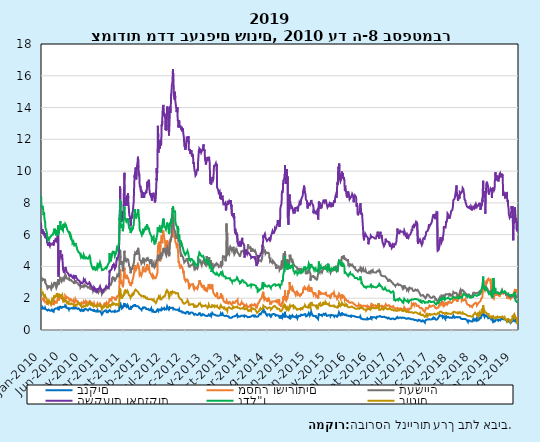
| Category | בנקים | מסחר ושירותים | תעשייה | השקעות ואחזקות | נדל"ן | ביטוח |
|---|---|---|---|---|---|---|
| 2010-01-02 | 1.445 | 2.104 | 3.277 | 6.786 | 8.48 | 2.651 |
| 2010-01-03 | 1.356 | 1.97 | 3.35 | 6.396 | 8.26 | 2.573 |
| 2010-01-04 | 1.299 | 1.884 | 3.279 | 6.237 | 8.004 | 2.469 |
| 2010-01-05 | 1.31 | 1.914 | 3.286 | 6.203 | 7.849 | 2.472 |
| 2010-01-06 | 1.352 | 1.98 | 3.297 | 6.229 | 7.878 | 2.472 |
| 2010-01-07 | 1.352 | 1.96 | 3.25 | 6.155 | 7.773 | 2.378 |
| 2010-01-08 | 1.352 | 1.96 | 3.25 | 6.155 | 7.773 | 2.378 |
| 2010-01-09 | 1.352 | 1.96 | 3.25 | 6.155 | 7.773 | 2.378 |
| 2010-01-10 | 1.344 | 1.93 | 3.135 | 6.077 | 7.675 | 2.347 |
| 2010-01-11 | 1.345 | 1.92 | 3.101 | 6.111 | 7.618 | 2.361 |
| 2010-01-12 | 1.443 | 2.02 | 3.234 | 6.333 | 7.81 | 2.43 |
| 2010-01-13 | 1.413 | 1.995 | 3.192 | 6.247 | 7.774 | 2.387 |
| 2010-01-14 | 1.405 | 1.983 | 3.141 | 6.208 | 7.703 | 2.363 |
| 2010-01-15 | 1.405 | 1.983 | 3.141 | 6.208 | 7.703 | 2.363 |
| 2010-01-16 | 1.405 | 1.983 | 3.141 | 6.208 | 7.703 | 2.363 |
| 2010-01-17 | 1.425 | 1.971 | 3.128 | 6.197 | 7.614 | 2.273 |
| 2010-01-18 | 1.436 | 2.028 | 3.193 | 6.2 | 7.576 | 2.263 |
| 2010-01-19 | 1.415 | 1.93 | 3.145 | 6.084 | 7.372 | 2.255 |
| 2010-01-20 | 1.35 | 1.887 | 3.114 | 6.013 | 7.23 | 2.165 |
| 2010-01-21 | 1.377 | 1.92 | 3.196 | 6.064 | 7.305 | 2.194 |
| 2010-01-22 | 1.377 | 1.92 | 3.196 | 6.064 | 7.305 | 2.194 |
| 2010-01-23 | 1.377 | 1.92 | 3.196 | 6.064 | 7.305 | 2.194 |
| 2010-01-24 | 1.401 | 1.952 | 3.253 | 6.189 | 7.424 | 2.203 |
| 2010-01-25 | 1.37 | 1.875 | 3.198 | 6.049 | 7.287 | 2.162 |
| 2010-01-26 | 1.335 | 1.863 | 3.159 | 6.047 | 7.158 | 2.099 |
| 2010-01-27 | 1.315 | 1.839 | 3.166 | 5.995 | 7.061 | 2.07 |
| 2010-01-28 | 1.333 | 1.812 | 3.144 | 5.907 | 6.96 | 2.079 |
| 2010-01-29 | 1.333 | 1.812 | 3.144 | 5.907 | 6.96 | 2.079 |
| 2010-01-30 | 1.333 | 1.812 | 3.144 | 5.907 | 6.96 | 2.079 |
| 2010-01-31 | 1.402 | 1.855 | 3.216 | 6.081 | 7.021 | 2.171 |
| 2010-02-01 | 1.411 | 1.848 | 3.218 | 6.066 | 6.969 | 2.175 |
| 2010-02-02 | 1.344 | 1.742 | 3.184 | 5.952 | 6.749 | 2.122 |
| 2010-02-03 | 1.325 | 1.723 | 2.955 | 5.778 | 6.435 | 2.08 |
| 2010-02-04 | 1.298 | 1.702 | 2.903 | 5.769 | 6.407 | 2.031 |
| 2010-02-05 | 1.298 | 1.702 | 2.903 | 5.769 | 6.407 | 2.031 |
| 2010-02-06 | 1.298 | 1.702 | 2.903 | 5.769 | 6.407 | 2.031 |
| 2010-02-07 | 1.32 | 1.723 | 2.925 | 5.863 | 6.427 | 2.028 |
| 2010-02-08 | 1.331 | 1.771 | 2.885 | 5.874 | 6.333 | 2.047 |
| 2010-02-09 | 1.32 | 1.789 | 2.918 | 5.933 | 6.341 | 2.034 |
| 2010-02-10 | 1.305 | 1.785 | 2.909 | 5.834 | 6.315 | 2.006 |
| 2010-02-11 | 1.282 | 1.799 | 2.837 | 5.802 | 6.219 | 1.965 |
| 2010-02-12 | 1.282 | 1.799 | 2.837 | 5.802 | 6.219 | 1.965 |
| 2010-02-13 | 1.282 | 1.799 | 2.837 | 5.802 | 6.219 | 1.965 |
| 2010-02-14 | 1.261 | 1.728 | 2.781 | 5.715 | 6.12 | 1.886 |
| 2010-02-15 | 1.285 | 1.734 | 2.76 | 5.727 | 6.042 | 1.865 |
| 2010-02-16 | 1.227 | 1.593 | 2.69 | 5.507 | 5.873 | 1.759 |
| 2010-02-17 | 1.235 | 1.651 | 2.664 | 5.478 | 5.858 | 1.72 |
| 2010-02-18 | 1.227 | 1.67 | 2.623 | 5.464 | 5.815 | 1.721 |
| 2010-02-19 | 1.227 | 1.67 | 2.623 | 5.464 | 5.815 | 1.721 |
| 2010-02-20 | 1.227 | 1.67 | 2.623 | 5.464 | 5.815 | 1.721 |
| 2010-02-21 | 1.208 | 1.633 | 2.597 | 5.384 | 5.679 | 1.704 |
| 2010-02-22 | 1.207 | 1.675 | 2.6 | 5.353 | 5.658 | 1.683 |
| 2010-02-23 | 1.222 | 1.674 | 2.64 | 5.301 | 5.706 | 1.764 |
| 2010-02-24 | 1.233 | 1.72 | 2.677 | 5.43 | 5.733 | 1.754 |
| 2010-02-25 | 1.285 | 1.732 | 2.724 | 5.448 | 5.775 | 1.814 |
| 2010-02-26 | 1.285 | 1.732 | 2.724 | 5.448 | 5.775 | 1.814 |
| 2010-02-27 | 1.285 | 1.732 | 2.724 | 5.448 | 5.775 | 1.814 |
| 2010-02-28 | 1.285 | 1.732 | 2.724 | 5.448 | 5.775 | 1.814 |
| 2010-03-01 | 1.316 | 1.76 | 2.802 | 5.517 | 5.814 | 1.865 |
| 2010-03-02 | 1.259 | 1.717 | 2.694 | 5.38 | 5.689 | 1.835 |
| 2010-03-03 | 1.26 | 1.691 | 2.684 | 5.34 | 5.658 | 1.834 |
| 2010-03-04 | 1.253 | 1.721 | 2.713 | 5.333 | 5.704 | 1.822 |
| 2010-03-05 | 1.253 | 1.721 | 2.713 | 5.333 | 5.704 | 1.822 |
| 2010-03-06 | 1.253 | 1.721 | 2.713 | 5.333 | 5.704 | 1.822 |
| 2010-03-07 | 1.226 | 1.636 | 2.69 | 5.293 | 5.685 | 1.777 |
| 2010-03-08 | 1.216 | 1.676 | 2.687 | 5.299 | 5.729 | 1.773 |
| 2010-03-09 | 1.254 | 1.726 | 2.729 | 5.442 | 5.829 | 1.825 |
| 2010-03-10 | 1.252 | 1.72 | 2.729 | 5.445 | 5.839 | 1.788 |
| 2010-03-11 | 1.245 | 1.717 | 2.726 | 5.427 | 5.87 | 1.813 |
| 2010-03-12 | 1.245 | 1.717 | 2.726 | 5.427 | 5.87 | 1.813 |
| 2010-03-13 | 1.245 | 1.717 | 2.726 | 5.427 | 5.87 | 1.813 |
| 2010-03-14 | 1.226 | 1.689 | 2.732 | 5.385 | 5.879 | 1.732 |
| 2010-03-15 | 1.211 | 1.623 | 2.706 | 5.349 | 5.863 | 1.711 |
| 2010-03-16 | 1.226 | 1.637 | 2.739 | 5.361 | 5.898 | 1.724 |
| 2010-03-17 | 1.213 | 1.661 | 2.704 | 5.333 | 5.842 | 1.689 |
| 2010-03-18 | 1.186 | 1.592 | 2.583 | 5.313 | 5.858 | 1.646 |
| 2010-03-19 | 1.186 | 1.592 | 2.583 | 5.313 | 5.858 | 1.646 |
| 2010-03-20 | 1.186 | 1.592 | 2.583 | 5.313 | 5.858 | 1.646 |
| 2010-03-21 | 1.215 | 1.599 | 2.591 | 5.37 | 5.88 | 1.615 |
| 2010-03-22 | 1.263 | 1.668 | 2.707 | 5.43 | 5.97 | 1.596 |
| 2010-03-23 | 1.277 | 1.741 | 2.851 | 5.478 | 6.014 | 1.603 |
| 2010-03-24 | 1.263 | 1.717 | 2.83 | 5.44 | 5.937 | 1.614 |
| 2010-03-25 | 1.249 | 1.69 | 2.847 | 5.466 | 5.982 | 1.92 |
| 2010-03-26 | 1.249 | 1.69 | 2.847 | 5.466 | 5.982 | 1.92 |
| 2010-03-27 | 1.249 | 1.69 | 2.847 | 5.466 | 5.982 | 1.92 |
| 2010-03-28 | 1.195 | 1.639 | 2.797 | 5.461 | 5.996 | 1.855 |
| 2010-03-29 | 1.195 | 1.639 | 2.797 | 5.461 | 5.996 | 1.855 |
| 2010-03-30 | 1.195 | 1.639 | 2.797 | 5.461 | 5.996 | 1.855 |
| 2010-03-31 | 1.156 | 1.622 | 2.726 | 5.459 | 6.007 | 1.834 |
| 2010-04-01 | 1.148 | 1.618 | 2.75 | 5.434 | 5.964 | 1.899 |
| 2010-04-02 | 1.148 | 1.618 | 2.75 | 5.434 | 5.964 | 1.899 |
| 2010-04-03 | 1.148 | 1.618 | 2.75 | 5.434 | 5.964 | 1.899 |
| 2010-04-04 | 1.148 | 1.618 | 2.75 | 5.434 | 5.964 | 1.899 |
| 2010-04-05 | 1.148 | 1.618 | 2.75 | 5.434 | 5.964 | 1.899 |
| 2010-04-06 | 1.168 | 1.669 | 2.831 | 5.319 | 6.054 | 1.95 |
| 2010-04-07 | 1.246 | 1.772 | 2.916 | 5.499 | 6.204 | 2.039 |
| 2010-04-08 | 1.3 | 1.843 | 3.021 | 5.642 | 6.372 | 2.118 |
| 2010-04-09 | 1.3 | 1.843 | 3.021 | 5.642 | 6.372 | 2.118 |
| 2010-04-10 | 1.3 | 1.843 | 3.021 | 5.642 | 6.372 | 2.118 |
| 2010-04-11 | 1.309 | 1.828 | 2.995 | 5.616 | 6.281 | 2.149 |
| 2010-04-12 | 1.256 | 1.73 | 2.927 | 5.52 | 6.195 | 2.098 |
| 2010-04-13 | 1.281 | 1.749 | 2.929 | 5.533 | 6.163 | 2.121 |
| 2010-04-14 | 1.312 | 1.79 | 2.915 | 5.569 | 6.173 | 2.14 |
| 2010-04-15 | 1.329 | 1.809 | 2.919 | 5.624 | 6.216 | 2.085 |
| 2010-04-16 | 1.329 | 1.809 | 2.919 | 5.624 | 6.216 | 2.085 |
| 2010-04-17 | 1.329 | 1.809 | 2.919 | 5.624 | 6.216 | 2.085 |
| 2010-04-18 | 1.35 | 1.87 | 2.962 | 5.696 | 6.271 | 2.159 |
| 2010-04-19 | 1.35 | 1.87 | 2.962 | 5.696 | 6.271 | 2.159 |
| 2010-04-20 | 1.35 | 1.87 | 2.962 | 5.696 | 6.271 | 2.159 |
| 2010-04-21 | 1.356 | 1.818 | 2.767 | 5.671 | 6.059 | 2.144 |
| 2010-04-22 | 1.322 | 1.764 | 2.711 | 5.635 | 6.082 | 2.142 |
| 2010-04-23 | 1.322 | 1.764 | 2.711 | 5.635 | 6.082 | 2.142 |
| 2010-04-24 | 1.322 | 1.764 | 2.711 | 5.635 | 6.082 | 2.142 |
| 2010-04-25 | 1.304 | 1.673 | 2.646 | 5.61 | 6.011 | 2.122 |
| 2010-04-26 | 1.327 | 1.697 | 2.668 | 5.615 | 6.05 | 2.14 |
| 2010-04-27 | 1.35 | 1.728 | 2.68 | 5.64 | 6.073 | 2.172 |
| 2010-04-28 | 1.363 | 1.77 | 2.675 | 5.782 | 6.143 | 2.206 |
| 2010-04-29 | 1.382 | 1.81 | 2.745 | 5.844 | 6.289 | 2.332 |
| 2010-04-30 | 1.382 | 1.81 | 2.745 | 5.844 | 6.289 | 2.332 |
| 2010-05-01 | 1.382 | 1.81 | 2.745 | 5.844 | 6.289 | 2.332 |
| 2010-05-02 | 1.371 | 1.853 | 2.737 | 5.838 | 6.313 | 2.249 |
| 2010-05-03 | 1.323 | 1.815 | 2.716 | 5.634 | 5.929 | 2.196 |
| 2010-05-04 | 1.334 | 1.875 | 2.729 | 5.658 | 5.98 | 2.168 |
| 2010-05-05 | 1.376 | 1.957 | 2.867 | 5.931 | 6.159 | 2.174 |
| 2010-05-06 | 1.409 | 2.058 | 3.047 | 6.112 | 6.273 | 2.229 |
| 2010-05-07 | 1.409 | 2.058 | 3.047 | 6.112 | 6.273 | 2.229 |
| 2010-05-08 | 1.409 | 2.058 | 3.047 | 6.112 | 6.273 | 2.229 |
| 2010-05-09 | 1.462 | 2.172 | 3.207 | 6.421 | 6.587 | 2.285 |
| 2010-05-10 | 1.324 | 1.972 | 3.002 | 3.48 | 6.23 | 2.114 |
| 2010-05-11 | 1.295 | 1.945 | 2.989 | 3.478 | 6.216 | 2.113 |
| 2010-05-12 | 1.246 | 1.844 | 2.855 | 3.348 | 6.062 | 2.067 |
| 2010-05-13 | 1.281 | 1.875 | 2.853 | 3.368 | 6.075 | 2.061 |
| 2010-05-14 | 1.281 | 1.875 | 2.853 | 3.368 | 6.075 | 2.061 |
| 2010-05-15 | 1.281 | 1.875 | 2.853 | 3.368 | 6.075 | 2.061 |
| 2010-05-16 | 1.386 | 2.056 | 3.006 | 4.284 | 6.432 | 2.192 |
| 2010-05-17 | 1.338 | 1.956 | 2.995 | 4.244 | 6.39 | 2.169 |
| 2010-05-18 | 1.338 | 1.956 | 2.995 | 4.244 | 6.39 | 2.169 |
| 2010-05-19 | 1.338 | 1.956 | 2.995 | 4.244 | 6.39 | 2.169 |
| 2010-05-20 | 1.435 | 2.087 | 3.087 | 4.523 | 6.335 | 2.068 |
| 2010-05-21 | 1.435 | 2.087 | 3.087 | 4.523 | 6.335 | 2.068 |
| 2010-05-22 | 1.435 | 2.087 | 3.087 | 4.523 | 6.335 | 2.068 |
| 2010-05-23 | 1.449 | 2.112 | 3.117 | 4.594 | 6.396 | 2.081 |
| 2010-05-24 | 1.479 | 2.139 | 3.204 | 4.732 | 6.565 | 2.131 |
| 2010-05-25 | 1.518 | 2.193 | 3.344 | 5.022 | 6.851 | 2.242 |
| 2010-05-26 | 1.478 | 2.156 | 3.298 | 4.882 | 6.736 | 2.152 |
| 2010-05-27 | 1.417 | 2.028 | 3.195 | 4.746 | 6.583 | 2.139 |
| 2010-05-28 | 1.417 | 2.028 | 3.195 | 4.746 | 6.583 | 2.139 |
| 2010-05-29 | 1.417 | 2.028 | 3.195 | 4.746 | 6.583 | 2.139 |
| 2010-05-30 | 1.422 | 2.007 | 3.138 | 4.704 | 6.509 | 2.145 |
| 2010-05-31 | 1.381 | 1.988 | 3.119 | 4.696 | 6.477 | 2.118 |
| 2010-06-01 | 1.409 | 2.025 | 3.135 | 4.687 | 6.467 | 2.143 |
| 2010-06-02 | 1.41 | 2.016 | 3.11 | 4.677 | 6.432 | 2.138 |
| 2010-06-03 | 1.394 | 1.974 | 3.048 | 4.577 | 6.285 | 2.105 |
| 2010-06-04 | 1.394 | 1.974 | 3.048 | 4.577 | 6.285 | 2.105 |
| 2010-06-05 | 1.394 | 1.974 | 3.048 | 4.577 | 6.285 | 2.105 |
| 2010-06-06 | 1.416 | 1.956 | 3.068 | 4.598 | 6.293 | 2.155 |
| 2010-06-07 | 1.427 | 1.998 | 3.107 | 4.63 | 6.354 | 2.157 |
| 2010-06-08 | 1.445 | 2.038 | 3.139 | 4.646 | 6.389 | 2.207 |
| 2010-06-09 | 1.445 | 1.995 | 3.09 | 4.614 | 6.321 | 2.168 |
| 2010-06-10 | 1.45 | 2.023 | 3.091 | 4.621 | 6.303 | 2.133 |
| 2010-06-11 | 1.45 | 2.023 | 3.091 | 4.621 | 6.303 | 2.133 |
| 2010-06-12 | 1.45 | 2.023 | 3.091 | 4.621 | 6.303 | 2.133 |
| 2010-06-13 | 1.459 | 1.991 | 3.081 | 4.635 | 6.259 | 2.123 |
| 2010-06-14 | 1.485 | 2.017 | 3.103 | 4.665 | 6.235 | 2.132 |
| 2010-06-15 | 1.468 | 1.979 | 3.272 | 3.751 | 6.683 | 1.781 |
| 2010-06-16 | 1.509 | 2.035 | 3.33 | 3.763 | 6.733 | 1.818 |
| 2010-06-17 | 1.45 | 2.003 | 3.3 | 3.69 | 6.689 | 1.81 |
| 2010-06-18 | 1.45 | 2.003 | 3.3 | 3.69 | 6.689 | 1.81 |
| 2010-06-19 | 1.45 | 2.003 | 3.3 | 3.69 | 6.689 | 1.81 |
| 2010-06-20 | 1.443 | 2.019 | 3.221 | 3.657 | 6.65 | 1.733 |
| 2010-06-21 | 1.43 | 1.945 | 3.137 | 3.585 | 6.47 | 1.764 |
| 2010-06-22 | 1.458 | 1.969 | 3.14 | 3.59 | 6.451 | 1.793 |
| 2010-06-23 | 1.476 | 1.976 | 3.145 | 3.587 | 6.416 | 1.799 |
| 2010-06-24 | 1.499 | 1.971 | 3.202 | 3.65 | 6.481 | 1.819 |
| 2010-06-25 | 1.499 | 1.971 | 3.202 | 3.65 | 6.481 | 1.819 |
| 2010-06-26 | 1.499 | 1.971 | 3.202 | 3.65 | 6.481 | 1.819 |
| 2010-06-27 | 1.48 | 1.922 | 3.205 | 3.651 | 6.464 | 1.785 |
| 2010-06-28 | 1.485 | 1.935 | 3.294 | 3.654 | 6.419 | 1.793 |
| 2010-06-29 | 1.51 | 2.019 | 3.409 | 3.777 | 6.501 | 1.807 |
| 2010-06-30 | 1.555 | 2.167 | 3.504 | 3.867 | 6.59 | 1.857 |
| 2010-07-01 | 1.575 | 2.205 | 3.482 | 3.966 | 6.675 | 1.924 |
| 2010-07-02 | 1.575 | 2.205 | 3.482 | 3.966 | 6.675 | 1.924 |
| 2010-07-03 | 1.575 | 2.205 | 3.482 | 3.966 | 6.675 | 1.924 |
| 2010-07-04 | 1.558 | 2.174 | 3.451 | 3.975 | 6.625 | 1.928 |
| 2010-07-05 | 1.555 | 2.148 | 3.437 | 3.929 | 6.614 | 1.965 |
| 2010-07-06 | 1.519 | 2.132 | 3.378 | 3.856 | 6.612 | 1.879 |
| 2010-07-07 | 1.487 | 2.083 | 3.363 | 3.814 | 6.613 | 1.835 |
| 2010-07-08 | 1.403 | 2.001 | 3.306 | 3.729 | 6.528 | 1.768 |
| 2010-07-09 | 1.403 | 2.001 | 3.306 | 3.729 | 6.528 | 1.768 |
| 2010-07-10 | 1.403 | 2.001 | 3.306 | 3.729 | 6.528 | 1.768 |
| 2010-07-11 | 1.365 | 1.959 | 3.244 | 3.66 | 6.458 | 1.725 |
| 2010-07-12 | 1.355 | 1.993 | 3.275 | 3.677 | 6.445 | 1.704 |
| 2010-07-13 | 1.372 | 2.029 | 3.257 | 3.623 | 6.395 | 1.727 |
| 2010-07-14 | 1.411 | 2.062 | 3.268 | 3.649 | 6.417 | 1.768 |
| 2010-07-15 | 1.369 | 2.056 | 3.223 | 3.607 | 6.33 | 1.708 |
| 2010-07-16 | 1.369 | 2.056 | 3.223 | 3.607 | 6.33 | 1.708 |
| 2010-07-17 | 1.369 | 2.056 | 3.223 | 3.607 | 6.33 | 1.708 |
| 2010-07-18 | 1.358 | 2.045 | 3.254 | 3.606 | 6.292 | 1.714 |
| 2010-07-19 | 1.347 | 2.011 | 3.229 | 3.58 | 6.237 | 1.712 |
| 2010-07-20 | 1.347 | 2.011 | 3.229 | 3.58 | 6.237 | 1.712 |
| 2010-07-21 | 1.343 | 2.014 | 3.223 | 3.572 | 6.204 | 1.73 |
| 2010-07-22 | 1.362 | 2.029 | 3.249 | 3.576 | 6.212 | 1.774 |
| 2010-07-23 | 1.362 | 2.029 | 3.249 | 3.576 | 6.212 | 1.774 |
| 2010-07-24 | 1.362 | 2.029 | 3.249 | 3.576 | 6.212 | 1.774 |
| 2010-07-25 | 1.363 | 2.043 | 3.256 | 3.534 | 6.206 | 1.735 |
| 2010-07-26 | 1.346 | 2.023 | 3.229 | 3.512 | 6.201 | 1.695 |
| 2010-07-27 | 1.299 | 1.956 | 3.175 | 3.453 | 6.127 | 1.637 |
| 2010-07-28 | 1.307 | 1.954 | 3.155 | 3.443 | 6.143 | 1.632 |
| 2010-07-29 | 1.369 | 2.017 | 3.244 | 3.499 | 6.211 | 1.672 |
| 2010-07-30 | 1.369 | 2.017 | 3.244 | 3.499 | 6.211 | 1.672 |
| 2010-07-31 | 1.369 | 2.017 | 3.244 | 3.499 | 6.211 | 1.672 |
| 2010-08-01 | 1.366 | 1.966 | 3.226 | 3.505 | 6.16 | 1.658 |
| 2010-08-02 | 1.377 | 1.929 | 3.197 | 3.506 | 6.107 | 1.675 |
| 2010-08-03 | 1.348 | 1.855 | 3.132 | 3.475 | 6.051 | 1.62 |
| 2010-08-04 | 1.344 | 1.863 | 3.119 | 3.432 | 5.934 | 1.601 |
| 2010-08-05 | 1.34 | 1.814 | 3.128 | 3.395 | 5.91 | 1.628 |
| 2010-08-06 | 1.34 | 1.814 | 3.128 | 3.395 | 5.91 | 1.628 |
| 2010-08-07 | 1.34 | 1.814 | 3.128 | 3.395 | 5.91 | 1.628 |
| 2010-08-08 | 1.347 | 1.84 | 3.077 | 3.394 | 5.836 | 1.635 |
| 2010-08-09 | 1.367 | 1.898 | 3.137 | 3.433 | 5.867 | 1.64 |
| 2010-08-10 | 1.367 | 1.942 | 3.163 | 3.448 | 5.895 | 1.639 |
| 2010-08-11 | 1.375 | 1.935 | 3.153 | 3.461 | 5.927 | 1.663 |
| 2010-08-12 | 1.377 | 1.918 | 3.175 | 3.449 | 5.949 | 1.679 |
| 2010-08-13 | 1.377 | 1.918 | 3.175 | 3.449 | 5.949 | 1.679 |
| 2010-08-14 | 1.377 | 1.918 | 3.175 | 3.449 | 5.949 | 1.679 |
| 2010-08-15 | 1.37 | 1.947 | 3.205 | 3.461 | 5.905 | 1.671 |
| 2010-08-16 | 1.35 | 1.87 | 3.116 | 3.396 | 5.776 | 1.644 |
| 2010-08-17 | 1.365 | 1.887 | 3.109 | 3.414 | 5.721 | 1.662 |
| 2010-08-18 | 1.363 | 1.878 | 3.1 | 3.414 | 5.667 | 1.65 |
| 2010-08-19 | 1.359 | 1.839 | 3.064 | 3.364 | 5.654 | 1.621 |
| 2010-08-20 | 1.359 | 1.839 | 3.064 | 3.364 | 5.654 | 1.621 |
| 2010-08-21 | 1.359 | 1.839 | 3.064 | 3.364 | 5.654 | 1.621 |
| 2010-08-22 | 1.355 | 1.86 | 3.055 | 3.365 | 5.587 | 1.626 |
| 2010-08-23 | 1.337 | 1.821 | 3.027 | 3.305 | 5.471 | 1.611 |
| 2010-08-24 | 1.326 | 1.812 | 3.009 | 3.299 | 5.476 | 1.606 |
| 2010-08-25 | 1.346 | 1.851 | 3.069 | 3.34 | 5.519 | 1.622 |
| 2010-08-26 | 1.348 | 1.812 | 3.04 | 3.303 | 5.447 | 1.636 |
| 2010-08-27 | 1.348 | 1.812 | 3.04 | 3.303 | 5.447 | 1.636 |
| 2010-08-28 | 1.348 | 1.812 | 3.04 | 3.303 | 5.447 | 1.636 |
| 2010-08-29 | 1.38 | 1.838 | 3.056 | 3.32 | 5.523 | 1.62 |
| 2010-08-30 | 1.433 | 1.886 | 3.086 | 3.388 | 5.566 | 1.647 |
| 2010-08-31 | 1.431 | 1.886 | 3.091 | 3.414 | 5.579 | 1.657 |
| 2010-09-01 | 1.401 | 1.846 | 3.051 | 3.363 | 5.494 | 1.614 |
| 2010-09-02 | 1.357 | 1.788 | 2.947 | 3.289 | 5.431 | 1.575 |
| 2010-09-03 | 1.357 | 1.788 | 2.947 | 3.289 | 5.431 | 1.575 |
| 2010-09-04 | 1.357 | 1.788 | 2.947 | 3.289 | 5.431 | 1.575 |
| 2010-09-05 | 1.316 | 1.71 | 2.914 | 3.245 | 5.326 | 1.544 |
| 2010-09-06 | 1.315 | 1.703 | 2.922 | 3.224 | 5.278 | 1.471 |
| 2010-09-07 | 1.356 | 1.738 | 2.954 | 3.278 | 5.272 | 1.537 |
| 2010-09-08 | 1.356 | 1.738 | 2.954 | 3.278 | 5.272 | 1.537 |
| 2010-09-09 | 1.356 | 1.738 | 2.954 | 3.278 | 5.272 | 1.537 |
| 2010-09-10 | 1.356 | 1.738 | 2.954 | 3.278 | 5.272 | 1.537 |
| 2010-09-11 | 1.356 | 1.738 | 2.954 | 3.278 | 5.272 | 1.537 |
| 2010-09-12 | 1.397 | 1.802 | 2.99 | 3.323 | 5.355 | 1.549 |
| 2010-09-13 | 1.428 | 1.846 | 3.035 | 3.389 | 5.4 | 1.583 |
| 2010-09-14 | 1.481 | 1.941 | 3.138 | 3.453 | 5.476 | 1.596 |
| 2010-09-15 | 1.449 | 1.884 | 3.034 | 3.417 | 5.439 | 1.59 |
| 2010-09-16 | 1.399 | 1.891 | 3.015 | 3.369 | 5.405 | 1.574 |
| 2010-09-17 | 1.399 | 1.891 | 3.015 | 3.369 | 5.405 | 1.574 |
| 2010-09-18 | 1.399 | 1.891 | 3.015 | 3.369 | 5.405 | 1.574 |
| 2010-09-19 | 1.373 | 1.851 | 3.012 | 3.325 | 5.353 | 1.53 |
| 2010-09-20 | 1.375 | 1.859 | 2.973 | 3.319 | 5.348 | 1.549 |
| 2010-09-21 | 1.373 | 1.847 | 2.984 | 3.288 | 5.263 | 1.542 |
| 2010-09-22 | 1.373 | 1.847 | 2.984 | 3.288 | 5.263 | 1.542 |
| 2010-09-23 | 1.373 | 1.847 | 2.984 | 3.288 | 5.263 | 1.542 |
| 2010-09-24 | 1.373 | 1.847 | 2.984 | 3.288 | 5.263 | 1.542 |
| 2010-09-25 | 1.373 | 1.847 | 2.984 | 3.288 | 5.263 | 1.542 |
| 2010-09-26 | 1.413 | 1.867 | 3.029 | 3.31 | 5.138 | 1.614 |
| 2010-09-27 | 1.415 | 1.831 | 3.019 | 3.287 | 5.123 | 1.654 |
| 2010-09-28 | 1.328 | 1.753 | 2.959 | 3.198 | 5.032 | 1.652 |
| 2010-09-29 | 1.328 | 1.753 | 2.959 | 3.198 | 5.032 | 1.652 |
| 2010-09-30 | 1.328 | 1.753 | 2.959 | 3.198 | 5.032 | 1.652 |
| 2010-10-01 | 1.328 | 1.753 | 2.959 | 3.198 | 5.032 | 1.652 |
| 2010-10-02 | 1.328 | 1.753 | 2.959 | 3.198 | 5.032 | 1.652 |
| 2010-10-03 | 1.343 | 1.796 | 2.948 | 3.207 | 5.015 | 1.66 |
| 2010-10-04 | 1.318 | 1.739 | 2.887 | 3.149 | 4.96 | 1.641 |
| 2010-10-05 | 1.316 | 1.686 | 2.852 | 3.131 | 4.905 | 1.668 |
| 2010-10-06 | 1.329 | 1.739 | 2.828 | 3.119 | 4.893 | 1.68 |
| 2010-10-07 | 1.361 | 1.725 | 2.845 | 3.118 | 4.894 | 1.723 |
| 2010-10-08 | 1.361 | 1.725 | 2.845 | 3.118 | 4.894 | 1.723 |
| 2010-10-09 | 1.361 | 1.725 | 2.845 | 3.118 | 4.894 | 1.723 |
| 2010-10-10 | 1.344 | 1.737 | 2.818 | 3.127 | 4.871 | 1.698 |
| 2010-10-11 | 1.359 | 1.734 | 2.861 | 3.146 | 4.911 | 1.741 |
| 2010-10-12 | 1.322 | 1.66 | 2.861 | 3.09 | 4.889 | 1.691 |
| 2010-10-13 | 1.297 | 1.678 | 2.859 | 3.093 | 4.853 | 1.653 |
| 2010-10-14 | 1.31 | 1.701 | 2.849 | 3.084 | 4.866 | 1.668 |
| 2010-10-15 | 1.31 | 1.701 | 2.849 | 3.084 | 4.866 | 1.668 |
| 2010-10-16 | 1.31 | 1.701 | 2.849 | 3.084 | 4.866 | 1.668 |
| 2010-10-17 | 1.294 | 1.699 | 2.817 | 3.043 | 4.863 | 1.636 |
| 2010-10-18 | 1.305 | 1.707 | 2.821 | 3.046 | 4.818 | 1.659 |
| 2010-10-19 | 1.314 | 1.707 | 2.791 | 3.043 | 4.872 | 1.683 |
| 2010-10-20 | 1.258 | 1.671 | 2.753 | 2.989 | 4.764 | 1.593 |
| 2010-10-21 | 1.212 | 1.645 | 2.682 | 2.921 | 4.694 | 1.545 |
| 2010-10-22 | 1.212 | 1.645 | 2.682 | 2.921 | 4.694 | 1.545 |
| 2010-10-23 | 1.212 | 1.645 | 2.682 | 2.921 | 4.694 | 1.545 |
| 2010-10-24 | 1.214 | 1.655 | 2.707 | 2.939 | 4.61 | 1.509 |
| 2010-10-25 | 1.204 | 1.636 | 2.723 | 2.927 | 4.578 | 1.496 |
| 2010-10-26 | 1.251 | 1.66 | 2.769 | 2.989 | 4.653 | 1.495 |
| 2010-10-27 | 1.266 | 1.684 | 2.804 | 3.01 | 4.69 | 1.481 |
| 2010-10-28 | 1.282 | 1.716 | 2.812 | 3.02 | 4.678 | 1.545 |
| 2010-10-29 | 1.282 | 1.716 | 2.812 | 3.02 | 4.678 | 1.545 |
| 2010-10-30 | 1.282 | 1.716 | 2.812 | 3.02 | 4.678 | 1.545 |
| 2010-10-31 | 1.26 | 1.651 | 2.76 | 2.954 | 4.636 | 1.513 |
| 2010-11-01 | 1.214 | 1.627 | 2.715 | 2.937 | 4.574 | 1.514 |
| 2010-11-02 | 1.229 | 1.655 | 2.717 | 2.965 | 4.573 | 1.492 |
| 2010-11-03 | 1.216 | 1.627 | 2.712 | 2.947 | 4.52 | 1.457 |
| 2010-11-04 | 1.228 | 1.629 | 2.736 | 2.949 | 4.537 | 1.476 |
| 2010-11-05 | 1.228 | 1.629 | 2.736 | 2.949 | 4.537 | 1.476 |
| 2010-11-06 | 1.228 | 1.629 | 2.736 | 2.949 | 4.537 | 1.476 |
| 2010-11-07 | 1.234 | 1.653 | 2.703 | 2.98 | 4.552 | 1.477 |
| 2010-11-08 | 1.218 | 1.667 | 2.695 | 2.989 | 4.567 | 1.418 |
| 2010-11-09 | 1.196 | 1.646 | 2.699 | 2.953 | 4.522 | 1.397 |
| 2010-11-10 | 1.224 | 1.689 | 2.709 | 3.002 | 4.535 | 1.441 |
| 2010-11-11 | 1.268 | 1.689 | 2.752 | 3.013 | 4.595 | 1.448 |
| 2010-11-12 | 1.268 | 1.689 | 2.752 | 3.013 | 4.595 | 1.448 |
| 2010-11-13 | 1.268 | 1.689 | 2.752 | 3.013 | 4.595 | 1.448 |
| 2010-11-14 | 1.3 | 1.793 | 2.85 | 3.156 | 4.733 | 1.468 |
| 2010-11-15 | 1.277 | 1.8 | 2.83 | 3.147 | 4.73 | 1.472 |
| 2010-11-16 | 1.281 | 1.798 | 2.795 | 3.125 | 4.735 | 1.523 |
| 2010-11-17 | 1.27 | 1.727 | 2.753 | 3.09 | 4.686 | 1.529 |
| 2010-11-18 | 1.244 | 1.697 | 2.738 | 3.102 | 4.648 | 1.505 |
| 2010-11-19 | 1.244 | 1.697 | 2.738 | 3.102 | 4.648 | 1.505 |
| 2010-11-20 | 1.244 | 1.697 | 2.738 | 3.102 | 4.648 | 1.505 |
| 2010-11-21 | 1.26 | 1.665 | 2.8 | 3.104 | 4.58 | 1.505 |
| 2010-11-22 | 1.316 | 1.717 | 2.837 | 3.152 | 4.626 | 1.521 |
| 2010-11-23 | 1.31 | 1.698 | 2.843 | 3.162 | 4.638 | 1.544 |
| 2010-11-24 | 1.301 | 1.674 | 2.801 | 3.135 | 4.593 | 1.483 |
| 2010-11-25 | 1.3 | 1.67 | 2.755 | 3.097 | 4.511 | 1.493 |
| 2010-11-26 | 1.3 | 1.67 | 2.755 | 3.097 | 4.511 | 1.493 |
| 2010-11-27 | 1.3 | 1.67 | 2.755 | 3.097 | 4.511 | 1.493 |
| 2010-11-28 | 1.303 | 1.691 | 2.744 | 3.105 | 4.463 | 1.474 |
| 2010-11-29 | 1.291 | 1.66 | 2.72 | 3.066 | 4.45 | 1.495 |
| 2010-11-30 | 1.334 | 1.834 | 2.752 | 3.009 | 4.495 | 1.538 |
| 2010-12-01 | 1.31 | 1.886 | 2.738 | 3.035 | 4.575 | 1.525 |
| 2010-12-02 | 1.31 | 1.865 | 2.766 | 3.025 | 4.582 | 1.529 |
| 2010-12-03 | 1.31 | 1.865 | 2.766 | 3.025 | 4.582 | 1.529 |
| 2010-12-04 | 1.31 | 1.865 | 2.766 | 3.025 | 4.582 | 1.529 |
| 2010-12-05 | 1.291 | 1.838 | 2.791 | 2.977 | 4.58 | 1.606 |
| 2010-12-06 | 1.283 | 1.799 | 2.757 | 2.938 | 4.553 | 1.593 |
| 2010-12-07 | 1.283 | 1.771 | 2.753 | 2.942 | 4.536 | 1.581 |
| 2010-12-08 | 1.277 | 1.773 | 2.739 | 2.945 | 4.505 | 1.58 |
| 2010-12-09 | 1.272 | 1.742 | 2.734 | 2.919 | 4.494 | 1.57 |
| 2010-12-10 | 1.272 | 1.742 | 2.734 | 2.919 | 4.494 | 1.57 |
| 2010-12-11 | 1.272 | 1.742 | 2.734 | 2.919 | 4.494 | 1.57 |
| 2010-12-12 | 1.286 | 1.768 | 2.752 | 2.911 | 4.521 | 1.565 |
| 2010-12-13 | 1.27 | 1.722 | 2.723 | 2.915 | 4.532 | 1.539 |
| 2010-12-14 | 1.245 | 1.726 | 2.699 | 2.892 | 4.528 | 1.528 |
| 2010-12-15 | 1.259 | 1.73 | 2.658 | 2.904 | 4.525 | 1.572 |
| 2010-12-16 | 1.231 | 1.657 | 2.615 | 2.894 | 4.486 | 1.535 |
| 2010-12-17 | 1.231 | 1.657 | 2.615 | 2.894 | 4.486 | 1.535 |
| 2010-12-18 | 1.231 | 1.657 | 2.615 | 2.894 | 4.486 | 1.535 |
| 2010-12-19 | 1.278 | 1.683 | 2.62 | 2.92 | 4.528 | 1.606 |
| 2010-12-20 | 1.279 | 1.681 | 2.618 | 2.894 | 4.525 | 1.601 |
| 2010-12-21 | 1.265 | 1.666 | 2.623 | 2.872 | 4.496 | 1.582 |
| 2010-12-22 | 1.298 | 1.713 | 2.666 | 2.915 | 4.53 | 1.592 |
| 2010-12-23 | 1.301 | 1.739 | 2.67 | 2.966 | 4.609 | 1.594 |
| 2010-12-24 | 1.301 | 1.739 | 2.67 | 2.966 | 4.609 | 1.594 |
| 2010-12-25 | 1.301 | 1.739 | 2.67 | 2.966 | 4.609 | 1.594 |
| 2010-12-26 | 1.326 | 1.788 | 2.66 | 2.995 | 4.635 | 1.628 |
| 2010-12-27 | 1.335 | 1.805 | 2.729 | 3.007 | 4.665 | 1.688 |
| 2010-12-28 | 1.358 | 1.826 | 2.758 | 3.057 | 4.674 | 1.73 |
| 2010-12-29 | 1.345 | 1.845 | 2.737 | 3.02 | 4.628 | 1.721 |
| 2010-12-30 | 1.348 | 1.863 | 2.73 | 3.034 | 4.624 | 1.76 |
| 2010-12-31 | 1.348 | 1.863 | 2.73 | 3.034 | 4.624 | 1.76 |
| 2011-01-01 | 1.348 | 1.863 | 2.73 | 3.034 | 4.624 | 1.76 |
| 2011-01-02 | 1.324 | 1.807 | 2.68 | 2.973 | 4.547 | 1.763 |
| 2011-01-03 | 1.286 | 1.745 | 2.599 | 2.895 | 4.39 | 1.677 |
| 2011-01-04 | 1.306 | 1.788 | 2.567 | 2.893 | 4.306 | 1.676 |
| 2011-01-05 | 1.273 | 1.788 | 2.529 | 2.884 | 4.319 | 1.638 |
| 2011-01-06 | 1.233 | 1.723 | 2.619 | 2.804 | 4.21 | 1.593 |
| 2011-01-07 | 1.233 | 1.723 | 2.619 | 2.804 | 4.21 | 1.593 |
| 2011-01-08 | 1.233 | 1.723 | 2.619 | 2.804 | 4.21 | 1.593 |
| 2011-01-09 | 1.229 | 1.741 | 2.617 | 2.778 | 4.162 | 1.594 |
| 2011-01-10 | 1.262 | 1.756 | 2.598 | 2.787 | 4.113 | 1.624 |
| 2011-01-11 | 1.263 | 1.729 | 2.61 | 2.765 | 4.069 | 1.645 |
| 2011-01-12 | 1.245 | 1.689 | 2.566 | 2.733 | 4.031 | 1.635 |
| 2011-01-13 | 1.276 | 1.704 | 2.56 | 2.764 | 3.986 | 1.632 |
| 2011-01-14 | 1.276 | 1.704 | 2.56 | 2.764 | 3.986 | 1.632 |
| 2011-01-15 | 1.276 | 1.704 | 2.56 | 2.764 | 3.986 | 1.632 |
| 2011-01-16 | 1.243 | 1.708 | 2.576 | 2.714 | 3.926 | 1.558 |
| 2011-01-17 | 1.226 | 1.68 | 2.547 | 2.722 | 3.91 | 1.552 |
| 2011-01-18 | 1.241 | 1.687 | 2.587 | 2.743 | 3.924 | 1.57 |
| 2011-01-19 | 1.245 | 1.676 | 2.599 | 2.697 | 3.912 | 1.586 |
| 2011-01-20 | 1.221 | 1.643 | 2.523 | 2.618 | 3.888 | 1.558 |
| 2011-01-21 | 1.221 | 1.643 | 2.523 | 2.618 | 3.888 | 1.558 |
| 2011-01-22 | 1.221 | 1.643 | 2.523 | 2.618 | 3.888 | 1.558 |
| 2011-01-23 | 1.197 | 1.593 | 2.457 | 2.586 | 3.841 | 1.541 |
| 2011-01-24 | 1.205 | 1.609 | 2.456 | 2.57 | 3.85 | 1.569 |
| 2011-01-25 | 1.192 | 1.551 | 2.447 | 2.526 | 3.813 | 1.546 |
| 2011-01-26 | 1.201 | 1.522 | 2.444 | 2.477 | 3.768 | 1.519 |
| 2011-01-27 | 1.204 | 1.522 | 2.457 | 2.447 | 3.758 | 1.502 |
| 2011-01-28 | 1.204 | 1.522 | 2.457 | 2.447 | 3.758 | 1.502 |
| 2011-01-29 | 1.204 | 1.522 | 2.457 | 2.447 | 3.758 | 1.502 |
| 2011-01-30 | 1.299 | 1.689 | 2.596 | 2.691 | 3.996 | 1.523 |
| 2011-01-31 | 1.259 | 1.638 | 2.573 | 2.674 | 3.924 | 1.519 |
| 2011-02-01 | 1.263 | 1.654 | 2.564 | 2.748 | 3.933 | 1.524 |
| 2011-02-02 | 1.204 | 1.611 | 2.5 | 2.638 | 3.85 | 1.495 |
| 2011-02-03 | 1.187 | 1.58 | 2.485 | 2.631 | 3.847 | 1.501 |
| 2011-02-04 | 1.187 | 1.58 | 2.485 | 2.631 | 3.847 | 1.501 |
| 2011-02-05 | 1.187 | 1.58 | 2.485 | 2.631 | 3.847 | 1.501 |
| 2011-02-06 | 1.186 | 1.61 | 2.521 | 2.61 | 3.854 | 1.488 |
| 2011-02-07 | 1.184 | 1.573 | 2.451 | 2.543 | 3.84 | 1.49 |
| 2011-02-08 | 1.185 | 1.553 | 2.42 | 2.487 | 3.805 | 1.508 |
| 2011-02-09 | 1.172 | 1.514 | 2.4 | 2.483 | 3.799 | 1.532 |
| 2011-02-10 | 1.169 | 1.535 | 2.405 | 2.508 | 3.79 | 1.52 |
| 2011-02-11 | 1.169 | 1.535 | 2.405 | 2.508 | 3.79 | 1.52 |
| 2011-02-12 | 1.169 | 1.535 | 2.405 | 2.508 | 3.79 | 1.52 |
| 2011-02-13 | 1.167 | 1.491 | 2.359 | 2.477 | 3.771 | 1.502 |
| 2011-02-14 | 1.183 | 1.487 | 2.374 | 2.473 | 3.79 | 1.521 |
| 2011-02-15 | 1.175 | 1.476 | 2.363 | 2.437 | 3.75 | 1.484 |
| 2011-02-16 | 1.176 | 1.488 | 2.37 | 2.425 | 3.927 | 1.519 |
| 2011-02-17 | 1.167 | 1.508 | 2.334 | 2.439 | 3.92 | 1.486 |
| 2011-02-18 | 1.167 | 1.508 | 2.334 | 2.439 | 3.92 | 1.486 |
| 2011-02-19 | 1.167 | 1.508 | 2.334 | 2.439 | 3.92 | 1.486 |
| 2011-02-20 | 1.148 | 1.51 | 2.316 | 2.432 | 3.882 | 1.458 |
| 2011-02-21 | 1.144 | 1.496 | 2.316 | 2.42 | 3.853 | 1.451 |
| 2011-02-22 | 1.162 | 1.533 | 2.357 | 2.468 | 3.916 | 1.449 |
| 2011-02-23 | 1.17 | 1.542 | 2.367 | 2.482 | 3.901 | 1.471 |
| 2011-02-24 | 1.261 | 1.67 | 2.481 | 2.635 | 4.073 | 1.57 |
| 2011-02-25 | 1.261 | 1.67 | 2.481 | 2.635 | 4.073 | 1.57 |
| 2011-02-26 | 1.261 | 1.67 | 2.481 | 2.635 | 4.073 | 1.57 |
| 2011-02-27 | 1.253 | 1.602 | 2.463 | 2.589 | 4.025 | 1.596 |
| 2011-02-28 | 1.222 | 1.562 | 2.425 | 2.534 | 3.999 | 1.581 |
| 2011-03-01 | 1.157 | 1.537 | 2.397 | 2.502 | 3.945 | 1.533 |
| 2011-03-02 | 1.184 | 1.567 | 2.478 | 2.567 | 4.095 | 1.579 |
| 2011-03-03 | 1.151 | 1.547 | 2.434 | 2.546 | 4.072 | 1.543 |
| 2011-03-04 | 1.151 | 1.547 | 2.434 | 2.546 | 4.072 | 1.543 |
| 2011-03-05 | 1.151 | 1.547 | 2.434 | 2.546 | 4.072 | 1.543 |
| 2011-03-06 | 1.148 | 1.552 | 2.398 | 2.571 | 4.087 | 1.536 |
| 2011-03-07 | 1.122 | 1.533 | 2.401 | 2.592 | 4.044 | 1.501 |
| 2011-03-08 | 1.138 | 1.558 | 2.432 | 2.614 | 4.009 | 1.536 |
| 2011-03-09 | 1.168 | 1.56 | 2.453 | 2.637 | 4.017 | 1.518 |
| 2011-03-10 | 1.162 | 1.562 | 2.453 | 2.618 | 4.013 | 1.519 |
| 2011-03-11 | 1.162 | 1.562 | 2.453 | 2.618 | 4.013 | 1.519 |
| 2011-03-12 | 1.162 | 1.562 | 2.453 | 2.618 | 4.013 | 1.519 |
| 2011-03-13 | 1.167 | 1.583 | 2.463 | 2.597 | 4.069 | 1.538 |
| 2011-03-14 | 1.159 | 1.575 | 2.46 | 2.631 | 4.055 | 1.508 |
| 2011-03-15 | 1.214 | 1.667 | 2.608 | 2.743 | 4.254 | 1.599 |
| 2011-03-16 | 1.204 | 1.669 | 2.626 | 2.74 | 4.255 | 1.598 |
| 2011-03-17 | 1.184 | 1.609 | 2.579 | 2.666 | 4.213 | 1.585 |
| 2011-03-18 | 1.184 | 1.609 | 2.579 | 2.666 | 4.213 | 1.585 |
| 2011-03-19 | 1.184 | 1.609 | 2.579 | 2.666 | 4.213 | 1.585 |
| 2011-03-20 | 1.184 | 1.609 | 2.579 | 2.666 | 4.213 | 1.585 |
| 2011-03-21 | 1.155 | 1.562 | 2.544 | 2.637 | 4.091 | 1.602 |
| 2011-03-22 | 1.128 | 1.505 | 2.489 | 2.615 | 4.019 | 1.559 |
| 2011-03-23 | 1.123 | 1.507 | 2.474 | 2.61 | 4.004 | 1.544 |
| 2011-03-24 | 1.074 | 1.474 | 2.421 | 2.569 | 3.948 | 1.479 |
| 2011-03-25 | 1.074 | 1.474 | 2.421 | 2.569 | 3.948 | 1.479 |
| 2011-03-26 | 1.074 | 1.474 | 2.421 | 2.569 | 3.948 | 1.479 |
| 2011-03-27 | 1.036 | 1.445 | 2.377 | 2.547 | 3.882 | 1.435 |
| 2011-03-28 | 1.022 | 1.42 | 2.349 | 2.5 | 3.854 | 1.413 |
| 2011-03-29 | 0.978 | 1.336 | 2.262 | 2.43 | 3.766 | 1.353 |
| 2011-03-30 | 0.983 | 1.336 | 2.23 | 2.371 | 3.722 | 1.326 |
| 2011-03-31 | 0.949 | 1.327 | 2.277 | 2.318 | 3.709 | 1.344 |
| 2011-04-01 | 0.949 | 1.327 | 2.277 | 2.318 | 3.709 | 1.344 |
| 2011-04-02 | 0.949 | 1.327 | 2.277 | 2.318 | 3.709 | 1.344 |
| 2011-04-03 | 0.974 | 1.342 | 2.295 | 2.343 | 3.713 | 1.352 |
| 2011-04-04 | 1.063 | 1.485 | 2.359 | 2.431 | 3.787 | 1.4 |
| 2011-04-05 | 1.089 | 1.503 | 2.402 | 2.468 | 3.806 | 1.434 |
| 2011-04-06 | 1.105 | 1.473 | 2.395 | 2.474 | 3.774 | 1.447 |
| 2011-04-07 | 1.137 | 1.531 | 2.401 | 2.515 | 3.786 | 1.433 |
| 2011-04-08 | 1.137 | 1.531 | 2.401 | 2.515 | 3.786 | 1.433 |
| 2011-04-09 | 1.137 | 1.531 | 2.401 | 2.515 | 3.786 | 1.433 |
| 2011-04-10 | 1.101 | 1.547 | 2.388 | 2.511 | 3.767 | 1.389 |
| 2011-04-11 | 1.093 | 1.555 | 2.373 | 2.468 | 3.766 | 1.379 |
| 2011-04-12 | 1.112 | 1.56 | 2.384 | 2.476 | 3.78 | 1.422 |
| 2011-04-13 | 1.113 | 1.53 | 2.386 | 2.46 | 3.753 | 1.445 |
| 2011-04-14 | 1.177 | 1.606 | 2.446 | 2.569 | 3.829 | 1.481 |
| 2011-04-15 | 1.177 | 1.606 | 2.446 | 2.569 | 3.829 | 1.481 |
| 2011-04-16 | 1.177 | 1.606 | 2.446 | 2.569 | 3.829 | 1.481 |
| 2011-04-17 | 1.211 | 1.672 | 2.492 | 2.606 | 3.881 | 1.547 |
| 2011-04-18 | 1.211 | 1.672 | 2.492 | 2.606 | 3.881 | 1.547 |
| 2011-04-19 | 1.211 | 1.672 | 2.492 | 2.606 | 3.881 | 1.547 |
| 2011-04-20 | 1.218 | 1.681 | 2.482 | 2.596 | 3.887 | 1.542 |
| 2011-04-21 | 1.232 | 1.692 | 2.502 | 2.624 | 3.89 | 1.542 |
| 2011-04-22 | 1.232 | 1.692 | 2.502 | 2.624 | 3.89 | 1.542 |
| 2011-04-23 | 1.232 | 1.692 | 2.502 | 2.624 | 3.89 | 1.542 |
| 2011-04-24 | 1.232 | 1.692 | 2.502 | 2.624 | 3.89 | 1.542 |
| 2011-04-25 | 1.232 | 1.692 | 2.502 | 2.624 | 3.89 | 1.542 |
| 2011-04-26 | 1.234 | 1.667 | 2.579 | 2.629 | 3.939 | 1.582 |
| 2011-04-27 | 1.192 | 1.627 | 2.601 | 2.693 | 3.922 | 1.516 |
| 2011-04-28 | 1.182 | 1.659 | 2.622 | 2.713 | 3.942 | 1.515 |
| 2011-04-29 | 1.182 | 1.659 | 2.622 | 2.713 | 3.942 | 1.515 |
| 2011-04-30 | 1.182 | 1.659 | 2.622 | 2.713 | 3.942 | 1.515 |
| 2011-05-01 | 1.23 | 1.699 | 2.72 | 2.786 | 4.011 | 1.56 |
| 2011-05-02 | 1.193 | 1.673 | 2.712 | 2.698 | 3.973 | 1.509 |
| 2011-05-03 | 1.169 | 1.666 | 2.7 | 2.693 | 3.982 | 1.477 |
| 2011-05-04 | 1.115 | 1.587 | 2.641 | 2.642 | 3.924 | 1.413 |
| 2011-05-05 | 1.131 | 1.587 | 2.612 | 2.654 | 3.952 | 1.445 |
| 2011-05-06 | 1.131 | 1.587 | 2.612 | 2.654 | 3.952 | 1.445 |
| 2011-05-07 | 1.131 | 1.587 | 2.612 | 2.654 | 3.952 | 1.445 |
| 2011-05-08 | 1.127 | 1.578 | 2.611 | 2.63 | 4.016 | 1.447 |
| 2011-05-09 | 1.127 | 1.578 | 2.611 | 2.63 | 4.016 | 1.447 |
| 2011-05-10 | 1.127 | 1.578 | 2.611 | 2.63 | 4.016 | 1.447 |
| 2011-05-11 | 1.1 | 1.585 | 2.618 | 2.618 | 4.023 | 1.384 |
| 2011-05-12 | 1.114 | 1.6 | 2.65 | 2.648 | 4.084 | 1.411 |
| 2011-05-13 | 1.114 | 1.6 | 2.65 | 2.648 | 4.084 | 1.411 |
| 2011-05-14 | 1.114 | 1.6 | 2.65 | 2.648 | 4.084 | 1.411 |
| 2011-05-15 | 1.146 | 1.692 | 2.709 | 2.691 | 4.165 | 1.424 |
| 2011-05-16 | 1.164 | 1.678 | 2.654 | 2.692 | 4.192 | 1.474 |
| 2011-05-17 | 1.174 | 1.683 | 2.631 | 2.703 | 4.182 | 1.479 |
| 2011-05-18 | 1.2 | 1.719 | 2.672 | 2.737 | 4.141 | 1.478 |
| 2011-05-19 | 1.169 | 1.722 | 2.615 | 2.772 | 4.113 | 1.457 |
| 2011-05-20 | 1.169 | 1.722 | 2.615 | 2.772 | 4.113 | 1.457 |
| 2011-05-21 | 1.169 | 1.722 | 2.615 | 2.772 | 4.113 | 1.457 |
| 2011-05-22 | 1.202 | 1.783 | 2.709 | 2.964 | 4.246 | 1.473 |
| 2011-05-23 | 1.214 | 1.835 | 2.726 | 3.238 | 4.468 | 1.491 |
| 2011-05-24 | 1.231 | 1.889 | 2.899 | 3.518 | 4.74 | 1.564 |
| 2011-05-25 | 1.253 | 1.988 | 2.964 | 3.739 | 4.832 | 1.607 |
| 2011-05-26 | 1.255 | 1.986 | 2.875 | 3.629 | 4.708 | 1.562 |
| 2011-05-27 | 1.255 | 1.986 | 2.875 | 3.629 | 4.708 | 1.562 |
| 2011-05-28 | 1.255 | 1.986 | 2.875 | 3.629 | 4.708 | 1.562 |
| 2011-05-29 | 1.23 | 1.946 | 2.837 | 3.625 | 4.644 | 1.502 |
| 2011-05-30 | 1.22 | 1.933 | 2.854 | 3.753 | 4.627 | 1.509 |
| 2011-05-31 | 1.188 | 1.875 | 2.844 | 3.757 | 4.377 | 1.49 |
| 2011-06-01 | 1.205 | 1.847 | 2.832 | 3.717 | 4.313 | 1.574 |
| 2011-06-02 | 1.156 | 1.835 | 2.837 | 3.787 | 4.362 | 1.587 |
| 2011-06-03 | 1.156 | 1.835 | 2.837 | 3.787 | 4.362 | 1.587 |
| 2011-06-04 | 1.156 | 1.835 | 2.837 | 3.787 | 4.362 | 1.587 |
| 2011-06-05 | 1.14 | 1.844 | 2.849 | 3.812 | 4.402 | 1.566 |
| 2011-06-06 | 1.149 | 1.854 | 2.903 | 3.783 | 4.416 | 1.527 |
| 2011-06-07 | 1.149 | 1.854 | 2.903 | 3.783 | 4.416 | 1.527 |
| 2011-06-08 | 1.149 | 1.854 | 2.903 | 3.783 | 4.416 | 1.527 |
| 2011-06-09 | 1.172 | 1.919 | 2.957 | 3.841 | 4.567 | 1.575 |
| 2011-06-10 | 1.172 | 1.919 | 2.957 | 3.841 | 4.567 | 1.575 |
| 2011-06-11 | 1.172 | 1.919 | 2.957 | 3.841 | 4.567 | 1.575 |
| 2011-06-12 | 1.186 | 1.994 | 3.065 | 3.919 | 4.727 | 1.611 |
| 2011-06-13 | 1.186 | 2.059 | 3.289 | 3.993 | 4.84 | 1.653 |
| 2011-06-14 | 1.154 | 2.013 | 3.169 | 3.922 | 4.779 | 1.602 |
| 2011-06-15 | 1.153 | 2.065 | 3.175 | 3.925 | 4.795 | 1.585 |
| 2011-06-16 | 1.161 | 2.084 | 3.219 | 3.995 | 4.898 | 1.587 |
| 2011-06-17 | 1.161 | 2.084 | 3.219 | 3.995 | 4.898 | 1.587 |
| 2011-06-18 | 1.161 | 2.084 | 3.219 | 3.995 | 4.898 | 1.587 |
| 2011-06-19 | 1.173 | 2.086 | 3.224 | 4.023 | 4.865 | 1.582 |
| 2011-06-20 | 1.183 | 2.105 | 3.351 | 4.143 | 4.979 | 1.617 |
| 2011-06-21 | 1.182 | 2.046 | 3.323 | 4.087 | 4.926 | 1.633 |
| 2011-06-22 | 1.155 | 1.999 | 3.188 | 3.998 | 4.813 | 1.596 |
| 2011-06-23 | 1.163 | 1.985 | 3.223 | 4.065 | 4.858 | 1.602 |
| 2011-06-24 | 1.163 | 1.985 | 3.223 | 4.065 | 4.858 | 1.602 |
| 2011-06-25 | 1.163 | 1.985 | 3.223 | 4.065 | 4.858 | 1.602 |
| 2011-06-26 | 1.195 | 2.051 | 3.314 | 4.134 | 4.95 | 1.681 |
| 2011-06-27 | 1.194 | 2.062 | 3.325 | 4.161 | 4.974 | 1.697 |
| 2011-06-28 | 1.194 | 2.039 | 3.211 | 4.144 | 4.951 | 1.714 |
| 2011-06-29 | 1.188 | 2.027 | 3.189 | 4.081 | 4.889 | 1.678 |
| 2011-06-30 | 1.209 | 2.017 | 3.179 | 4.056 | 4.828 | 1.688 |
| 2011-07-01 | 1.209 | 2.017 | 3.179 | 4.056 | 4.828 | 1.688 |
| 2011-07-02 | 1.209 | 2.017 | 3.179 | 4.056 | 4.828 | 1.688 |
| 2011-07-03 | 1.14 | 1.915 | 3.06 | 3.868 | 4.655 | 1.628 |
| 2011-07-04 | 1.141 | 1.898 | 3.072 | 3.888 | 4.627 | 1.639 |
| 2011-07-05 | 1.156 | 1.889 | 3.042 | 3.873 | 4.648 | 1.625 |
| 2011-07-06 | 1.148 | 1.926 | 3.166 | 3.905 | 4.706 | 1.598 |
| 2011-07-07 | 1.16 | 1.901 | 3.18 | 3.891 | 4.685 | 1.61 |
| 2011-07-08 | 1.16 | 1.901 | 3.18 | 3.891 | 4.685 | 1.61 |
| 2011-07-09 | 1.16 | 1.901 | 3.18 | 3.891 | 4.685 | 1.61 |
| 2011-07-10 | 1.16 | 1.888 | 3.139 | 3.913 | 4.712 | 1.61 |
| 2011-07-11 | 1.165 | 1.902 | 3.165 | 4.002 | 4.822 | 1.573 |
| 2011-07-12 | 1.162 | 1.911 | 3.195 | 4.066 | 4.875 | 1.567 |
| 2011-07-13 | 1.177 | 1.97 | 3.218 | 4.16 | 4.907 | 1.581 |
| 2011-07-14 | 1.145 | 2.004 | 3.266 | 4.296 | 4.942 | 1.585 |
| 2011-07-15 | 1.145 | 2.004 | 3.266 | 4.296 | 4.942 | 1.585 |
| 2011-07-16 | 1.145 | 2.004 | 3.266 | 4.296 | 4.942 | 1.585 |
| 2011-07-17 | 1.146 | 2.052 | 3.308 | 4.411 | 5.053 | 1.615 |
| 2011-07-18 | 1.194 | 2.151 | 3.372 | 4.593 | 5.15 | 1.639 |
| 2011-07-19 | 1.167 | 2.107 | 3.374 | 4.534 | 5.133 | 1.618 |
| 2011-07-20 | 1.161 | 2.087 | 3.379 | 4.471 | 5.091 | 1.577 |
| 2011-07-21 | 1.173 | 2.117 | 3.465 | 4.497 | 5.096 | 1.614 |
| 2011-07-22 | 1.173 | 2.117 | 3.465 | 4.497 | 5.096 | 1.614 |
| 2011-07-23 | 1.173 | 2.117 | 3.465 | 4.497 | 5.096 | 1.614 |
| 2011-07-24 | 1.148 | 2.097 | 3.437 | 4.492 | 5.063 | 1.594 |
| 2011-07-25 | 1.17 | 2.151 | 3.399 | 4.519 | 5.125 | 1.62 |
| 2011-07-26 | 1.168 | 2.152 | 3.422 | 4.528 | 5.158 | 1.599 |
| 2011-07-27 | 1.203 | 2.163 | 3.442 | 4.592 | 5.176 | 1.67 |
| 2011-07-28 | 1.198 | 2.179 | 3.437 | 4.648 | 5.285 | 1.658 |
| 2011-07-29 | 1.198 | 2.179 | 3.437 | 4.648 | 5.285 | 1.658 |
| 2011-07-30 | 1.198 | 2.179 | 3.437 | 4.648 | 5.285 | 1.658 |
| 2011-07-31 | 1.153 | 2.188 | 3.367 | 4.761 | 5.37 | 1.53 |
| 2011-08-01 | 1.154 | 2.185 | 3.37 | 4.804 | 5.363 | 1.517 |
| 2011-08-02 | 1.152 | 2.203 | 3.364 | 4.887 | 5.439 | 1.529 |
| 2011-08-03 | 1.215 | 2.268 | 3.517 | 5.064 | 5.586 | 1.572 |
| 2011-08-04 | 1.227 | 2.315 | 3.612 | 5.121 | 5.662 | 1.614 |
| 2011-08-05 | 1.227 | 2.315 | 3.612 | 5.121 | 5.662 | 1.614 |
| 2011-08-06 | 1.227 | 2.315 | 3.612 | 5.121 | 5.662 | 1.614 |
| 2011-08-07 | 1.548 | 3.064 | 4.514 | 6.558 | 7.048 | 2.138 |
| 2011-08-08 | 1.48 | 2.998 | 4.358 | 6.574 | 6.872 | 2.113 |
| 2011-08-09 | 1.48 | 2.998 | 4.358 | 6.574 | 6.872 | 2.113 |
| 2011-08-10 | 1.662 | 3.37 | 4.53 | 7.834 | 7.472 | 2.418 |
| 2011-08-11 | 1.745 | 3.836 | 5.053 | 9.027 | 8.218 | 2.605 |
| 2011-08-12 | 1.745 | 3.836 | 5.053 | 9.027 | 8.218 | 2.605 |
| 2011-08-13 | 1.745 | 3.836 | 5.053 | 9.027 | 8.218 | 2.605 |
| 2011-08-14 | 1.534 | 3.377 | 4.536 | 7.729 | 7.239 | 2.412 |
| 2011-08-15 | 1.445 | 3.175 | 4.316 | 7.057 | 6.808 | 2.309 |
| 2011-08-16 | 1.454 | 3.144 | 4.263 | 7.084 | 6.738 | 2.302 |
| 2011-08-17 | 1.381 | 2.988 | 4.117 | 6.808 | 6.537 | 2.152 |
| 2011-08-18 | 1.461 | 3.119 | 4.203 | 7.11 | 6.616 | 2.128 |
| 2011-08-19 | 1.461 | 3.119 | 4.203 | 7.11 | 6.616 | 2.128 |
| 2011-08-20 | 1.461 | 3.119 | 4.203 | 7.11 | 6.616 | 2.128 |
| 2011-08-21 | 1.501 | 3.139 | 4.344 | 7.478 | 6.656 | 2.131 |
| 2011-08-22 | 1.385 | 2.884 | 4.132 | 7.119 | 6.413 | 1.978 |
| 2011-08-23 | 1.41 | 2.908 | 4.155 | 7.132 | 6.474 | 2.039 |
| 2011-08-24 | 1.388 | 2.929 | 4.233 | 7.115 | 6.488 | 2.003 |
| 2011-08-25 | 1.463 | 2.982 | 4.318 | 7.393 | 6.632 | 2.129 |
| 2011-08-26 | 1.463 | 2.982 | 4.318 | 7.393 | 6.632 | 2.129 |
| 2011-08-27 | 1.463 | 2.982 | 4.318 | 7.393 | 6.632 | 2.129 |
| 2011-08-28 | 1.421 | 2.974 | 4.119 | 7.458 | 6.54 | 2.065 |
| 2011-08-29 | 1.394 | 2.929 | 4.033 | 7.475 | 6.482 | 2.1 |
| 2011-08-30 | 1.437 | 2.848 | 3.899 | 7.169 | 6.453 | 2.102 |
| 2011-08-31 | 1.374 | 2.692 | 3.694 | 6.976 | 6.22 | 2.116 |
| 2011-09-01 | 1.358 | 2.724 | 3.673 | 6.845 | 6.239 | 2.089 |
| 2011-09-02 | 1.358 | 2.724 | 3.673 | 6.845 | 6.239 | 2.089 |
| 2011-09-03 | 1.358 | 2.724 | 3.673 | 6.845 | 6.239 | 2.089 |
| 2011-09-04 | 1.423 | 2.871 | 3.847 | 7.117 | 6.441 | 2.137 |
| 2011-09-05 | 1.46 | 3.005 | 3.975 | 7.43 | 6.594 | 2.134 |
| 2011-09-06 | 1.465 | 3.165 | 4.141 | 7.859 | 6.87 | 2.162 |
| 2011-09-07 | 1.519 | 3.278 | 4.214 | 8.203 | 6.939 | 2.198 |
| 2011-09-08 | 1.558 | 3.418 | 4.387 | 8.614 | 7.023 | 2.247 |
| 2011-09-09 | 1.558 | 3.418 | 4.387 | 8.614 | 7.023 | 2.247 |
| 2011-09-10 | 1.558 | 3.418 | 4.387 | 8.614 | 7.023 | 2.247 |
| 2011-09-11 | 1.583 | 3.651 | 4.613 | 9.246 | 7.419 | 2.299 |
| 2011-09-12 | 1.698 | 3.92 | 4.981 | 9.89 | 7.764 | 2.376 |
| 2011-09-13 | 1.604 | 3.761 | 4.838 | 9.472 | 7.54 | 2.38 |
| 2011-09-14 | 1.529 | 3.584 | 4.614 | 8.917 | 7.359 | 2.374 |
| 2011-09-15 | 1.466 | 3.405 | 4.339 | 8.082 | 7.098 | 2.308 |
| 2011-09-16 | 1.466 | 3.405 | 4.339 | 8.082 | 7.098 | 2.308 |
| 2011-09-17 | 1.466 | 3.405 | 4.339 | 8.082 | 7.098 | 2.308 |
| 2011-09-18 | 1.495 | 3.319 | 4.317 | 7.826 | 7.067 | 2.345 |
| 2011-09-19 | 1.558 | 3.477 | 4.403 | 8.223 | 7.151 | 2.38 |
| 2011-09-20 | 1.537 | 3.326 | 4.277 | 8.122 | 7.069 | 2.422 |
| 2011-09-21 | 1.523 | 3.281 | 4.244 | 8.091 | 6.917 | 2.455 |
| 2011-09-22 | 1.602 | 3.342 | 4.397 | 8.342 | 6.945 | 2.43 |
| 2011-09-23 | 1.602 | 3.342 | 4.397 | 8.342 | 6.945 | 2.43 |
| 2011-09-24 | 1.602 | 3.342 | 4.397 | 8.342 | 6.945 | 2.43 |
| 2011-09-25 | 1.5 | 3.261 | 4.339 | 8.241 | 6.868 | 2.421 |
| 2011-09-26 | 1.499 | 3.265 | 4.324 | 8.077 | 6.931 | 2.39 |
| 2011-09-27 | 1.461 | 3.212 | 4.287 | 7.819 | 6.812 | 2.389 |
| 2011-09-28 | 1.461 | 3.212 | 4.287 | 7.819 | 6.812 | 2.389 |
| 2011-09-29 | 1.461 | 3.212 | 4.287 | 7.819 | 6.812 | 2.389 |
| 2011-09-30 | 1.461 | 3.212 | 4.287 | 7.819 | 6.812 | 2.389 |
| 2011-10-01 | 1.461 | 3.212 | 4.287 | 7.819 | 6.812 | 2.389 |
| 2011-10-02 | 1.47 | 3.302 | 4.408 | 8.029 | 6.882 | 2.436 |
| 2011-10-03 | 1.522 | 3.27 | 4.386 | 8.096 | 6.827 | 2.488 |
| 2011-10-04 | 1.593 | 3.349 | 4.5 | 8.473 | 7.003 | 2.488 |
| 2011-10-05 | 1.546 | 3.317 | 4.474 | 8.324 | 6.931 | 2.475 |
| 2011-10-06 | 1.568 | 3.332 | 4.368 | 8.441 | 7.018 | 2.495 |
| 2011-10-07 | 1.568 | 3.332 | 4.368 | 8.441 | 7.018 | 2.495 |
| 2011-10-08 | 1.568 | 3.332 | 4.368 | 8.441 | 7.018 | 2.495 |
| 2011-10-09 | 1.57 | 3.385 | 4.458 | 8.605 | 7.053 | 2.523 |
| 2011-10-10 | 1.505 | 3.305 | 4.385 | 8.32 | 6.924 | 2.372 |
| 2011-10-11 | 1.428 | 3.226 | 4.342 | 8.074 | 6.724 | 2.272 |
| 2011-10-12 | 1.428 | 3.226 | 4.342 | 8.074 | 6.724 | 2.272 |
| 2011-10-13 | 1.428 | 3.226 | 4.342 | 8.074 | 6.724 | 2.272 |
| 2011-10-14 | 1.428 | 3.226 | 4.342 | 8.074 | 6.724 | 2.272 |
| 2011-10-15 | 1.428 | 3.226 | 4.342 | 8.074 | 6.724 | 2.272 |
| 2011-10-16 | 1.375 | 3.044 | 4.136 | 7.538 | 6.472 | 2.191 |
| 2011-10-17 | 1.338 | 2.974 | 4.038 | 7.379 | 6.414 | 2.207 |
| 2011-10-18 | 1.332 | 2.954 | 4.019 | 7.243 | 6.408 | 2.203 |
| 2011-10-19 | 1.332 | 2.954 | 4.019 | 7.243 | 6.408 | 2.203 |
| 2011-10-20 | 1.332 | 2.954 | 4.019 | 7.243 | 6.408 | 2.203 |
| 2011-10-21 | 1.332 | 2.954 | 4.019 | 7.243 | 6.408 | 2.203 |
| 2011-10-22 | 1.332 | 2.954 | 4.019 | 7.243 | 6.408 | 2.203 |
| 2011-10-23 | 1.326 | 2.926 | 3.937 | 7.117 | 6.397 | 2.154 |
| 2011-10-24 | 1.353 | 2.972 | 3.942 | 7.065 | 6.447 | 2.147 |
| 2011-10-25 | 1.36 | 2.943 | 3.912 | 6.889 | 6.405 | 2.15 |
| 2011-10-26 | 1.335 | 2.88 | 3.785 | 6.762 | 6.284 | 2.129 |
| 2011-10-27 | 1.28 | 2.777 | 3.577 | 6.529 | 6.102 | 2.044 |
| 2011-10-28 | 1.28 | 2.777 | 3.577 | 6.529 | 6.102 | 2.044 |
| 2011-10-29 | 1.28 | 2.777 | 3.577 | 6.529 | 6.102 | 2.044 |
| 2011-10-30 | 1.387 | 2.819 | 3.604 | 6.569 | 6.168 | 2.067 |
| 2011-10-31 | 1.458 | 2.89 | 3.682 | 6.722 | 6.227 | 2.145 |
| 2011-11-01 | 1.482 | 2.999 | 3.858 | 7.101 | 6.457 | 2.191 |
| 2011-11-02 | 1.45 | 2.943 | 3.786 | 6.988 | 6.221 | 2.149 |
| 2011-11-03 | 1.459 | 2.912 | 3.759 | 6.968 | 6.205 | 2.184 |
| 2011-11-04 | 1.459 | 2.912 | 3.759 | 6.968 | 6.205 | 2.184 |
| 2011-11-05 | 1.459 | 2.912 | 3.759 | 6.968 | 6.205 | 2.184 |
| 2011-11-06 | 1.491 | 2.974 | 3.905 | 7.135 | 6.3 | 2.201 |
| 2011-11-07 | 1.509 | 3.002 | 3.903 | 7.255 | 6.346 | 2.239 |
| 2011-11-08 | 1.431 | 2.897 | 3.822 | 7.071 | 6.264 | 2.153 |
| 2011-11-09 | 1.443 | 3.008 | 3.895 | 7.193 | 6.353 | 2.125 |
| 2011-11-10 | 1.456 | 3.132 | 3.946 | 7.386 | 6.329 | 2.174 |
| 2011-11-11 | 1.456 | 3.132 | 3.946 | 7.386 | 6.329 | 2.174 |
| 2011-11-12 | 1.456 | 3.132 | 3.946 | 7.386 | 6.329 | 2.174 |
| 2011-11-13 | 1.517 | 3.101 | 3.888 | 7.416 | 6.324 | 2.148 |
| 2011-11-14 | 1.46 | 3.105 | 3.914 | 7.481 | 6.37 | 2.163 |
| 2011-11-15 | 1.47 | 3.153 | 3.957 | 7.543 | 6.448 | 2.187 |
| 2011-11-16 | 1.509 | 3.265 | 4.087 | 7.691 | 6.523 | 2.209 |
| 2011-11-17 | 1.492 | 3.356 | 4.064 | 7.827 | 6.565 | 2.237 |
| 2011-11-18 | 1.492 | 3.356 | 4.064 | 7.827 | 6.565 | 2.237 |
| 2011-11-19 | 1.492 | 3.356 | 4.064 | 7.827 | 6.565 | 2.237 |
| 2011-11-20 | 1.494 | 3.427 | 4.146 | 8.069 | 6.609 | 2.245 |
| 2011-11-21 | 1.505 | 3.523 | 4.232 | 8.383 | 6.763 | 2.278 |
| 2011-11-22 | 1.499 | 3.584 | 4.279 | 8.595 | 6.847 | 2.325 |
| 2011-11-23 | 1.521 | 3.609 | 4.355 | 8.928 | 6.947 | 2.366 |
| 2011-11-24 | 1.573 | 3.834 | 4.542 | 9.254 | 7.182 | 2.342 |
| 2011-11-25 | 1.573 | 3.834 | 4.542 | 9.254 | 7.182 | 2.342 |
| 2011-11-26 | 1.573 | 3.834 | 4.542 | 9.254 | 7.182 | 2.342 |
| 2011-11-27 | 1.63 | 4.043 | 4.779 | 9.727 | 7.609 | 2.457 |
| 2011-11-28 | 1.599 | 3.954 | 4.706 | 9.617 | 7.454 | 2.473 |
| 2011-11-29 | 1.572 | 4.08 | 4.738 | 9.927 | 7.564 | 2.515 |
| 2011-11-30 | 1.555 | 4.003 | 4.773 | 9.761 | 7.156 | 2.505 |
| 2011-12-01 | 1.577 | 3.959 | 4.876 | 9.874 | 7.079 | 2.514 |
| 2011-12-02 | 1.577 | 3.959 | 4.876 | 9.874 | 7.079 | 2.514 |
| 2011-12-03 | 1.577 | 3.959 | 4.876 | 9.874 | 7.079 | 2.514 |
| 2011-12-04 | 1.516 | 3.944 | 4.887 | 10.164 | 7.085 | 2.542 |
| 2011-12-05 | 1.507 | 3.889 | 4.909 | 10.233 | 7.082 | 2.515 |
| 2011-12-06 | 1.522 | 3.87 | 4.904 | 9.976 | 7.108 | 2.519 |
| 2011-12-07 | 1.515 | 3.786 | 4.84 | 9.693 | 7.083 | 2.523 |
| 2011-12-08 | 1.517 | 3.765 | 4.818 | 9.478 | 7.059 | 2.512 |
| 2011-12-09 | 1.517 | 3.765 | 4.818 | 9.478 | 7.059 | 2.512 |
| 2011-12-10 | 1.517 | 3.765 | 4.818 | 9.478 | 7.059 | 2.512 |
| 2011-12-11 | 1.511 | 3.792 | 4.739 | 9.594 | 7.052 | 2.476 |
| 2011-12-12 | 1.504 | 3.825 | 4.734 | 9.742 | 7.1 | 2.476 |
| 2011-12-13 | 1.499 | 3.899 | 4.826 | 9.886 | 7.151 | 2.479 |
| 2011-12-14 | 1.527 | 4.002 | 4.896 | 10.273 | 7.292 | 2.467 |
| 2011-12-15 | 1.521 | 3.997 | 5.012 | 10.371 | 7.33 | 2.471 |
| 2011-12-16 | 1.521 | 3.997 | 5.012 | 10.371 | 7.33 | 2.471 |
| 2011-12-17 | 1.521 | 3.997 | 5.012 | 10.371 | 7.33 | 2.471 |
| 2011-12-18 | 1.469 | 3.997 | 4.996 | 10.412 | 7.36 | 2.422 |
| 2011-12-19 | 1.473 | 3.977 | 4.935 | 10.599 | 7.346 | 2.421 |
| 2011-12-20 | 1.471 | 4.058 | 4.952 | 10.747 | 7.449 | 2.37 |
| 2011-12-21 | 1.497 | 4.154 | 5.073 | 10.835 | 7.534 | 2.389 |
| 2011-12-22 | 1.507 | 4.163 | 5.169 | 10.909 | 7.615 | 2.389 |
| 2011-12-23 | 1.507 | 4.163 | 5.169 | 10.909 | 7.615 | 2.389 |
| 2011-12-24 | 1.507 | 4.163 | 5.169 | 10.909 | 7.615 | 2.389 |
| 2011-12-25 | 1.49 | 4.142 | 5.105 | 10.238 | 7.437 | 2.355 |
| 2011-12-26 | 1.49 | 4.102 | 5.075 | 10.179 | 7.382 | 2.343 |
| 2011-12-27 | 1.474 | 4.017 | 4.972 | 10.005 | 7.254 | 2.337 |
| 2011-12-28 | 1.455 | 3.968 | 4.901 | 9.853 | 7.163 | 2.296 |
| 2011-12-29 | 1.433 | 3.945 | 4.862 | 9.933 | 7.176 | 2.342 |
| 2011-12-30 | 1.433 | 3.945 | 4.862 | 9.933 | 7.176 | 2.342 |
| 2011-12-31 | 1.433 | 3.945 | 4.862 | 9.933 | 7.176 | 2.342 |
| 2012-01-01 | 1.429 | 3.737 | 4.725 | 9.655 | 6.8 | 2.296 |
| 2012-01-02 | 1.385 | 3.563 | 4.517 | 9.236 | 6.562 | 2.235 |
| 2012-01-03 | 1.36 | 3.465 | 4.406 | 9.234 | 6.369 | 2.246 |
| 2012-01-04 | 1.346 | 3.473 | 4.407 | 9.081 | 6.291 | 2.236 |
| 2012-01-05 | 1.37 | 3.472 | 4.385 | 9.014 | 6.302 | 2.225 |
| 2012-01-06 | 1.37 | 3.472 | 4.385 | 9.014 | 6.302 | 2.225 |
| 2012-01-07 | 1.37 | 3.472 | 4.385 | 9.014 | 6.302 | 2.225 |
| 2012-01-08 | 1.386 | 3.492 | 4.375 | 9.078 | 6.293 | 2.265 |
| 2012-01-09 | 1.39 | 3.555 | 4.396 | 9.134 | 6.332 | 2.271 |
| 2012-01-10 | 1.328 | 3.497 | 4.348 | 9.02 | 6.241 | 2.208 |
| 2012-01-11 | 1.332 | 3.507 | 4.371 | 8.823 | 6.173 | 2.229 |
| 2012-01-12 | 1.35 | 3.545 | 4.326 | 8.702 | 6.116 | 2.211 |
| 2012-01-13 | 1.35 | 3.545 | 4.326 | 8.702 | 6.116 | 2.211 |
| 2012-01-14 | 1.35 | 3.545 | 4.326 | 8.702 | 6.116 | 2.211 |
| 2012-01-15 | 1.341 | 3.578 | 4.31 | 8.83 | 6.132 | 2.186 |
| 2012-01-16 | 1.279 | 3.427 | 4.18 | 8.728 | 6.044 | 2.159 |
| 2012-01-17 | 1.263 | 3.387 | 4.139 | 8.653 | 5.996 | 2.113 |
| 2012-01-18 | 1.291 | 3.399 | 4.148 | 8.741 | 5.987 | 2.132 |
| 2012-01-19 | 1.335 | 3.538 | 4.198 | 8.32 | 5.974 | 2.113 |
| 2012-01-20 | 1.335 | 3.538 | 4.198 | 8.32 | 5.974 | 2.113 |
| 2012-01-21 | 1.335 | 3.538 | 4.198 | 8.32 | 5.974 | 2.113 |
| 2012-01-22 | 1.37 | 3.571 | 4.255 | 8.341 | 6.003 | 2.149 |
| 2012-01-23 | 1.341 | 3.587 | 4.284 | 8.302 | 5.99 | 2.118 |
| 2012-01-24 | 1.373 | 3.632 | 4.38 | 8.499 | 6.122 | 2.14 |
| 2012-01-25 | 1.385 | 3.81 | 4.402 | 8.585 | 6.192 | 2.133 |
| 2012-01-26 | 1.374 | 3.797 | 4.4 | 8.577 | 6.184 | 2.14 |
| 2012-01-27 | 1.374 | 3.797 | 4.4 | 8.577 | 6.184 | 2.14 |
| 2012-01-28 | 1.374 | 3.797 | 4.4 | 8.577 | 6.184 | 2.14 |
| 2012-01-29 | 1.426 | 3.896 | 4.458 | 8.482 | 6.297 | 2.157 |
| 2012-01-30 | 1.464 | 3.991 | 4.55 | 8.677 | 6.372 | 2.174 |
| 2012-01-31 | 1.415 | 3.85 | 4.44 | 8.489 | 6.238 | 2.175 |
| 2012-02-01 | 1.38 | 3.848 | 4.324 | 8.338 | 6.179 | 2.143 |
| 2012-02-02 | 1.386 | 3.798 | 4.313 | 8.44 | 6.169 | 2.141 |
| 2012-02-03 | 1.386 | 3.798 | 4.313 | 8.44 | 6.169 | 2.141 |
| 2012-02-04 | 1.386 | 3.798 | 4.313 | 8.44 | 6.169 | 2.141 |
| 2012-02-05 | 1.381 | 3.744 | 4.276 | 8.321 | 6.164 | 2.075 |
| 2012-02-06 | 1.371 | 3.677 | 4.229 | 8.295 | 6.185 | 2.072 |
| 2012-02-07 | 1.422 | 3.743 | 4.307 | 8.5 | 6.294 | 2.1 |
| 2012-02-08 | 1.422 | 3.743 | 4.307 | 8.5 | 6.294 | 2.1 |
| 2012-02-09 | 1.422 | 3.743 | 4.307 | 8.5 | 6.294 | 2.1 |
| 2012-02-10 | 1.422 | 3.743 | 4.307 | 8.5 | 6.294 | 2.1 |
| 2012-02-11 | 1.422 | 3.743 | 4.307 | 8.5 | 6.294 | 2.1 |
| 2012-02-12 | 1.405 | 3.802 | 4.42 | 8.577 | 6.349 | 2.097 |
| 2012-02-13 | 1.399 | 3.824 | 4.467 | 8.616 | 6.361 | 2.098 |
| 2012-02-14 | 1.387 | 3.64 | 4.41 | 8.581 | 6.302 | 2.103 |
| 2012-02-15 | 1.407 | 3.782 | 4.396 | 8.647 | 6.284 | 2.086 |
| 2012-02-16 | 1.397 | 3.798 | 4.431 | 8.669 | 6.486 | 2.052 |
| 2012-02-17 | 1.397 | 3.798 | 4.431 | 8.669 | 6.486 | 2.052 |
| 2012-02-18 | 1.397 | 3.798 | 4.431 | 8.669 | 6.486 | 2.052 |
| 2012-02-19 | 1.36 | 3.814 | 4.384 | 8.714 | 6.464 | 1.998 |
| 2012-02-20 | 1.35 | 3.853 | 4.365 | 8.749 | 6.495 | 1.993 |
| 2012-02-21 | 1.318 | 3.806 | 4.336 | 8.608 | 6.467 | 1.947 |
| 2012-02-22 | 1.338 | 3.935 | 4.373 | 8.694 | 6.49 | 1.955 |
| 2012-02-23 | 1.336 | 3.972 | 4.435 | 8.701 | 6.521 | 1.964 |
| 2012-02-24 | 1.336 | 3.972 | 4.435 | 8.701 | 6.521 | 1.964 |
| 2012-02-25 | 1.336 | 3.972 | 4.435 | 8.701 | 6.521 | 1.964 |
| 2012-02-26 | 1.333 | 4.087 | 4.553 | 8.882 | 6.65 | 2.006 |
| 2012-02-27 | 1.362 | 4.155 | 4.562 | 9.108 | 6.657 | 2.025 |
| 2012-02-28 | 1.37 | 4.15 | 4.571 | 9.329 | 6.684 | 2.016 |
| 2012-02-29 | 1.303 | 4.039 | 4.427 | 9.357 | 6.535 | 1.946 |
| 2012-03-01 | 1.279 | 3.978 | 4.349 | 9.359 | 6.423 | 1.901 |
| 2012-03-02 | 1.279 | 3.978 | 4.349 | 9.359 | 6.423 | 1.901 |
| 2012-03-03 | 1.279 | 3.978 | 4.349 | 9.359 | 6.423 | 1.901 |
| 2012-03-04 | 1.246 | 3.759 | 4.307 | 9.067 | 6.335 | 1.897 |
| 2012-03-05 | 1.257 | 3.759 | 4.346 | 9.088 | 6.315 | 1.895 |
| 2012-03-06 | 1.311 | 3.92 | 4.481 | 9.367 | 6.441 | 1.928 |
| 2012-03-07 | 1.325 | 3.97 | 4.493 | 9.023 | 6.473 | 1.941 |
| 2012-03-08 | 1.325 | 3.97 | 4.493 | 9.023 | 6.473 | 1.941 |
| 2012-03-09 | 1.325 | 3.97 | 4.493 | 9.023 | 6.473 | 1.941 |
| 2012-03-10 | 1.325 | 3.97 | 4.493 | 9.023 | 6.473 | 1.941 |
| 2012-03-11 | 1.299 | 4.051 | 4.505 | 9.455 | 6.454 | 1.919 |
| 2012-03-12 | 1.309 | 4.023 | 4.53 | 9.461 | 6.43 | 1.968 |
| 2012-03-13 | 1.289 | 4.019 | 4.474 | 9.359 | 6.37 | 1.973 |
| 2012-03-14 | 1.245 | 3.838 | 4.339 | 9.014 | 6.215 | 1.927 |
| 2012-03-15 | 1.243 | 3.784 | 4.332 | 8.839 | 6.173 | 1.935 |
| 2012-03-16 | 1.243 | 3.784 | 4.332 | 8.839 | 6.173 | 1.935 |
| 2012-03-17 | 1.243 | 3.784 | 4.332 | 8.839 | 6.173 | 1.935 |
| 2012-03-18 | 1.193 | 3.605 | 4.227 | 8.657 | 6.123 | 1.911 |
| 2012-03-19 | 1.189 | 3.588 | 4.222 | 8.633 | 6.105 | 1.889 |
| 2012-03-20 | 1.206 | 3.617 | 4.283 | 8.508 | 6.092 | 1.886 |
| 2012-03-21 | 1.206 | 3.625 | 4.295 | 8.589 | 6.051 | 1.884 |
| 2012-03-22 | 1.24 | 3.653 | 4.339 | 8.646 | 6.09 | 1.927 |
| 2012-03-23 | 1.24 | 3.653 | 4.339 | 8.646 | 6.09 | 1.927 |
| 2012-03-24 | 1.24 | 3.653 | 4.339 | 8.646 | 6.09 | 1.927 |
| 2012-03-25 | 1.22 | 3.632 | 4.282 | 8.592 | 6.068 | 1.944 |
| 2012-03-26 | 1.207 | 3.531 | 4.16 | 8.45 | 6.01 | 1.943 |
| 2012-03-27 | 1.205 | 3.529 | 4.122 | 8.35 | 5.948 | 1.946 |
| 2012-03-28 | 1.214 | 3.578 | 4.214 | 8.322 | 5.951 | 1.947 |
| 2012-03-29 | 1.364 | 3.588 | 4.444 | 8.599 | 5.911 | 1.982 |
| 2012-03-30 | 1.364 | 3.588 | 4.444 | 8.599 | 5.911 | 1.982 |
| 2012-03-31 | 1.364 | 3.588 | 4.444 | 8.599 | 5.911 | 1.982 |
| 2012-04-01 | 1.251 | 3.536 | 4.264 | 8.467 | 5.852 | 1.934 |
| 2012-04-02 | 1.247 | 3.481 | 4.222 | 8.232 | 5.781 | 1.963 |
| 2012-04-03 | 1.219 | 3.366 | 4.107 | 8.145 | 5.675 | 1.921 |
| 2012-04-04 | 1.199 | 3.37 | 4.06 | 8.339 | 5.66 | 1.879 |
| 2012-04-05 | 1.17 | 3.361 | 4.022 | 8.299 | 5.681 | 1.874 |
| 2012-04-06 | 1.17 | 3.361 | 4.022 | 8.299 | 5.681 | 1.874 |
| 2012-04-07 | 1.17 | 3.361 | 4.022 | 8.299 | 5.681 | 1.874 |
| 2012-04-08 | 1.164 | 3.29 | 3.954 | 8.329 | 5.685 | 1.869 |
| 2012-04-09 | 1.175 | 3.339 | 4.046 | 8.434 | 5.699 | 1.871 |
| 2012-04-10 | 1.192 | 3.385 | 4.078 | 8.402 | 5.715 | 1.884 |
| 2012-04-11 | 1.239 | 3.455 | 4.132 | 8.544 | 5.807 | 1.903 |
| 2012-04-12 | 1.239 | 3.455 | 4.132 | 8.544 | 5.807 | 1.903 |
| 2012-04-13 | 1.239 | 3.455 | 4.132 | 8.544 | 5.807 | 1.903 |
| 2012-04-14 | 1.239 | 3.455 | 4.132 | 8.544 | 5.807 | 1.903 |
| 2012-04-15 | 1.201 | 3.432 | 4.154 | 8.575 | 5.833 | 1.89 |
| 2012-04-16 | 1.188 | 3.514 | 4.218 | 8.639 | 5.871 | 1.923 |
| 2012-04-17 | 1.144 | 3.394 | 4.121 | 8.551 | 5.757 | 1.86 |
| 2012-04-18 | 1.168 | 3.409 | 4.113 | 8.456 | 5.617 | 1.867 |
| 2012-04-19 | 1.138 | 3.327 | 4.027 | 8.371 | 5.521 | 1.814 |
| 2012-04-20 | 1.138 | 3.327 | 4.027 | 8.371 | 5.521 | 1.814 |
| 2012-04-21 | 1.138 | 3.327 | 4.027 | 8.371 | 5.521 | 1.814 |
| 2012-04-22 | 1.13 | 3.262 | 3.932 | 8.237 | 5.423 | 1.793 |
| 2012-04-23 | 1.158 | 3.295 | 3.959 | 8.109 | 5.48 | 1.791 |
| 2012-04-24 | 1.123 | 3.229 | 3.923 | 8.025 | 5.419 | 1.765 |
| 2012-04-25 | 1.123 | 3.229 | 3.923 | 8.025 | 5.419 | 1.765 |
| 2012-04-26 | 1.123 | 3.229 | 3.923 | 8.025 | 5.419 | 1.765 |
| 2012-04-27 | 1.123 | 3.229 | 3.923 | 8.025 | 5.419 | 1.765 |
| 2012-04-28 | 1.123 | 3.229 | 3.923 | 8.025 | 5.419 | 1.765 |
| 2012-04-29 | 1.097 | 3.216 | 3.919 | 7.982 | 5.41 | 1.739 |
| 2012-04-30 | 1.144 | 3.259 | 4.02 | 8.184 | 5.459 | 1.751 |
| 2012-05-01 | 1.132 | 3.226 | 3.99 | 8.151 | 5.643 | 1.711 |
| 2012-05-02 | 1.154 | 3.269 | 4.042 | 8.417 | 5.558 | 1.698 |
| 2012-05-03 | 1.139 | 3.241 | 4.031 | 8.573 | 5.566 | 1.712 |
| 2012-05-04 | 1.139 | 3.241 | 4.031 | 8.573 | 5.566 | 1.712 |
| 2012-05-05 | 1.139 | 3.241 | 4.031 | 8.573 | 5.566 | 1.712 |
| 2012-05-06 | 1.193 | 3.298 | 4.372 | 9.258 | 5.761 | 1.758 |
| 2012-05-07 | 1.202 | 3.375 | 4.364 | 9.538 | 5.796 | 1.779 |
| 2012-05-08 | 1.215 | 3.364 | 4.322 | 9.425 | 5.755 | 1.824 |
| 2012-05-09 | 1.269 | 3.482 | 4.395 | 10.196 | 5.857 | 1.863 |
| 2012-05-10 | 1.266 | 3.485 | 4.416 | 9.77 | 5.892 | 1.876 |
| 2012-05-11 | 1.266 | 3.485 | 4.416 | 9.77 | 5.892 | 1.876 |
| 2012-05-12 | 1.266 | 3.485 | 4.416 | 9.77 | 5.892 | 1.876 |
| 2012-05-13 | 1.26 | 3.547 | 4.441 | 9.981 | 6.04 | 1.902 |
| 2012-05-14 | 1.288 | 3.684 | 4.507 | 10.396 | 6.153 | 1.93 |
| 2012-05-15 | 1.253 | 4.16 | 4.577 | 11.228 | 6.389 | 1.923 |
| 2012-05-16 | 1.237 | 4.513 | 4.648 | 11.779 | 6.448 | 1.919 |
| 2012-05-17 | 1.252 | 4.95 | 4.724 | 12.848 | 6.467 | 1.954 |
| 2012-05-18 | 1.252 | 4.95 | 4.724 | 12.848 | 6.467 | 1.954 |
| 2012-05-19 | 1.252 | 4.95 | 4.724 | 12.848 | 6.467 | 1.954 |
| 2012-05-20 | 1.27 | 5.314 | 4.592 | 12.136 | 6.445 | 2.008 |
| 2012-05-21 | 1.197 | 5.054 | 4.376 | 11.315 | 6.162 | 1.964 |
| 2012-05-22 | 1.226 | 5.122 | 4.413 | 11.157 | 6.12 | 1.982 |
| 2012-05-23 | 1.289 | 5.483 | 4.541 | 11.685 | 6.264 | 2.037 |
| 2012-05-24 | 1.332 | 5.521 | 4.606 | 11.642 | 6.289 | 2.107 |
| 2012-05-25 | 1.332 | 5.521 | 4.606 | 11.642 | 6.289 | 2.107 |
| 2012-05-26 | 1.332 | 5.521 | 4.606 | 11.642 | 6.289 | 2.107 |
| 2012-05-27 | 1.332 | 5.521 | 4.606 | 11.642 | 6.289 | 2.107 |
| 2012-05-28 | 1.264 | 5.345 | 4.607 | 11.391 | 6.283 | 2.099 |
| 2012-05-29 | 1.26 | 5.37 | 4.543 | 11.336 | 6.299 | 2.081 |
| 2012-05-30 | 1.325 | 5.552 | 4.632 | 11.729 | 6.487 | 2.059 |
| 2012-05-31 | 1.288 | 5.545 | 4.62 | 11.436 | 6.474 | 1.997 |
| 2012-06-01 | 1.288 | 5.545 | 4.62 | 11.436 | 6.474 | 1.997 |
| 2012-06-02 | 1.288 | 5.545 | 4.62 | 11.436 | 6.474 | 1.997 |
| 2012-06-03 | 1.329 | 4.322 | 4.706 | 11.778 | 6.534 | 2.085 |
| 2012-06-04 | 1.29 | 4.304 | 4.655 | 11.815 | 6.478 | 2.056 |
| 2012-06-05 | 1.318 | 5.372 | 4.659 | 11.978 | 6.392 | 2.028 |
| 2012-06-06 | 1.291 | 5.328 | 4.565 | 11.699 | 6.22 | 1.996 |
| 2012-06-07 | 1.237 | 5.546 | 4.504 | 11.618 | 6.133 | 1.965 |
| 2012-06-08 | 1.237 | 5.546 | 4.504 | 11.618 | 6.133 | 1.965 |
| 2012-06-09 | 1.237 | 5.546 | 4.504 | 11.618 | 6.133 | 1.965 |
| 2012-06-10 | 1.232 | 5.614 | 4.456 | 11.659 | 6.117 | 1.945 |
| 2012-06-11 | 1.221 | 5.604 | 4.492 | 11.707 | 6.147 | 1.881 |
| 2012-06-12 | 1.275 | 5.78 | 4.659 | 12.123 | 6.279 | 1.971 |
| 2012-06-13 | 1.288 | 5.786 | 4.75 | 12.278 | 6.447 | 1.981 |
| 2012-06-14 | 1.349 | 5.952 | 4.866 | 12.927 | 6.594 | 2.007 |
| 2012-06-15 | 1.349 | 5.952 | 4.866 | 12.927 | 6.594 | 2.007 |
| 2012-06-16 | 1.349 | 5.952 | 4.866 | 12.927 | 6.594 | 2.007 |
| 2012-06-17 | 1.28 | 5.897 | 4.731 | 12.824 | 6.476 | 1.96 |
| 2012-06-18 | 1.246 | 5.458 | 4.649 | 12.784 | 6.406 | 1.96 |
| 2012-06-19 | 1.302 | 5.651 | 4.717 | 13.162 | 6.412 | 2.013 |
| 2012-06-20 | 1.332 | 5.751 | 4.761 | 13.642 | 6.541 | 2.009 |
| 2012-06-21 | 1.316 | 5.95 | 4.797 | 13.738 | 6.691 | 2.008 |
| 2012-06-22 | 1.316 | 5.95 | 4.797 | 13.738 | 6.691 | 2.008 |
| 2012-06-23 | 1.316 | 5.95 | 4.797 | 13.738 | 6.691 | 2.008 |
| 2012-06-24 | 1.332 | 6.203 | 4.938 | 14.021 | 6.917 | 1.997 |
| 2012-06-25 | 1.346 | 6.286 | 5.02 | 14.096 | 6.958 | 2.017 |
| 2012-06-26 | 1.339 | 6.292 | 5.031 | 14.096 | 6.969 | 2.033 |
| 2012-06-27 | 1.339 | 6.187 | 5.073 | 14.167 | 6.948 | 1.994 |
| 2012-06-28 | 1.361 | 6.162 | 5.172 | 14.064 | 7.012 | 2.116 |
| 2012-06-29 | 1.361 | 6.162 | 5.172 | 14.064 | 7.012 | 2.116 |
| 2012-06-30 | 1.361 | 6.162 | 5.172 | 14.064 | 7.012 | 2.116 |
| 2012-07-01 | 1.32 | 5.995 | 5.088 | 13.693 | 6.797 | 2.092 |
| 2012-07-02 | 1.31 | 5.9 | 4.99 | 13.455 | 6.66 | 2.101 |
| 2012-07-03 | 1.302 | 5.794 | 4.95 | 13.438 | 6.534 | 2.095 |
| 2012-07-04 | 1.33 | 5.752 | 4.994 | 13.625 | 6.475 | 2.084 |
| 2012-07-05 | 1.37 | 5.814 | 4.993 | 13.685 | 6.491 | 2.105 |
| 2012-07-06 | 1.37 | 5.814 | 4.993 | 13.685 | 6.491 | 2.105 |
| 2012-07-07 | 1.37 | 5.814 | 4.993 | 13.685 | 6.491 | 2.105 |
| 2012-07-08 | 1.34 | 5.734 | 4.976 | 13.475 | 6.544 | 2.119 |
| 2012-07-09 | 1.37 | 5.79 | 5.058 | 13.531 | 6.588 | 2.123 |
| 2012-07-10 | 1.386 | 5.499 | 4.995 | 13.318 | 6.596 | 2.138 |
| 2012-07-11 | 1.306 | 5.307 | 4.916 | 12.9 | 6.474 | 2.125 |
| 2012-07-12 | 1.309 | 5.184 | 4.836 | 12.591 | 6.404 | 2.227 |
| 2012-07-13 | 1.309 | 5.184 | 4.836 | 12.591 | 6.404 | 2.227 |
| 2012-07-14 | 1.309 | 5.184 | 4.836 | 12.591 | 6.404 | 2.227 |
| 2012-07-15 | 1.307 | 5.143 | 4.767 | 12.55 | 6.377 | 2.34 |
| 2012-07-16 | 1.286 | 5.095 | 4.761 | 12.678 | 6.321 | 2.381 |
| 2012-07-17 | 1.295 | 5.093 | 4.727 | 12.81 | 6.313 | 2.375 |
| 2012-07-18 | 1.343 | 5.144 | 4.763 | 12.83 | 6.396 | 2.428 |
| 2012-07-19 | 1.296 | 5.117 | 4.685 | 12.563 | 6.353 | 2.374 |
| 2012-07-20 | 1.296 | 5.117 | 4.685 | 12.563 | 6.353 | 2.374 |
| 2012-07-21 | 1.296 | 5.117 | 4.685 | 12.563 | 6.353 | 2.374 |
| 2012-07-22 | 1.341 | 5.255 | 4.809 | 12.928 | 6.44 | 2.396 |
| 2012-07-23 | 1.418 | 5.477 | 4.95 | 13.55 | 6.67 | 2.453 |
| 2012-07-24 | 1.46 | 5.639 | 5.13 | 14.026 | 6.761 | 2.513 |
| 2012-07-25 | 1.491 | 5.678 | 5.166 | 13.808 | 6.793 | 2.528 |
| 2012-07-26 | 1.488 | 5.626 | 5.215 | 14.06 | 6.799 | 2.526 |
| 2012-07-27 | 1.488 | 5.626 | 5.215 | 14.06 | 6.799 | 2.526 |
| 2012-07-28 | 1.488 | 5.626 | 5.215 | 14.06 | 6.799 | 2.526 |
| 2012-07-29 | 1.488 | 5.626 | 5.215 | 14.06 | 6.799 | 2.526 |
| 2012-07-30 | 1.441 | 5.472 | 5.137 | 13.876 | 6.716 | 2.437 |
| 2012-07-31 | 1.377 | 5.323 | 5 | 13.623 | 6.61 | 2.396 |
| 2012-08-01 | 1.345 | 5.321 | 4.97 | 13.486 | 6.505 | 2.361 |
| 2012-08-02 | 1.329 | 5.17 | 4.968 | 13.335 | 6.416 | 2.339 |
| 2012-08-03 | 1.329 | 5.17 | 4.968 | 13.335 | 6.416 | 2.339 |
| 2012-08-04 | 1.329 | 5.17 | 4.968 | 13.335 | 6.416 | 2.339 |
| 2012-08-05 | 1.329 | 5.265 | 4.943 | 13.362 | 6.306 | 2.297 |
| 2012-08-06 | 1.326 | 5.202 | 4.859 | 12.9 | 6.213 | 2.264 |
| 2012-08-07 | 1.282 | 5.096 | 4.71 | 12.244 | 6.039 | 2.122 |
| 2012-08-08 | 1.304 | 5.111 | 4.672 | 12.358 | 6.03 | 2.134 |
| 2012-08-09 | 1.253 | 5.083 | 4.644 | 12.358 | 5.987 | 2.049 |
| 2012-08-10 | 1.253 | 5.083 | 4.644 | 12.358 | 5.987 | 2.049 |
| 2012-08-11 | 1.253 | 5.083 | 4.644 | 12.358 | 5.987 | 2.049 |
| 2012-08-12 | 1.33 | 5.35 | 4.908 | 13.093 | 6.224 | 2.044 |
| 2012-08-13 | 1.425 | 5.555 | 5.359 | 13.783 | 6.542 | 2.141 |
| 2012-08-14 | 1.471 | 5.615 | 5.465 | 13.933 | 6.66 | 2.257 |
| 2012-08-15 | 1.474 | 5.726 | 5.576 | 14.093 | 6.774 | 2.322 |
| 2012-08-16 | 1.398 | 5.611 | 5.511 | 13.814 | 6.729 | 2.339 |
| 2012-08-17 | 1.398 | 5.611 | 5.511 | 13.814 | 6.729 | 2.339 |
| 2012-08-18 | 1.398 | 5.611 | 5.511 | 13.814 | 6.729 | 2.339 |
| 2012-08-19 | 1.398 | 5.712 | 5.502 | 13.659 | 6.672 | 2.388 |
| 2012-08-20 | 1.411 | 5.758 | 5.564 | 13.887 | 6.702 | 2.367 |
| 2012-08-21 | 1.38 | 5.688 | 5.612 | 14.114 | 6.746 | 2.384 |
| 2012-08-22 | 1.39 | 5.722 | 5.576 | 14.319 | 6.804 | 2.407 |
| 2012-08-23 | 1.414 | 5.8 | 5.701 | 14.8 | 6.984 | 2.372 |
| 2012-08-24 | 1.414 | 5.8 | 5.701 | 14.8 | 6.984 | 2.372 |
| 2012-08-25 | 1.414 | 5.8 | 5.701 | 14.8 | 6.984 | 2.372 |
| 2012-08-26 | 1.442 | 5.874 | 5.757 | 14.986 | 6.723 | 2.384 |
| 2012-08-27 | 1.432 | 5.924 | 5.859 | 15.133 | 7.011 | 2.384 |
| 2012-08-28 | 1.424 | 5.947 | 6.25 | 15.331 | 7.075 | 2.358 |
| 2012-08-29 | 1.396 | 5.956 | 6.423 | 15.4 | 7.083 | 2.311 |
| 2012-08-30 | 1.399 | 6.046 | 6.417 | 15.411 | 7.052 | 2.294 |
| 2012-08-31 | 1.399 | 6.046 | 6.417 | 15.411 | 7.052 | 2.294 |
| 2012-09-01 | 1.399 | 6.046 | 6.417 | 15.411 | 7.052 | 2.294 |
| 2012-09-02 | 1.415 | 6.188 | 6.836 | 15.615 | 7.345 | 2.373 |
| 2012-09-03 | 1.423 | 6.239 | 7.678 | 15.636 | 7.419 | 2.423 |
| 2012-09-04 | 1.407 | 6.25 | 7.601 | 16.05 | 7.516 | 2.455 |
| 2012-09-05 | 1.38 | 6.279 | 7.23 | 16.207 | 7.649 | 2.437 |
| 2012-09-06 | 1.404 | 6.381 | 7.207 | 16.431 | 7.788 | 2.444 |
| 2012-09-07 | 1.404 | 6.381 | 7.207 | 16.431 | 7.788 | 2.444 |
| 2012-09-08 | 1.404 | 6.381 | 7.207 | 16.431 | 7.788 | 2.444 |
| 2012-09-09 | 1.295 | 6.024 | 7.052 | 15.804 | 7.644 | 2.417 |
| 2012-09-10 | 1.317 | 5.973 | 6.79 | 15.724 | 7.528 | 2.366 |
| 2012-09-11 | 1.331 | 5.944 | 6.709 | 15.385 | 7.559 | 2.361 |
| 2012-09-12 | 1.333 | 5.869 | 6.487 | 14.783 | 7.479 | 2.33 |
| 2012-09-13 | 1.317 | 5.818 | 6.377 | 14.693 | 7.442 | 2.34 |
| 2012-09-14 | 1.317 | 5.818 | 6.377 | 14.693 | 7.442 | 2.34 |
| 2012-09-15 | 1.317 | 5.818 | 6.377 | 14.693 | 7.442 | 2.34 |
| 2012-09-16 | 1.317 | 5.818 | 6.377 | 14.693 | 7.442 | 2.34 |
| 2012-09-17 | 1.317 | 5.818 | 6.377 | 14.693 | 7.442 | 2.34 |
| 2012-09-18 | 1.317 | 5.818 | 6.377 | 14.693 | 7.442 | 2.34 |
| 2012-09-19 | 1.363 | 5.853 | 6.34 | 14.494 | 7.476 | 2.378 |
| 2012-09-20 | 1.354 | 5.875 | 6.24 | 14.994 | 7.462 | 2.397 |
| 2012-09-21 | 1.354 | 5.875 | 6.24 | 14.994 | 7.462 | 2.397 |
| 2012-09-22 | 1.354 | 5.875 | 6.24 | 14.994 | 7.462 | 2.397 |
| 2012-09-23 | 1.301 | 5.663 | 6.073 | 14.619 | 7.324 | 2.356 |
| 2012-09-24 | 1.278 | 5.535 | 5.954 | 14.376 | 6.813 | 2.318 |
| 2012-09-25 | 1.278 | 5.535 | 5.954 | 14.376 | 6.813 | 2.318 |
| 2012-09-26 | 1.278 | 5.535 | 5.954 | 14.376 | 6.813 | 2.318 |
| 2012-09-27 | 1.245 | 5.475 | 5.919 | 14.195 | 6.683 | 2.295 |
| 2012-09-28 | 1.245 | 5.475 | 5.919 | 14.195 | 6.683 | 2.295 |
| 2012-09-29 | 1.245 | 5.475 | 5.919 | 14.195 | 6.683 | 2.295 |
| 2012-09-30 | 1.245 | 5.475 | 5.919 | 14.195 | 6.683 | 2.295 |
| 2012-10-01 | 1.245 | 5.475 | 5.919 | 14.195 | 6.683 | 2.295 |
| 2012-10-02 | 1.247 | 5.384 | 5.807 | 13.83 | 6.582 | 2.292 |
| 2012-10-03 | 1.272 | 5.298 | 5.736 | 13.717 | 6.538 | 2.342 |
| 2012-10-04 | 1.26 | 5.243 | 5.817 | 13.717 | 6.51 | 2.328 |
| 2012-10-05 | 1.26 | 5.243 | 5.817 | 13.717 | 6.51 | 2.328 |
| 2012-10-06 | 1.26 | 5.243 | 5.817 | 13.717 | 6.51 | 2.328 |
| 2012-10-07 | 1.26 | 5.243 | 5.817 | 13.717 | 6.51 | 2.328 |
| 2012-10-08 | 1.26 | 5.243 | 5.817 | 13.717 | 6.51 | 2.328 |
| 2012-10-09 | 1.282 | 5.39 | 6.123 | 14.031 | 6.478 | 2.293 |
| 2012-10-10 | 1.278 | 5.334 | 6.188 | 13.695 | 6.433 | 2.308 |
| 2012-10-11 | 1.274 | 5.187 | 6.279 | 13.198 | 6.306 | 2.313 |
| 2012-10-12 | 1.274 | 5.187 | 6.279 | 13.198 | 6.306 | 2.313 |
| 2012-10-13 | 1.274 | 5.187 | 6.279 | 13.198 | 6.306 | 2.313 |
| 2012-10-14 | 1.272 | 4.884 | 6.132 | 13.173 | 6.527 | 2.284 |
| 2012-10-15 | 1.274 | 4.752 | 5.872 | 13.127 | 6.156 | 2.277 |
| 2012-10-16 | 1.217 | 4.534 | 5.634 | 12.749 | 5.981 | 2.177 |
| 2012-10-17 | 1.211 | 4.44 | 5.606 | 12.831 | 5.934 | 2.131 |
| 2012-10-18 | 1.215 | 4.238 | 5.555 | 12.821 | 5.917 | 2.105 |
| 2012-10-19 | 1.215 | 4.238 | 5.555 | 12.821 | 5.917 | 2.105 |
| 2012-10-20 | 1.215 | 4.238 | 5.555 | 12.821 | 5.917 | 2.105 |
| 2012-10-21 | 1.265 | 4.307 | 5.668 | 13.203 | 6.009 | 2.142 |
| 2012-10-22 | 1.291 | 4.201 | 5.624 | 13.145 | 5.987 | 2.126 |
| 2012-10-23 | 1.262 | 4.179 | 5.582 | 13.18 | 5.974 | 2.101 |
| 2012-10-24 | 1.228 | 4.135 | 5.508 | 13.087 | 5.902 | 2.032 |
| 2012-10-25 | 1.193 | 4.041 | 5.313 | 12.756 | 5.722 | 1.976 |
| 2012-10-26 | 1.193 | 4.041 | 5.313 | 12.756 | 5.722 | 1.976 |
| 2012-10-27 | 1.193 | 4.041 | 5.313 | 12.756 | 5.722 | 1.976 |
| 2012-10-28 | 1.183 | 3.981 | 5.238 | 12.759 | 5.691 | 1.963 |
| 2012-10-29 | 1.164 | 4.011 | 5.149 | 12.886 | 5.67 | 1.958 |
| 2012-10-30 | 1.168 | 3.919 | 5 | 12.809 | 5.589 | 2.013 |
| 2012-10-31 | 1.167 | 3.883 | 4.941 | 12.808 | 5.547 | 2.006 |
| 2012-11-01 | 1.169 | 3.911 | 4.833 | 12.752 | 5.499 | 1.987 |
| 2012-11-02 | 1.169 | 3.911 | 4.833 | 12.752 | 5.499 | 1.987 |
| 2012-11-03 | 1.169 | 3.911 | 4.833 | 12.752 | 5.499 | 1.987 |
| 2012-11-04 | 1.181 | 3.868 | 4.748 | 12.739 | 5.44 | 1.952 |
| 2012-11-05 | 1.178 | 3.974 | 4.686 | 12.708 | 5.406 | 1.925 |
| 2012-11-06 | 1.155 | 3.983 | 4.606 | 12.583 | 5.348 | 1.867 |
| 2012-11-07 | 1.172 | 3.92 | 4.655 | 12.672 | 5.37 | 1.893 |
| 2012-11-08 | 1.176 | 4.016 | 4.752 | 12.794 | 5.481 | 1.906 |
| 2012-11-09 | 1.176 | 4.016 | 4.752 | 12.794 | 5.481 | 1.906 |
| 2012-11-10 | 1.176 | 4.016 | 4.752 | 12.794 | 5.481 | 1.906 |
| 2012-11-11 | 1.162 | 4.059 | 4.714 | 12.612 | 5.452 | 1.915 |
| 2012-11-12 | 1.153 | 3.973 | 4.706 | 12.654 | 5.436 | 1.891 |
| 2012-11-13 | 1.129 | 3.945 | 4.671 | 12.498 | 5.334 | 1.872 |
| 2012-11-14 | 1.116 | 3.929 | 4.629 | 12.448 | 5.265 | 1.793 |
| 2012-11-15 | 1.096 | 3.894 | 4.66 | 12.63 | 5.313 | 1.792 |
| 2012-11-16 | 1.096 | 3.894 | 4.66 | 12.63 | 5.313 | 1.792 |
| 2012-11-17 | 1.096 | 3.894 | 4.66 | 12.63 | 5.313 | 1.792 |
| 2012-11-18 | 1.074 | 3.822 | 4.633 | 12.7 | 5.249 | 1.732 |
| 2012-11-19 | 1.094 | 3.839 | 4.613 | 12.672 | 5.241 | 1.726 |
| 2012-11-20 | 1.08 | 3.698 | 4.571 | 12.552 | 5.144 | 1.706 |
| 2012-11-21 | 1.085 | 3.621 | 4.57 | 12.49 | 5.049 | 1.702 |
| 2012-11-22 | 1.118 | 3.735 | 4.475 | 12.346 | 4.999 | 1.735 |
| 2012-11-23 | 1.118 | 3.735 | 4.475 | 12.346 | 4.999 | 1.735 |
| 2012-11-24 | 1.118 | 3.735 | 4.475 | 12.346 | 4.999 | 1.735 |
| 2012-11-25 | 1.121 | 3.554 | 4.454 | 12.181 | 4.949 | 1.748 |
| 2012-11-26 | 1.132 | 3.545 | 4.457 | 12.106 | 4.95 | 1.75 |
| 2012-11-27 | 1.073 | 3.454 | 4.367 | 12.092 | 4.874 | 1.658 |
| 2012-11-28 | 1.083 | 3.51 | 4.383 | 12.075 | 4.895 | 1.659 |
| 2012-11-29 | 1.067 | 3.32 | 4.247 | 11.644 | 4.838 | 1.653 |
| 2012-11-30 | 1.067 | 3.32 | 4.247 | 11.644 | 4.838 | 1.653 |
| 2012-12-01 | 1.067 | 3.32 | 4.247 | 11.644 | 4.838 | 1.653 |
| 2012-12-02 | 1.05 | 3.183 | 4.197 | 11.52 | 4.795 | 1.645 |
| 2012-12-03 | 1.069 | 3.173 | 4.247 | 11.479 | 4.81 | 1.605 |
| 2012-12-04 | 1.067 | 3.226 | 4.268 | 11.597 | 4.826 | 1.616 |
| 2012-12-05 | 1.085 | 3.222 | 4.307 | 11.534 | 4.813 | 1.672 |
| 2012-12-06 | 1.077 | 3.179 | 4.317 | 11.336 | 4.726 | 1.702 |
| 2012-12-07 | 1.077 | 3.179 | 4.317 | 11.336 | 4.726 | 1.702 |
| 2012-12-08 | 1.077 | 3.179 | 4.317 | 11.336 | 4.726 | 1.702 |
| 2012-12-09 | 1.036 | 3.072 | 4.263 | 11.349 | 4.724 | 1.661 |
| 2012-12-10 | 1.032 | 3.041 | 4.276 | 11.288 | 4.758 | 1.672 |
| 2012-12-11 | 1.046 | 3.04 | 4.308 | 11.518 | 4.796 | 1.666 |
| 2012-12-12 | 1.07 | 3.112 | 4.385 | 11.636 | 4.856 | 1.712 |
| 2012-12-13 | 1.108 | 3.173 | 4.418 | 11.819 | 4.87 | 1.749 |
| 2012-12-14 | 1.108 | 3.173 | 4.418 | 11.819 | 4.87 | 1.749 |
| 2012-12-15 | 1.108 | 3.173 | 4.418 | 11.819 | 4.87 | 1.749 |
| 2012-12-16 | 1.128 | 3.148 | 4.456 | 11.982 | 4.895 | 1.782 |
| 2012-12-17 | 1.141 | 3.205 | 4.525 | 12.096 | 4.901 | 1.799 |
| 2012-12-18 | 1.117 | 3.199 | 4.518 | 12.165 | 4.915 | 1.757 |
| 2012-12-19 | 1.146 | 3.212 | 4.429 | 11.979 | 4.887 | 1.779 |
| 2012-12-20 | 1.151 | 3.182 | 4.417 | 11.86 | 4.9 | 1.78 |
| 2012-12-21 | 1.151 | 3.182 | 4.417 | 11.86 | 4.9 | 1.78 |
| 2012-12-22 | 1.151 | 3.182 | 4.417 | 11.86 | 4.9 | 1.78 |
| 2012-12-23 | 1.161 | 3.217 | 4.433 | 12.042 | 4.973 | 1.866 |
| 2012-12-24 | 1.175 | 3.207 | 4.429 | 12.108 | 4.992 | 1.876 |
| 2012-12-25 | 1.172 | 3.137 | 4.388 | 12.136 | 4.966 | 1.895 |
| 2012-12-26 | 1.136 | 3.112 | 4.295 | 12.138 | 4.897 | 1.847 |
| 2012-12-27 | 1.122 | 3.118 | 4.213 | 12.025 | 4.855 | 1.8 |
| 2012-12-28 | 1.122 | 3.118 | 4.213 | 12.025 | 4.855 | 1.8 |
| 2012-12-29 | 1.122 | 3.118 | 4.213 | 12.025 | 4.855 | 1.8 |
| 2012-12-30 | 1.144 | 3.174 | 4.186 | 12.184 | 4.91 | 1.795 |
| 2012-12-31 | 1.124 | 3.111 | 4.148 | 12.181 | 4.871 | 1.734 |
| 2013-01-01 | 1.018 | 2.856 | 4.006 | 11.713 | 4.655 | 1.659 |
| 2013-01-02 | 0.986 | 2.741 | 4.01 | 11.339 | 4.532 | 1.601 |
| 2013-01-03 | 0.989 | 2.763 | 4.031 | 11.337 | 4.514 | 1.582 |
| 2013-01-04 | 0.989 | 2.763 | 4.031 | 11.337 | 4.514 | 1.582 |
| 2013-01-05 | 0.989 | 2.763 | 4.031 | 11.337 | 4.514 | 1.582 |
| 2013-01-06 | 0.98 | 2.743 | 3.997 | 11.317 | 4.366 | 1.555 |
| 2013-01-07 | 1.012 | 2.819 | 3.993 | 11.336 | 4.444 | 1.571 |
| 2013-01-08 | 1.029 | 2.786 | 3.999 | 11.364 | 4.442 | 1.588 |
| 2013-01-09 | 1.016 | 2.714 | 3.977 | 11.358 | 4.396 | 1.594 |
| 2013-01-10 | 1.046 | 2.732 | 3.968 | 11.34 | 4.429 | 1.584 |
| 2013-01-11 | 1.046 | 2.732 | 3.968 | 11.34 | 4.429 | 1.584 |
| 2013-01-12 | 1.046 | 2.732 | 3.968 | 11.34 | 4.429 | 1.584 |
| 2013-01-13 | 1.075 | 2.692 | 3.943 | 11.074 | 4.365 | 1.573 |
| 2013-01-14 | 1.092 | 2.727 | 4.007 | 11.113 | 4.407 | 1.567 |
| 2013-01-15 | 1.111 | 2.744 | 4.063 | 11.228 | 4.465 | 1.624 |
| 2013-01-16 | 1.102 | 2.836 | 4.108 | 11.311 | 4.509 | 1.634 |
| 2013-01-17 | 1.073 | 2.812 | 4.065 | 11.235 | 4.421 | 1.623 |
| 2013-01-18 | 1.073 | 2.812 | 4.065 | 11.235 | 4.421 | 1.623 |
| 2013-01-19 | 1.073 | 2.812 | 4.065 | 11.235 | 4.421 | 1.623 |
| 2013-01-20 | 1.089 | 2.839 | 4.092 | 11.324 | 4.446 | 1.624 |
| 2013-01-21 | 1.102 | 2.842 | 4.101 | 11.378 | 4.477 | 1.66 |
| 2013-01-22 | 1.102 | 2.842 | 4.101 | 11.378 | 4.477 | 1.66 |
| 2013-01-23 | 1.122 | 2.891 | 4.082 | 11.046 | 4.47 | 1.657 |
| 2013-01-24 | 1.083 | 2.873 | 4.108 | 10.977 | 4.464 | 1.625 |
| 2013-01-25 | 1.083 | 2.873 | 4.108 | 10.977 | 4.464 | 1.625 |
| 2013-01-26 | 1.083 | 2.873 | 4.108 | 10.977 | 4.464 | 1.625 |
| 2013-01-27 | 1.057 | 2.88 | 4.071 | 11.036 | 4.444 | 1.611 |
| 2013-01-28 | 1.067 | 2.883 | 4.089 | 11.003 | 4.418 | 1.614 |
| 2013-01-29 | 1.074 | 2.898 | 4.105 | 11.01 | 4.398 | 1.567 |
| 2013-01-30 | 1.089 | 2.925 | 4.166 | 11.037 | 4.446 | 1.588 |
| 2013-01-31 | 1.083 | 2.893 | 4.179 | 11.013 | 4.407 | 1.623 |
| 2013-02-01 | 1.083 | 2.893 | 4.179 | 11.013 | 4.407 | 1.623 |
| 2013-02-02 | 1.083 | 2.893 | 4.179 | 11.013 | 4.407 | 1.623 |
| 2013-02-03 | 1.076 | 2.849 | 4.184 | 10.749 | 4.388 | 1.644 |
| 2013-02-04 | 1.027 | 2.711 | 4.191 | 10.647 | 4.32 | 1.628 |
| 2013-02-05 | 1.023 | 2.694 | 4.127 | 10.46 | 4.269 | 1.606 |
| 2013-02-06 | 1.039 | 2.651 | 4.1 | 10.474 | 4.261 | 1.622 |
| 2013-02-07 | 1.027 | 2.619 | 4.081 | 10.563 | 4.238 | 1.556 |
| 2013-02-08 | 1.027 | 2.619 | 4.081 | 10.563 | 4.238 | 1.556 |
| 2013-02-09 | 1.027 | 2.619 | 4.081 | 10.563 | 4.238 | 1.556 |
| 2013-02-10 | 0.979 | 2.551 | 3.935 | 10.298 | 4.134 | 1.475 |
| 2013-02-11 | 0.958 | 2.546 | 3.872 | 10.259 | 4.069 | 1.421 |
| 2013-02-12 | 0.943 | 2.571 | 3.842 | 10.298 | 4.098 | 1.405 |
| 2013-02-13 | 0.961 | 2.625 | 3.811 | 10.029 | 4.14 | 1.436 |
| 2013-02-14 | 0.986 | 2.688 | 3.877 | 10.06 | 4.227 | 1.541 |
| 2013-02-15 | 0.986 | 2.688 | 3.877 | 10.06 | 4.227 | 1.541 |
| 2013-02-16 | 0.986 | 2.688 | 3.877 | 10.06 | 4.227 | 1.541 |
| 2013-02-17 | 0.998 | 2.666 | 3.866 | 10.015 | 4.22 | 1.484 |
| 2013-02-18 | 1.019 | 2.697 | 3.934 | 9.919 | 4.267 | 1.547 |
| 2013-02-19 | 1.01 | 2.624 | 3.885 | 9.789 | 4.148 | 1.52 |
| 2013-02-20 | 1.013 | 2.607 | 3.87 | 9.718 | 4.135 | 1.528 |
| 2013-02-21 | 1.006 | 2.61 | 3.902 | 9.712 | 4.157 | 1.522 |
| 2013-02-22 | 1.006 | 2.61 | 3.902 | 9.712 | 4.157 | 1.522 |
| 2013-02-23 | 1.006 | 2.61 | 3.902 | 9.712 | 4.157 | 1.522 |
| 2013-02-24 | 1.006 | 2.61 | 3.902 | 9.712 | 4.157 | 1.522 |
| 2013-02-25 | 1.001 | 2.633 | 3.905 | 9.729 | 4.15 | 1.491 |
| 2013-02-26 | 1.006 | 2.649 | 3.962 | 9.797 | 4.201 | 1.486 |
| 2013-02-27 | 0.962 | 2.67 | 3.947 | 9.782 | 4.129 | 1.458 |
| 2013-02-28 | 0.971 | 2.688 | 3.967 | 9.982 | 4.132 | 1.439 |
| 2013-03-01 | 0.971 | 2.688 | 3.967 | 9.982 | 4.132 | 1.439 |
| 2013-03-02 | 0.971 | 2.688 | 3.967 | 9.982 | 4.132 | 1.439 |
| 2013-03-03 | 0.973 | 2.628 | 3.933 | 10.022 | 4.109 | 1.45 |
| 2013-03-04 | 0.985 | 2.627 | 3.916 | 10.017 | 4.072 | 1.472 |
| 2013-03-05 | 1.009 | 2.637 | 3.908 | 10.081 | 4.057 | 1.496 |
| 2013-03-06 | 0.972 | 2.584 | 3.861 | 10.027 | 4.054 | 1.506 |
| 2013-03-07 | 0.944 | 2.539 | 3.849 | 10.01 | 4.11 | 1.494 |
| 2013-03-08 | 0.944 | 2.539 | 3.849 | 10.01 | 4.11 | 1.494 |
| 2013-03-09 | 0.944 | 2.539 | 3.849 | 10.01 | 4.11 | 1.494 |
| 2013-03-10 | 0.903 | 2.542 | 3.883 | 10.101 | 4.166 | 1.467 |
| 2013-03-11 | 0.964 | 2.719 | 3.985 | 10.531 | 4.483 | 1.51 |
| 2013-03-12 | 0.985 | 2.806 | 4.102 | 10.68 | 4.623 | 1.568 |
| 2013-03-13 | 0.983 | 2.799 | 4.105 | 10.777 | 4.653 | 1.563 |
| 2013-03-14 | 0.987 | 2.804 | 4.182 | 10.82 | 4.664 | 1.596 |
| 2013-03-15 | 0.987 | 2.804 | 4.182 | 10.82 | 4.664 | 1.596 |
| 2013-03-16 | 0.987 | 2.804 | 4.182 | 10.82 | 4.664 | 1.596 |
| 2013-03-17 | 1.021 | 2.887 | 4.266 | 11.279 | 4.698 | 1.637 |
| 2013-03-18 | 1.035 | 2.932 | 4.34 | 11.359 | 4.762 | 1.65 |
| 2013-03-19 | 1.057 | 2.982 | 4.33 | 11.169 | 4.772 | 1.655 |
| 2013-03-20 | 1.022 | 2.979 | 4.31 | 11.245 | 4.728 | 1.654 |
| 2013-03-21 | 1.068 | 3.13 | 4.431 | 11.426 | 4.873 | 1.686 |
| 2013-03-22 | 1.068 | 3.13 | 4.431 | 11.426 | 4.873 | 1.686 |
| 2013-03-23 | 1.068 | 3.13 | 4.431 | 11.426 | 4.873 | 1.686 |
| 2013-03-24 | 1.088 | 3.158 | 4.463 | 11.438 | 4.863 | 1.698 |
| 2013-03-25 | 1.088 | 3.158 | 4.463 | 11.438 | 4.863 | 1.698 |
| 2013-03-26 | 1.088 | 3.158 | 4.463 | 11.438 | 4.863 | 1.698 |
| 2013-03-27 | 1.047 | 3.082 | 4.441 | 11.389 | 4.795 | 1.697 |
| 2013-03-28 | 0.979 | 2.979 | 4.382 | 11.347 | 4.74 | 1.654 |
| 2013-03-29 | 0.979 | 2.979 | 4.382 | 11.347 | 4.74 | 1.654 |
| 2013-03-30 | 0.979 | 2.979 | 4.382 | 11.347 | 4.74 | 1.654 |
| 2013-03-31 | 0.979 | 2.979 | 4.382 | 11.347 | 4.74 | 1.654 |
| 2013-04-01 | 0.979 | 2.979 | 4.382 | 11.347 | 4.74 | 1.654 |
| 2013-04-02 | 0.911 | 2.908 | 4.332 | 11.319 | 4.688 | 1.552 |
| 2013-04-03 | 0.895 | 2.806 | 4.175 | 11.157 | 4.651 | 1.525 |
| 2013-04-04 | 0.911 | 2.78 | 4.137 | 11.123 | 4.671 | 1.511 |
| 2013-04-05 | 0.911 | 2.78 | 4.137 | 11.123 | 4.671 | 1.511 |
| 2013-04-06 | 0.911 | 2.78 | 4.137 | 11.123 | 4.671 | 1.511 |
| 2013-04-07 | 0.902 | 2.737 | 4.08 | 11.195 | 4.631 | 1.498 |
| 2013-04-08 | 0.892 | 2.724 | 4.132 | 11.257 | 4.643 | 1.475 |
| 2013-04-09 | 0.928 | 2.722 | 4.168 | 11.248 | 4.625 | 1.514 |
| 2013-04-10 | 0.924 | 2.708 | 4.189 | 11.212 | 4.622 | 1.517 |
| 2013-04-11 | 0.957 | 2.776 | 4.223 | 11.232 | 4.666 | 1.541 |
| 2013-04-12 | 0.957 | 2.776 | 4.223 | 11.232 | 4.666 | 1.541 |
| 2013-04-13 | 0.957 | 2.776 | 4.223 | 11.232 | 4.666 | 1.541 |
| 2013-04-14 | 0.997 | 2.787 | 4.237 | 11.37 | 4.651 | 1.501 |
| 2013-04-15 | 0.997 | 2.787 | 4.237 | 11.37 | 4.651 | 1.501 |
| 2013-04-16 | 0.997 | 2.787 | 4.237 | 11.37 | 4.651 | 1.501 |
| 2013-04-17 | 0.978 | 2.762 | 4.319 | 11.375 | 4.678 | 1.522 |
| 2013-04-18 | 0.963 | 2.694 | 4.315 | 11.554 | 4.666 | 1.517 |
| 2013-04-19 | 0.963 | 2.694 | 4.315 | 11.554 | 4.666 | 1.517 |
| 2013-04-20 | 0.963 | 2.694 | 4.315 | 11.554 | 4.666 | 1.517 |
| 2013-04-21 | 0.952 | 2.731 | 4.328 | 11.682 | 4.605 | 1.504 |
| 2013-04-22 | 0.973 | 2.817 | 4.401 | 11.563 | 4.586 | 1.511 |
| 2013-04-23 | 0.956 | 2.695 | 4.334 | 11.387 | 4.547 | 1.493 |
| 2013-04-24 | 0.935 | 2.656 | 4.286 | 11.297 | 4.486 | 1.503 |
| 2013-04-25 | 0.928 | 2.669 | 4.261 | 11.383 | 4.45 | 1.51 |
| 2013-04-26 | 0.928 | 2.669 | 4.261 | 11.383 | 4.45 | 1.51 |
| 2013-04-27 | 0.928 | 2.669 | 4.261 | 11.383 | 4.45 | 1.51 |
| 2013-04-28 | 0.951 | 2.684 | 4.229 | 11.386 | 4.436 | 1.512 |
| 2013-04-29 | 0.969 | 2.692 | 4.245 | 11.37 | 4.482 | 1.556 |
| 2013-04-30 | 0.908 | 2.601 | 4.212 | 11.267 | 4.406 | 1.531 |
| 2013-05-01 | 0.905 | 2.569 | 4.151 | 10.767 | 4.335 | 1.553 |
| 2013-05-02 | 0.87 | 2.481 | 4.09 | 10.688 | 4.311 | 1.561 |
| 2013-05-03 | 0.87 | 2.481 | 4.09 | 10.688 | 4.311 | 1.561 |
| 2013-05-04 | 0.87 | 2.481 | 4.09 | 10.688 | 4.311 | 1.561 |
| 2013-05-05 | 0.923 | 2.667 | 4.187 | 10.878 | 4.433 | 1.556 |
| 2013-05-06 | 0.914 | 2.646 | 4.168 | 10.611 | 4.382 | 1.531 |
| 2013-05-07 | 0.92 | 2.557 | 4.128 | 10.521 | 4.328 | 1.506 |
| 2013-05-08 | 0.901 | 2.477 | 4.072 | 10.412 | 4.303 | 1.5 |
| 2013-05-09 | 0.875 | 2.434 | 4.19 | 10.436 | 4.259 | 1.488 |
| 2013-05-10 | 0.875 | 2.434 | 4.19 | 10.436 | 4.259 | 1.488 |
| 2013-05-11 | 0.875 | 2.434 | 4.19 | 10.436 | 4.259 | 1.488 |
| 2013-05-12 | 0.883 | 2.488 | 4.482 | 10.607 | 4.32 | 1.465 |
| 2013-05-13 | 0.935 | 2.53 | 4.64 | 10.608 | 4.381 | 1.499 |
| 2013-05-14 | 0.935 | 2.53 | 4.64 | 10.608 | 4.381 | 1.499 |
| 2013-05-15 | 0.935 | 2.53 | 4.64 | 10.608 | 4.381 | 1.499 |
| 2013-05-16 | 0.875 | 2.444 | 4.571 | 10.623 | 4.34 | 1.48 |
| 2013-05-17 | 0.875 | 2.444 | 4.571 | 10.623 | 4.34 | 1.48 |
| 2013-05-18 | 0.875 | 2.444 | 4.571 | 10.623 | 4.34 | 1.48 |
| 2013-05-19 | 0.905 | 2.478 | 4.496 | 10.632 | 4.263 | 1.469 |
| 2013-05-20 | 0.876 | 2.471 | 4.313 | 10.743 | 4.256 | 1.483 |
| 2013-05-21 | 0.824 | 2.461 | 4.131 | 10.71 | 4.141 | 1.389 |
| 2013-05-22 | 0.857 | 2.587 | 4.067 | 10.658 | 4.132 | 1.427 |
| 2013-05-23 | 0.904 | 2.675 | 4.238 | 10.881 | 4.284 | 1.45 |
| 2013-05-24 | 0.904 | 2.675 | 4.238 | 10.881 | 4.284 | 1.45 |
| 2013-05-25 | 0.904 | 2.675 | 4.238 | 10.881 | 4.284 | 1.45 |
| 2013-05-26 | 0.922 | 2.74 | 4.261 | 10.909 | 4.326 | 1.438 |
| 2013-05-27 | 0.927 | 2.804 | 4.339 | 10.922 | 4.349 | 1.442 |
| 2013-05-28 | 0.912 | 2.793 | 4.348 | 10.844 | 4.33 | 1.458 |
| 2013-05-29 | 0.971 | 2.896 | 4.392 | 10.783 | 4.384 | 1.504 |
| 2013-05-30 | 1.01 | 2.923 | 4.496 | 10.896 | 4.404 | 1.597 |
| 2013-05-31 | 1.01 | 2.923 | 4.496 | 10.896 | 4.404 | 1.597 |
| 2013-06-01 | 1.01 | 2.923 | 4.496 | 10.896 | 4.404 | 1.597 |
| 2013-06-02 | 1.003 | 2.84 | 4.578 | 10.826 | 4.387 | 1.619 |
| 2013-06-03 | 0.946 | 2.728 | 4.406 | 10.719 | 4.145 | 1.584 |
| 2013-06-04 | 0.968 | 2.759 | 4.322 | 10.684 | 4.086 | 1.542 |
| 2013-06-05 | 0.91 | 2.694 | 4.215 | 10.53 | 3.968 | 1.482 |
| 2013-06-06 | 0.905 | 2.66 | 4.286 | 10.367 | 3.935 | 1.437 |
| 2013-06-07 | 0.905 | 2.66 | 4.286 | 10.367 | 3.935 | 1.437 |
| 2013-06-08 | 0.905 | 2.66 | 4.286 | 10.367 | 3.935 | 1.437 |
| 2013-06-09 | 0.953 | 2.667 | 4.266 | 9.208 | 3.929 | 1.44 |
| 2013-06-10 | 0.941 | 2.673 | 4.182 | 9.145 | 3.918 | 1.445 |
| 2013-06-11 | 0.936 | 2.695 | 4.215 | 9.192 | 3.953 | 1.423 |
| 2013-06-12 | 0.983 | 2.763 | 4.303 | 9.244 | 4.023 | 1.472 |
| 2013-06-13 | 1.008 | 2.773 | 4.396 | 9.297 | 4.064 | 1.443 |
| 2013-06-14 | 1.008 | 2.773 | 4.396 | 9.297 | 4.064 | 1.443 |
| 2013-06-15 | 1.008 | 2.773 | 4.396 | 9.297 | 4.064 | 1.443 |
| 2013-06-16 | 0.968 | 2.721 | 4.257 | 9.155 | 4 | 1.485 |
| 2013-06-17 | 0.887 | 2.57 | 4.136 | 9.097 | 3.895 | 1.424 |
| 2013-06-18 | 0.862 | 2.533 | 3.98 | 9.119 | 3.785 | 1.432 |
| 2013-06-19 | 0.896 | 2.595 | 3.932 | 9.185 | 3.646 | 1.447 |
| 2013-06-20 | 0.973 | 2.729 | 3.979 | 9.327 | 3.725 | 1.449 |
| 2013-06-21 | 0.973 | 2.729 | 3.979 | 9.327 | 3.725 | 1.449 |
| 2013-06-22 | 0.973 | 2.729 | 3.979 | 9.327 | 3.725 | 1.449 |
| 2013-06-23 | 0.994 | 2.709 | 4.042 | 9.41 | 3.78 | 1.484 |
| 2013-06-24 | 1.078 | 2.872 | 4.216 | 9.637 | 3.923 | 1.564 |
| 2013-06-25 | 1.081 | 2.839 | 4.233 | 9.684 | 3.872 | 1.573 |
| 2013-06-26 | 1.068 | 2.738 | 4.225 | 9.649 | 3.848 | 1.595 |
| 2013-06-27 | 1.024 | 2.615 | 4.128 | 9.562 | 3.758 | 1.578 |
| 2013-06-28 | 1.024 | 2.615 | 4.128 | 9.562 | 3.758 | 1.578 |
| 2013-06-29 | 1.024 | 2.615 | 4.128 | 9.562 | 3.758 | 1.578 |
| 2013-06-30 | 1.017 | 2.478 | 4.065 | 9.529 | 3.72 | 1.566 |
| 2013-07-01 | 0.995 | 2.408 | 3.979 | 9.463 | 3.685 | 1.551 |
| 2013-07-02 | 0.967 | 2.369 | 3.893 | 9.421 | 3.642 | 1.53 |
| 2013-07-03 | 0.982 | 2.366 | 3.945 | 9.528 | 3.654 | 1.537 |
| 2013-07-04 | 0.952 | 2.323 | 3.939 | 9.486 | 3.607 | 1.508 |
| 2013-07-05 | 0.952 | 2.323 | 3.939 | 9.486 | 3.607 | 1.508 |
| 2013-07-06 | 0.952 | 2.323 | 3.939 | 9.486 | 3.607 | 1.508 |
| 2013-07-07 | 0.963 | 2.342 | 3.929 | 10.274 | 3.625 | 1.492 |
| 2013-07-08 | 0.947 | 2.298 | 3.928 | 10.312 | 3.633 | 1.486 |
| 2013-07-09 | 0.971 | 2.279 | 3.988 | 10.372 | 3.62 | 1.495 |
| 2013-07-10 | 0.957 | 2.27 | 4.008 | 10.297 | 3.607 | 1.455 |
| 2013-07-11 | 0.949 | 2.222 | 3.986 | 10.251 | 3.585 | 1.486 |
| 2013-07-12 | 0.949 | 2.222 | 3.986 | 10.251 | 3.585 | 1.486 |
| 2013-07-13 | 0.949 | 2.222 | 3.986 | 10.251 | 3.585 | 1.486 |
| 2013-07-14 | 0.91 | 2.182 | 3.955 | 10.294 | 3.525 | 1.534 |
| 2013-07-15 | 0.927 | 2.188 | 4.111 | 10.34 | 3.531 | 1.53 |
| 2013-07-16 | 0.927 | 2.188 | 4.111 | 10.34 | 3.531 | 1.53 |
| 2013-07-17 | 0.943 | 2.218 | 4.121 | 10.4 | 3.575 | 1.56 |
| 2013-07-18 | 0.902 | 2.131 | 4.088 | 10.409 | 3.494 | 1.485 |
| 2013-07-19 | 0.902 | 2.131 | 4.088 | 10.409 | 3.494 | 1.485 |
| 2013-07-20 | 0.902 | 2.131 | 4.088 | 10.409 | 3.494 | 1.485 |
| 2013-07-21 | 0.939 | 2.164 | 4.129 | 10.486 | 3.482 | 1.485 |
| 2013-07-22 | 0.931 | 2.153 | 4.123 | 10.474 | 3.444 | 1.477 |
| 2013-07-23 | 0.921 | 2.129 | 4.181 | 10.456 | 3.454 | 1.477 |
| 2013-07-24 | 0.888 | 2.139 | 4.147 | 10.351 | 3.453 | 1.45 |
| 2013-07-25 | 0.91 | 2.179 | 4.104 | 10.373 | 3.496 | 1.485 |
| 2013-07-26 | 0.91 | 2.179 | 4.104 | 10.373 | 3.496 | 1.485 |
| 2013-07-27 | 0.91 | 2.179 | 4.104 | 10.373 | 3.496 | 1.485 |
| 2013-07-28 | 0.933 | 2.19 | 4.085 | 10.462 | 3.552 | 1.526 |
| 2013-07-29 | 0.941 | 2.23 | 4.068 | 10.507 | 3.576 | 1.534 |
| 2013-07-30 | 0.943 | 2.358 | 4.049 | 8.985 | 3.608 | 1.53 |
| 2013-07-31 | 0.913 | 2.373 | 4.155 | 9.018 | 3.599 | 1.5 |
| 2013-08-01 | 0.898 | 2.12 | 4.154 | 8.975 | 3.527 | 1.455 |
| 2013-08-02 | 0.898 | 2.12 | 4.154 | 8.975 | 3.527 | 1.455 |
| 2013-08-03 | 0.898 | 2.12 | 4.154 | 8.975 | 3.527 | 1.455 |
| 2013-08-04 | 0.857 | 2.008 | 4.122 | 8.929 | 3.502 | 1.455 |
| 2013-08-05 | 0.883 | 2.028 | 4.109 | 8.854 | 3.513 | 1.438 |
| 2013-08-06 | 0.884 | 2.022 | 4.122 | 8.904 | 3.525 | 1.404 |
| 2013-08-07 | 0.911 | 2.036 | 4.118 | 8.887 | 3.523 | 1.399 |
| 2013-08-08 | 0.903 | 2.035 | 4.083 | 8.768 | 3.51 | 1.395 |
| 2013-08-09 | 0.903 | 2.035 | 4.083 | 8.768 | 3.51 | 1.395 |
| 2013-08-10 | 0.903 | 2.035 | 4.083 | 8.768 | 3.51 | 1.395 |
| 2013-08-11 | 0.919 | 2.024 | 4.027 | 8.637 | 3.471 | 1.405 |
| 2013-08-12 | 0.871 | 1.99 | 3.963 | 8.622 | 3.416 | 1.366 |
| 2013-08-13 | 0.852 | 1.958 | 3.93 | 8.601 | 3.382 | 1.359 |
| 2013-08-14 | 0.864 | 1.989 | 3.949 | 8.611 | 3.397 | 1.346 |
| 2013-08-15 | 0.881 | 1.985 | 3.963 | 8.646 | 3.433 | 1.342 |
| 2013-08-16 | 0.881 | 1.985 | 3.963 | 8.646 | 3.433 | 1.342 |
| 2013-08-17 | 0.881 | 1.985 | 3.963 | 8.646 | 3.433 | 1.342 |
| 2013-08-18 | 0.906 | 2.059 | 3.988 | 8.729 | 3.461 | 1.34 |
| 2013-08-19 | 0.906 | 2.1 | 4.007 | 8.709 | 3.497 | 1.357 |
| 2013-08-20 | 0.952 | 2.102 | 4.005 | 8.715 | 3.502 | 1.431 |
| 2013-08-21 | 0.944 | 2.041 | 4.013 | 8.467 | 3.47 | 1.413 |
| 2013-08-22 | 0.964 | 2.066 | 4.062 | 8.26 | 3.47 | 1.411 |
| 2013-08-23 | 0.964 | 2.066 | 4.062 | 8.26 | 3.47 | 1.411 |
| 2013-08-24 | 0.964 | 2.066 | 4.062 | 8.26 | 3.47 | 1.411 |
| 2013-08-25 | 0.947 | 2.016 | 4.075 | 8.241 | 3.446 | 1.473 |
| 2013-08-26 | 0.954 | 2.064 | 4.103 | 8.252 | 3.474 | 1.487 |
| 2013-08-27 | 1.029 | 2.248 | 4.234 | 8.569 | 3.607 | 1.563 |
| 2013-08-28 | 1.058 | 2.323 | 4.323 | 8.652 | 3.68 | 1.618 |
| 2013-08-29 | 1.015 | 2.154 | 4.22 | 8.469 | 3.652 | 1.572 |
| 2013-08-30 | 1.015 | 2.154 | 4.22 | 8.469 | 3.652 | 1.572 |
| 2013-08-31 | 1.015 | 2.154 | 4.22 | 8.469 | 3.652 | 1.572 |
| 2013-09-01 | 0.959 | 2.052 | 4.102 | 8.258 | 3.528 | 1.526 |
| 2013-09-02 | 0.974 | 2.056 | 4.024 | 8.178 | 3.527 | 1.507 |
| 2013-09-03 | 0.964 | 2.006 | 4.024 | 8.261 | 3.536 | 1.432 |
| 2013-09-04 | 0.964 | 2.006 | 4.024 | 8.261 | 3.536 | 1.432 |
| 2013-09-05 | 0.964 | 2.006 | 4.024 | 8.261 | 3.536 | 1.432 |
| 2013-09-06 | 0.964 | 2.006 | 4.024 | 8.261 | 3.536 | 1.432 |
| 2013-09-07 | 0.964 | 2.006 | 4.024 | 8.261 | 3.536 | 1.432 |
| 2013-09-08 | 1.045 | 2.124 | 4.12 | 8.451 | 3.636 | 1.428 |
| 2013-09-09 | 1.001 | 2.065 | 4.075 | 8.418 | 3.604 | 1.463 |
| 2013-09-10 | 0.99 | 2.022 | 4.567 | 8.382 | 3.569 | 1.451 |
| 2013-09-11 | 0.983 | 2.013 | 4.607 | 8.272 | 3.54 | 1.428 |
| 2013-09-12 | 0.938 | 1.994 | 4.641 | 8.157 | 3.481 | 1.416 |
| 2013-09-13 | 0.938 | 1.994 | 4.641 | 8.157 | 3.481 | 1.416 |
| 2013-09-14 | 0.938 | 1.994 | 4.641 | 8.157 | 3.481 | 1.416 |
| 2013-09-15 | 0.907 | 1.912 | 4.687 | 7.906 | 3.386 | 1.361 |
| 2013-09-16 | 0.903 | 1.825 | 4.65 | 7.844 | 3.344 | 1.385 |
| 2013-09-17 | 0.902 | 1.817 | 4.601 | 7.871 | 3.371 | 1.406 |
| 2013-09-18 | 0.902 | 1.817 | 4.601 | 7.871 | 3.371 | 1.406 |
| 2013-09-19 | 0.902 | 1.817 | 4.601 | 7.871 | 3.371 | 1.406 |
| 2013-09-20 | 0.902 | 1.817 | 4.601 | 7.871 | 3.371 | 1.406 |
| 2013-09-21 | 0.902 | 1.817 | 4.601 | 7.871 | 3.371 | 1.406 |
| 2013-09-22 | 0.926 | 1.83 | 4.674 | 7.909 | 3.401 | 1.412 |
| 2013-09-23 | 0.919 | 1.784 | 4.684 | 7.916 | 3.378 | 1.422 |
| 2013-09-24 | 0.875 | 1.747 | 4.571 | 7.899 | 3.347 | 1.406 |
| 2013-09-25 | 0.875 | 1.747 | 4.571 | 7.899 | 3.347 | 1.406 |
| 2013-09-26 | 0.875 | 1.747 | 4.571 | 7.899 | 3.347 | 1.406 |
| 2013-09-27 | 0.875 | 1.747 | 4.571 | 7.899 | 3.347 | 1.406 |
| 2013-09-28 | 0.875 | 1.747 | 4.571 | 7.899 | 3.347 | 1.406 |
| 2013-09-29 | 0.893 | 1.742 | 4.503 | 7.997 | 3.356 | 1.299 |
| 2013-09-30 | 0.874 | 1.746 | 4.465 | 7.921 | 3.35 | 1.278 |
| 2013-10-01 | 0.86 | 1.731 | 4.33 | 7.873 | 3.355 | 1.28 |
| 2013-10-02 | 0.867 | 1.708 | 4.359 | 7.765 | 3.247 | 1.292 |
| 2013-10-03 | 0.894 | 1.756 | 4.507 | 7.526 | 3.26 | 1.326 |
| 2013-10-04 | 0.894 | 1.756 | 4.507 | 7.526 | 3.26 | 1.326 |
| 2013-10-05 | 0.894 | 1.756 | 4.507 | 7.526 | 3.26 | 1.326 |
| 2013-10-06 | 0.907 | 1.781 | 4.748 | 7.578 | 3.196 | 1.344 |
| 2013-10-07 | 0.885 | 1.8 | 5.507 | 7.631 | 3.19 | 1.333 |
| 2013-10-08 | 0.891 | 1.83 | 6.702 | 7.791 | 3.231 | 1.35 |
| 2013-10-09 | 0.914 | 1.847 | 6.165 | 7.868 | 3.245 | 1.383 |
| 2013-10-10 | 0.928 | 1.823 | 5.963 | 7.831 | 3.255 | 1.38 |
| 2013-10-11 | 0.928 | 1.823 | 5.963 | 7.831 | 3.255 | 1.38 |
| 2013-10-12 | 0.928 | 1.823 | 5.963 | 7.831 | 3.255 | 1.38 |
| 2013-10-13 | 0.963 | 1.819 | 6.11 | 7.951 | 3.281 | 1.393 |
| 2013-10-14 | 0.867 | 1.692 | 5.946 | 7.879 | 3.21 | 1.193 |
| 2013-10-15 | 0.867 | 1.718 | 5.772 | 7.896 | 3.208 | 1.246 |
| 2013-10-16 | 0.888 | 1.736 | 5.583 | 7.964 | 3.232 | 1.309 |
| 2013-10-17 | 0.914 | 1.755 | 4.773 | 8.131 | 3.254 | 1.384 |
| 2013-10-18 | 0.914 | 1.755 | 4.773 | 8.131 | 3.254 | 1.384 |
| 2013-10-19 | 0.914 | 1.755 | 4.773 | 8.131 | 3.254 | 1.384 |
| 2013-10-20 | 0.904 | 1.688 | 4.728 | 8.065 | 3.264 | 1.42 |
| 2013-10-21 | 0.853 | 1.634 | 4.744 | 8.034 | 3.196 | 1.388 |
| 2013-10-22 | 0.865 | 1.663 | 4.777 | 7.983 | 3.216 | 1.405 |
| 2013-10-23 | 0.872 | 1.74 | 4.853 | 7.991 | 3.26 | 1.42 |
| 2013-10-24 | 0.863 | 1.731 | 4.828 | 8.008 | 3.265 | 1.433 |
| 2013-10-25 | 0.863 | 1.731 | 4.828 | 8.008 | 3.265 | 1.433 |
| 2013-10-26 | 0.863 | 1.731 | 4.828 | 8.008 | 3.265 | 1.433 |
| 2013-10-27 | 0.833 | 1.734 | 4.854 | 8.051 | 3.269 | 1.439 |
| 2013-10-28 | 0.835 | 1.752 | 4.78 | 8.03 | 3.275 | 1.432 |
| 2013-10-29 | 0.83 | 1.796 | 4.719 | 8.005 | 3.255 | 1.409 |
| 2013-10-30 | 0.77 | 1.801 | 5.052 | 7.968 | 3.251 | 1.412 |
| 2013-10-31 | 0.8 | 1.774 | 5.116 | 8.058 | 3.251 | 1.397 |
| 2013-11-01 | 0.8 | 1.774 | 5.116 | 8.058 | 3.251 | 1.397 |
| 2013-11-02 | 0.8 | 1.774 | 5.116 | 8.058 | 3.251 | 1.397 |
| 2013-11-03 | 0.771 | 1.739 | 5.134 | 8.026 | 3.255 | 1.367 |
| 2013-11-04 | 0.776 | 1.748 | 5.109 | 7.985 | 3.195 | 1.374 |
| 2013-11-05 | 0.792 | 1.755 | 5.251 | 7.999 | 3.207 | 1.388 |
| 2013-11-06 | 0.758 | 1.7 | 5.194 | 7.945 | 3.144 | 1.388 |
| 2013-11-07 | 0.762 | 1.682 | 5.191 | 8.069 | 3.134 | 1.406 |
| 2013-11-08 | 0.762 | 1.682 | 5.191 | 8.069 | 3.134 | 1.406 |
| 2013-11-09 | 0.762 | 1.682 | 5.191 | 8.069 | 3.134 | 1.406 |
| 2013-11-10 | 0.748 | 1.678 | 5.212 | 8.164 | 3.13 | 1.356 |
| 2013-11-11 | 0.761 | 1.696 | 5.163 | 8.105 | 3.152 | 1.363 |
| 2013-11-12 | 0.798 | 1.715 | 5.169 | 7.765 | 3.188 | 1.404 |
| 2013-11-13 | 0.805 | 1.657 | 5.081 | 7.886 | 3.184 | 1.389 |
| 2013-11-14 | 0.773 | 1.6 | 5.044 | 7.837 | 3.137 | 1.36 |
| 2013-11-15 | 0.773 | 1.6 | 5.044 | 7.837 | 3.137 | 1.36 |
| 2013-11-16 | 0.773 | 1.6 | 5.044 | 7.837 | 3.137 | 1.36 |
| 2013-11-17 | 0.75 | 1.562 | 4.991 | 7.295 | 3.106 | 1.393 |
| 2013-11-18 | 0.773 | 1.586 | 5.002 | 7.275 | 3.089 | 1.324 |
| 2013-11-19 | 0.785 | 1.668 | 5.031 | 7.214 | 3.016 | 1.3 |
| 2013-11-20 | 0.799 | 1.689 | 4.994 | 7.21 | 3.026 | 1.301 |
| 2013-11-21 | 0.832 | 1.681 | 5.128 | 7.28 | 3.086 | 1.354 |
| 2013-11-22 | 0.832 | 1.681 | 5.128 | 7.28 | 3.086 | 1.354 |
| 2013-11-23 | 0.832 | 1.681 | 5.128 | 7.28 | 3.086 | 1.354 |
| 2013-11-24 | 0.859 | 1.726 | 5.03 | 7.17 | 3.092 | 1.39 |
| 2013-11-25 | 0.889 | 1.767 | 5.112 | 7.281 | 3.145 | 1.44 |
| 2013-11-26 | 0.868 | 1.731 | 5.124 | 7.211 | 3.141 | 1.468 |
| 2013-11-27 | 0.828 | 1.707 | 5.236 | 7.211 | 3.124 | 1.434 |
| 2013-11-28 | 0.844 | 1.736 | 5.184 | 7.139 | 3.125 | 1.426 |
| 2013-11-29 | 0.844 | 1.736 | 5.184 | 7.139 | 3.125 | 1.426 |
| 2013-11-30 | 0.844 | 1.736 | 5.184 | 7.139 | 3.125 | 1.426 |
| 2013-12-01 | 0.853 | 1.689 | 5.15 | 7.059 | 3.121 | 1.434 |
| 2013-12-02 | 0.858 | 1.648 | 4.88 | 7.354 | 3.112 | 1.401 |
| 2013-12-03 | 0.848 | 1.655 | 4.862 | 7.352 | 3.114 | 1.42 |
| 2013-12-04 | 0.843 | 1.665 | 4.836 | 7.395 | 3.113 | 1.394 |
| 2013-12-05 | 0.843 | 1.654 | 4.757 | 6.978 | 3.088 | 1.364 |
| 2013-12-06 | 0.843 | 1.654 | 4.757 | 6.978 | 3.088 | 1.364 |
| 2013-12-07 | 0.843 | 1.654 | 4.757 | 6.978 | 3.088 | 1.364 |
| 2013-12-08 | 0.852 | 1.683 | 4.769 | 6.349 | 3.1 | 1.372 |
| 2013-12-09 | 0.867 | 1.711 | 4.74 | 6.391 | 3.102 | 1.407 |
| 2013-12-10 | 0.877 | 1.704 | 4.843 | 6.182 | 3.122 | 1.441 |
| 2013-12-11 | 0.911 | 1.74 | 4.984 | 6.165 | 3.146 | 1.446 |
| 2013-12-12 | 0.906 | 1.76 | 5.003 | 6.215 | 3.166 | 1.42 |
| 2013-12-13 | 0.906 | 1.76 | 5.003 | 6.215 | 3.166 | 1.42 |
| 2013-12-14 | 0.906 | 1.76 | 5.003 | 6.215 | 3.166 | 1.42 |
| 2013-12-15 | 0.888 | 1.754 | 4.991 | 6.211 | 3.177 | 1.452 |
| 2013-12-16 | 0.907 | 1.82 | 5.076 | 6.248 | 3.215 | 1.473 |
| 2013-12-17 | 0.909 | 1.837 | 5.097 | 6.256 | 3.203 | 1.461 |
| 2013-12-18 | 0.892 | 1.816 | 4.953 | 6.19 | 3.178 | 1.422 |
| 2013-12-19 | 0.882 | 1.768 | 4.916 | 5.963 | 3.185 | 1.398 |
| 2013-12-20 | 0.882 | 1.768 | 4.916 | 5.963 | 3.185 | 1.398 |
| 2013-12-21 | 0.882 | 1.768 | 4.916 | 5.963 | 3.185 | 1.398 |
| 2013-12-22 | 0.885 | 1.782 | 4.926 | 6.019 | 3.191 | 1.399 |
| 2013-12-23 | 0.898 | 1.767 | 4.917 | 6.057 | 3.195 | 1.384 |
| 2013-12-24 | 0.925 | 1.833 | 5.025 | 6.091 | 3.239 | 1.378 |
| 2013-12-25 | 0.982 | 1.868 | 5.023 | 6.121 | 3.304 | 1.45 |
| 2013-12-26 | 0.974 | 1.836 | 4.951 | 6.135 | 3.303 | 1.476 |
| 2013-12-27 | 0.974 | 1.836 | 4.951 | 6.135 | 3.303 | 1.476 |
| 2013-12-28 | 0.974 | 1.836 | 4.951 | 6.135 | 3.303 | 1.476 |
| 2013-12-29 | 1.006 | 1.899 | 5.001 | 6.162 | 3.302 | 1.47 |
| 2013-12-30 | 0.818 | 1.751 | 4.943 | 5.468 | 3.251 | 1.449 |
| 2013-12-31 | 0.839 | 1.696 | 4.914 | 5.486 | 3.214 | 1.417 |
| 2014-01-01 | 0.845 | 1.655 | 4.847 | 5.413 | 3.145 | 1.398 |
| 2014-01-02 | 0.855 | 1.643 | 4.842 | 5.418 | 3.16 | 1.405 |
| 2014-01-03 | 0.855 | 1.643 | 4.842 | 5.418 | 3.16 | 1.405 |
| 2014-01-04 | 0.855 | 1.643 | 4.842 | 5.418 | 3.16 | 1.405 |
| 2014-01-05 | 0.832 | 1.616 | 4.826 | 5.355 | 3.119 | 1.393 |
| 2014-01-06 | 0.855 | 1.653 | 4.8 | 5.265 | 3.107 | 1.384 |
| 2014-01-07 | 0.872 | 1.65 | 4.774 | 5.255 | 3.098 | 1.374 |
| 2014-01-08 | 0.86 | 1.643 | 4.725 | 5.312 | 3.081 | 1.359 |
| 2014-01-09 | 0.878 | 1.612 | 4.727 | 5.36 | 3.074 | 1.39 |
| 2014-01-10 | 0.878 | 1.612 | 4.727 | 5.36 | 3.074 | 1.39 |
| 2014-01-11 | 0.878 | 1.612 | 4.727 | 5.36 | 3.074 | 1.39 |
| 2014-01-12 | 0.908 | 1.624 | 4.704 | 5.471 | 3.07 | 1.414 |
| 2014-01-13 | 0.887 | 1.617 | 4.662 | 5.391 | 3.039 | 1.394 |
| 2014-01-14 | 0.874 | 1.603 | 4.645 | 5.401 | 3.017 | 1.369 |
| 2014-01-15 | 0.836 | 1.582 | 4.607 | 5.529 | 2.962 | 1.35 |
| 2014-01-16 | 0.833 | 1.572 | 4.567 | 5.526 | 2.937 | 1.343 |
| 2014-01-17 | 0.833 | 1.572 | 4.567 | 5.526 | 2.937 | 1.343 |
| 2014-01-18 | 0.833 | 1.572 | 4.567 | 5.526 | 2.937 | 1.343 |
| 2014-01-19 | 0.824 | 1.547 | 4.63 | 5.607 | 2.912 | 1.313 |
| 2014-01-20 | 0.849 | 1.573 | 4.78 | 5.254 | 2.929 | 1.297 |
| 2014-01-21 | 0.867 | 1.598 | 4.807 | 5.287 | 2.952 | 1.305 |
| 2014-01-22 | 0.86 | 1.617 | 4.81 | 5.309 | 2.966 | 1.302 |
| 2014-01-23 | 0.892 | 1.654 | 4.851 | 5.387 | 2.997 | 1.348 |
| 2014-01-24 | 0.892 | 1.654 | 4.851 | 5.387 | 2.997 | 1.348 |
| 2014-01-25 | 0.892 | 1.654 | 4.851 | 5.387 | 2.997 | 1.348 |
| 2014-01-26 | 0.926 | 1.687 | 4.957 | 5.494 | 3.081 | 1.379 |
| 2014-01-27 | 0.93 | 1.73 | 4.994 | 5.61 | 3.086 | 1.38 |
| 2014-01-28 | 0.887 | 1.658 | 4.924 | 5.562 | 3.067 | 1.344 |
| 2014-01-29 | 0.9 | 1.69 | 4.991 | 5.59 | 3.095 | 1.338 |
| 2014-01-30 | 0.891 | 1.676 | 4.981 | 5.559 | 3.119 | 1.359 |
| 2014-01-31 | 0.891 | 1.676 | 4.981 | 5.559 | 3.119 | 1.359 |
| 2014-02-01 | 0.891 | 1.676 | 4.981 | 5.559 | 3.119 | 1.359 |
| 2014-02-02 | 0.884 | 1.657 | 4.984 | 5.799 | 3.129 | 1.365 |
| 2014-02-03 | 0.9 | 1.661 | 4.987 | 5.441 | 3.147 | 1.362 |
| 2014-02-04 | 0.896 | 1.648 | 5.03 | 5.48 | 3.183 | 1.414 |
| 2014-02-05 | 0.896 | 1.683 | 4.992 | 5.479 | 3.145 | 1.409 |
| 2014-02-06 | 0.909 | 1.694 | 5.01 | 5.447 | 3.139 | 1.399 |
| 2014-02-07 | 0.909 | 1.694 | 5.01 | 5.447 | 3.139 | 1.399 |
| 2014-02-08 | 0.909 | 1.694 | 5.01 | 5.447 | 3.139 | 1.399 |
| 2014-02-09 | 0.905 | 1.663 | 5.029 | 5.456 | 3.144 | 1.425 |
| 2014-02-10 | 0.923 | 1.667 | 5.005 | 5.485 | 3.14 | 1.426 |
| 2014-02-11 | 0.893 | 1.621 | 4.969 | 5.427 | 3.086 | 1.39 |
| 2014-02-12 | 0.875 | 1.597 | 4.889 | 5.391 | 3.062 | 1.351 |
| 2014-02-13 | 0.866 | 1.59 | 4.902 | 5.38 | 3.054 | 1.366 |
| 2014-02-14 | 0.866 | 1.59 | 4.902 | 5.38 | 3.054 | 1.366 |
| 2014-02-15 | 0.866 | 1.59 | 4.902 | 5.38 | 3.054 | 1.366 |
| 2014-02-16 | 0.844 | 1.501 | 4.817 | 5.333 | 2.988 | 1.342 |
| 2014-02-17 | 0.853 | 1.524 | 4.757 | 5.294 | 2.978 | 1.337 |
| 2014-02-18 | 0.867 | 1.528 | 4.755 | 4.559 | 2.988 | 1.331 |
| 2014-02-19 | 0.914 | 1.569 | 4.779 | 4.617 | 3.002 | 1.305 |
| 2014-02-20 | 0.91 | 1.553 | 4.76 | 4.641 | 3.015 | 1.3 |
| 2014-02-21 | 0.91 | 1.553 | 4.76 | 4.641 | 3.015 | 1.3 |
| 2014-02-22 | 0.91 | 1.553 | 4.76 | 4.641 | 3.015 | 1.3 |
| 2014-02-23 | 0.924 | 1.542 | 4.778 | 4.786 | 3.024 | 1.328 |
| 2014-02-24 | 0.894 | 1.529 | 4.769 | 4.792 | 2.989 | 1.31 |
| 2014-02-25 | 0.911 | 1.531 | 4.723 | 4.773 | 2.942 | 1.361 |
| 2014-02-26 | 0.906 | 1.516 | 4.744 | 4.744 | 2.971 | 1.359 |
| 2014-02-27 | 0.89 | 1.498 | 4.874 | 4.85 | 2.977 | 1.357 |
| 2014-02-28 | 0.89 | 1.498 | 4.874 | 4.85 | 2.977 | 1.357 |
| 2014-03-01 | 0.89 | 1.498 | 4.874 | 4.85 | 2.977 | 1.357 |
| 2014-03-02 | 0.893 | 1.498 | 4.873 | 5.066 | 2.935 | 1.366 |
| 2014-03-03 | 0.874 | 1.503 | 4.835 | 4.977 | 2.935 | 1.358 |
| 2014-03-04 | 0.876 | 1.521 | 4.819 | 4.993 | 2.935 | 1.376 |
| 2014-03-05 | 0.892 | 1.588 | 4.824 | 5.024 | 2.955 | 1.397 |
| 2014-03-06 | 0.856 | 1.534 | 4.816 | 4.955 | 2.921 | 1.36 |
| 2014-03-07 | 0.856 | 1.534 | 4.816 | 4.955 | 2.921 | 1.36 |
| 2014-03-08 | 0.856 | 1.534 | 4.816 | 4.955 | 2.921 | 1.36 |
| 2014-03-09 | 0.856 | 1.503 | 4.819 | 4.859 | 2.884 | 1.306 |
| 2014-03-10 | 0.859 | 1.479 | 4.833 | 4.829 | 2.841 | 1.289 |
| 2014-03-11 | 0.852 | 1.495 | 4.903 | 4.788 | 2.824 | 1.302 |
| 2014-03-12 | 0.828 | 1.485 | 4.981 | 4.816 | 2.812 | 1.27 |
| 2014-03-13 | 0.805 | 1.398 | 5.021 | 4.831 | 2.772 | 1.26 |
| 2014-03-14 | 0.805 | 1.398 | 5.021 | 4.831 | 2.772 | 1.26 |
| 2014-03-15 | 0.805 | 1.398 | 5.021 | 4.831 | 2.772 | 1.26 |
| 2014-03-16 | 0.805 | 1.398 | 5.021 | 4.831 | 2.772 | 1.26 |
| 2014-03-17 | 0.813 | 1.468 | 5.398 | 4.922 | 2.805 | 1.267 |
| 2014-03-18 | 0.786 | 1.429 | 5.346 | 4.834 | 2.768 | 1.252 |
| 2014-03-19 | 0.796 | 1.455 | 5.251 | 4.84 | 2.792 | 1.224 |
| 2014-03-20 | 0.777 | 1.431 | 5.219 | 4.794 | 2.789 | 1.184 |
| 2014-03-21 | 0.777 | 1.431 | 5.219 | 4.794 | 2.789 | 1.184 |
| 2014-03-22 | 0.777 | 1.431 | 5.219 | 4.794 | 2.789 | 1.184 |
| 2014-03-23 | 0.818 | 1.457 | 5.217 | 4.782 | 2.802 | 1.224 |
| 2014-03-24 | 0.804 | 1.459 | 5.225 | 4.8 | 2.814 | 1.21 |
| 2014-03-25 | 0.795 | 1.465 | 5.2 | 4.783 | 2.807 | 1.205 |
| 2014-03-26 | 0.789 | 1.472 | 5.154 | 4.819 | 2.798 | 1.201 |
| 2014-03-27 | 0.834 | 1.513 | 5.178 | 4.809 | 2.824 | 1.206 |
| 2014-03-28 | 0.834 | 1.513 | 5.178 | 4.809 | 2.824 | 1.206 |
| 2014-03-29 | 0.834 | 1.513 | 5.178 | 4.809 | 2.824 | 1.206 |
| 2014-03-30 | 0.834 | 1.525 | 5.205 | 4.851 | 2.861 | 1.238 |
| 2014-03-31 | 0.824 | 1.518 | 5.157 | 4.733 | 2.867 | 1.231 |
| 2014-04-01 | 0.853 | 1.548 | 5.146 | 4.739 | 2.853 | 1.254 |
| 2014-04-02 | 0.868 | 1.568 | 5.163 | 4.749 | 2.852 | 1.269 |
| 2014-04-03 | 0.863 | 1.574 | 5.216 | 4.715 | 2.854 | 1.286 |
| 2014-04-04 | 0.863 | 1.574 | 5.216 | 4.715 | 2.854 | 1.286 |
| 2014-04-05 | 0.863 | 1.574 | 5.216 | 4.715 | 2.854 | 1.286 |
| 2014-04-06 | 0.854 | 1.549 | 5.2 | 4.681 | 2.867 | 1.297 |
| 2014-04-07 | 0.849 | 1.513 | 5.153 | 4.696 | 2.871 | 1.297 |
| 2014-04-08 | 0.851 | 1.504 | 5.093 | 4.627 | 2.85 | 1.303 |
| 2014-04-09 | 0.8 | 1.443 | 4.98 | 4.536 | 2.759 | 1.205 |
| 2014-04-10 | 0.802 | 1.447 | 4.915 | 4.481 | 2.731 | 1.213 |
| 2014-04-11 | 0.802 | 1.447 | 4.915 | 4.481 | 2.731 | 1.213 |
| 2014-04-12 | 0.802 | 1.447 | 4.915 | 4.481 | 2.731 | 1.213 |
| 2014-04-13 | 0.891 | 1.601 | 5.105 | 4.562 | 2.858 | 1.372 |
| 2014-04-14 | 0.891 | 1.601 | 5.105 | 4.562 | 2.858 | 1.372 |
| 2014-04-15 | 0.891 | 1.601 | 5.105 | 4.562 | 2.858 | 1.372 |
| 2014-04-16 | 0.904 | 1.56 | 5.048 | 4.549 | 2.838 | 1.361 |
| 2014-04-17 | 0.935 | 1.574 | 5.084 | 4.599 | 2.856 | 1.362 |
| 2014-04-18 | 0.935 | 1.574 | 5.084 | 4.599 | 2.856 | 1.362 |
| 2014-04-19 | 0.935 | 1.574 | 5.084 | 4.599 | 2.856 | 1.362 |
| 2014-04-20 | 0.935 | 1.574 | 5.084 | 4.599 | 2.856 | 1.362 |
| 2014-04-21 | 0.935 | 1.574 | 5.084 | 4.599 | 2.856 | 1.362 |
| 2014-04-22 | 0.915 | 1.576 | 5.104 | 4.635 | 2.839 | 1.324 |
| 2014-04-23 | 0.924 | 1.577 | 5.064 | 4.604 | 2.858 | 1.34 |
| 2014-04-24 | 0.922 | 1.586 | 4.991 | 4.586 | 2.848 | 1.343 |
| 2014-04-25 | 0.922 | 1.586 | 4.991 | 4.586 | 2.848 | 1.343 |
| 2014-04-26 | 0.922 | 1.586 | 4.991 | 4.586 | 2.848 | 1.343 |
| 2014-04-27 | 0.945 | 1.596 | 4.997 | 4.644 | 2.879 | 1.342 |
| 2014-04-28 | 0.909 | 1.561 | 5.04 | 4.622 | 2.877 | 1.33 |
| 2014-04-29 | 0.885 | 1.544 | 5.021 | 4.553 | 2.84 | 1.314 |
| 2014-04-30 | 0.866 | 1.522 | 5.013 | 4.566 | 2.818 | 1.343 |
| 2014-05-01 | 0.849 | 1.486 | 4.948 | 4.561 | 2.788 | 1.346 |
| 2014-05-02 | 0.849 | 1.486 | 4.948 | 4.561 | 2.788 | 1.346 |
| 2014-05-03 | 0.849 | 1.486 | 4.948 | 4.561 | 2.788 | 1.346 |
| 2014-05-04 | 0.907 | 1.628 | 4.965 | 4.645 | 2.792 | 1.305 |
| 2014-05-05 | 0.907 | 1.628 | 4.965 | 4.645 | 2.792 | 1.305 |
| 2014-05-06 | 0.907 | 1.628 | 4.965 | 4.645 | 2.792 | 1.305 |
| 2014-05-07 | 0.914 | 1.6 | 5.011 | 4.471 | 2.813 | 1.31 |
| 2014-05-08 | 0.905 | 1.577 | 4.971 | 4.44 | 2.832 | 1.31 |
| 2014-05-09 | 0.905 | 1.577 | 4.971 | 4.44 | 2.832 | 1.31 |
| 2014-05-10 | 0.905 | 1.577 | 4.971 | 4.44 | 2.832 | 1.31 |
| 2014-05-11 | 0.917 | 1.577 | 4.981 | 4.473 | 2.83 | 1.312 |
| 2014-05-12 | 0.889 | 1.587 | 4.901 | 4.407 | 2.79 | 1.242 |
| 2014-05-13 | 0.877 | 1.592 | 4.918 | 4.368 | 2.824 | 1.252 |
| 2014-05-14 | 0.899 | 1.602 | 4.93 | 4.348 | 2.829 | 1.295 |
| 2014-05-15 | 0.83 | 1.487 | 4.907 | 4.241 | 2.778 | 1.289 |
| 2014-05-16 | 0.83 | 1.487 | 4.907 | 4.241 | 2.778 | 1.289 |
| 2014-05-17 | 0.83 | 1.487 | 4.907 | 4.241 | 2.778 | 1.289 |
| 2014-05-18 | 0.782 | 1.366 | 4.728 | 4.032 | 2.652 | 1.17 |
| 2014-05-19 | 0.788 | 1.36 | 4.641 | 4.045 | 2.631 | 1.133 |
| 2014-05-20 | 0.816 | 1.424 | 4.644 | 4.075 | 2.647 | 1.142 |
| 2014-05-21 | 0.832 | 1.471 | 4.571 | 4.115 | 2.66 | 1.107 |
| 2014-05-22 | 0.836 | 1.477 | 4.471 | 4.074 | 2.647 | 1.085 |
| 2014-05-23 | 0.836 | 1.477 | 4.471 | 4.074 | 2.647 | 1.085 |
| 2014-05-24 | 0.836 | 1.477 | 4.471 | 4.074 | 2.647 | 1.085 |
| 2014-05-25 | 0.837 | 1.506 | 4.433 | 4.108 | 2.66 | 1.105 |
| 2014-05-26 | 0.839 | 1.512 | 4.335 | 4.11 | 2.641 | 1.099 |
| 2014-05-27 | 0.868 | 1.576 | 4.306 | 4.147 | 2.402 | 1.085 |
| 2014-05-28 | 0.891 | 1.668 | 4.309 | 4.194 | 2.414 | 1.135 |
| 2014-05-29 | 0.861 | 1.663 | 4.267 | 4.222 | 2.404 | 1.139 |
| 2014-05-30 | 0.861 | 1.663 | 4.267 | 4.222 | 2.404 | 1.139 |
| 2014-05-31 | 0.861 | 1.663 | 4.267 | 4.222 | 2.404 | 1.139 |
| 2014-06-01 | 0.902 | 1.694 | 4.275 | 4.726 | 2.436 | 1.165 |
| 2014-06-02 | 0.906 | 1.698 | 4.333 | 4.526 | 2.453 | 1.168 |
| 2014-06-03 | 0.906 | 1.698 | 4.333 | 4.526 | 2.453 | 1.168 |
| 2014-06-04 | 0.906 | 1.698 | 4.333 | 4.526 | 2.453 | 1.168 |
| 2014-06-05 | 0.945 | 1.714 | 4.41 | 4.552 | 2.505 | 1.198 |
| 2014-06-06 | 0.945 | 1.714 | 4.41 | 4.552 | 2.505 | 1.198 |
| 2014-06-07 | 0.945 | 1.714 | 4.41 | 4.552 | 2.505 | 1.198 |
| 2014-06-08 | 0.987 | 1.716 | 4.388 | 4.594 | 2.51 | 1.232 |
| 2014-06-09 | 0.971 | 1.758 | 4.416 | 4.65 | 2.547 | 1.247 |
| 2014-06-10 | 0.997 | 1.815 | 4.428 | 4.643 | 2.551 | 1.287 |
| 2014-06-11 | 1.009 | 1.852 | 4.386 | 4.635 | 2.54 | 1.296 |
| 2014-06-12 | 1.021 | 1.847 | 4.383 | 4.623 | 2.55 | 1.303 |
| 2014-06-13 | 1.021 | 1.847 | 4.383 | 4.623 | 2.55 | 1.303 |
| 2014-06-14 | 1.021 | 1.847 | 4.383 | 4.623 | 2.55 | 1.303 |
| 2014-06-15 | 1.024 | 1.866 | 4.397 | 4.633 | 2.557 | 1.285 |
| 2014-06-16 | 1.031 | 1.928 | 4.398 | 4.719 | 2.568 | 1.355 |
| 2014-06-17 | 1.008 | 1.947 | 4.425 | 4.793 | 2.547 | 1.304 |
| 2014-06-18 | 0.991 | 1.917 | 4.371 | 4.763 | 2.546 | 1.287 |
| 2014-06-19 | 0.985 | 1.894 | 4.326 | 4.74 | 2.541 | 1.267 |
| 2014-06-20 | 0.985 | 1.894 | 4.326 | 4.74 | 2.541 | 1.267 |
| 2014-06-21 | 0.985 | 1.894 | 4.326 | 4.74 | 2.541 | 1.267 |
| 2014-06-22 | 1.024 | 1.887 | 4.327 | 4.773 | 2.544 | 1.269 |
| 2014-06-23 | 1.019 | 1.899 | 4.338 | 4.775 | 2.535 | 1.255 |
| 2014-06-24 | 1.087 | 1.977 | 4.371 | 4.85 | 2.575 | 1.281 |
| 2014-06-25 | 1.096 | 1.963 | 4.402 | 4.875 | 2.608 | 1.3 |
| 2014-06-26 | 1.126 | 2.017 | 4.41 | 4.935 | 2.642 | 1.321 |
| 2014-06-27 | 1.126 | 2.017 | 4.41 | 4.935 | 2.642 | 1.321 |
| 2014-06-28 | 1.126 | 2.017 | 4.41 | 4.935 | 2.642 | 1.321 |
| 2014-06-29 | 1.149 | 2.107 | 4.518 | 5.032 | 2.714 | 1.339 |
| 2014-06-30 | 1.151 | 2.196 | 4.698 | 5.262 | 2.817 | 1.383 |
| 2014-07-01 | 1.141 | 2.176 | 4.699 | 5.349 | 2.826 | 1.38 |
| 2014-07-02 | 1.104 | 2.169 | 4.669 | 5.271 | 2.787 | 1.348 |
| 2014-07-03 | 1.127 | 2.187 | 4.72 | 5.347 | 2.8 | 1.34 |
| 2014-07-04 | 1.127 | 2.187 | 4.72 | 5.347 | 2.8 | 1.34 |
| 2014-07-05 | 1.127 | 2.187 | 4.72 | 5.347 | 2.8 | 1.34 |
| 2014-07-06 | 1.124 | 2.206 | 4.754 | 5.382 | 2.716 | 1.352 |
| 2014-07-07 | 1.218 | 2.154 | 4.936 | 5.612 | 2.812 | 1.39 |
| 2014-07-08 | 1.351 | 2.408 | 5.264 | 5.957 | 3.019 | 1.53 |
| 2014-07-09 | 1.304 | 2.185 | 5.182 | 5.895 | 2.945 | 1.532 |
| 2014-07-10 | 1.209 | 2.099 | 4.969 | 5.808 | 2.87 | 1.526 |
| 2014-07-11 | 1.209 | 2.099 | 4.969 | 5.808 | 2.87 | 1.526 |
| 2014-07-12 | 1.209 | 2.099 | 4.969 | 5.808 | 2.87 | 1.526 |
| 2014-07-13 | 1.119 | 2 | 4.958 | 5.918 | 2.788 | 1.477 |
| 2014-07-14 | 1.113 | 1.975 | 4.958 | 5.958 | 2.763 | 1.459 |
| 2014-07-15 | 1.091 | 1.917 | 4.942 | 5.95 | 2.749 | 1.427 |
| 2014-07-16 | 1.112 | 1.956 | 4.963 | 5.984 | 2.78 | 1.438 |
| 2014-07-17 | 1.092 | 1.935 | 4.915 | 5.965 | 2.762 | 1.431 |
| 2014-07-18 | 1.092 | 1.935 | 4.915 | 5.965 | 2.762 | 1.431 |
| 2014-07-19 | 1.092 | 1.935 | 4.915 | 5.965 | 2.762 | 1.431 |
| 2014-07-20 | 1.134 | 2.017 | 5.053 | 6.059 | 2.829 | 1.453 |
| 2014-07-21 | 1.143 | 2.028 | 5.047 | 6.031 | 2.83 | 1.463 |
| 2014-07-22 | 1.12 | 2.004 | 4.938 | 5.987 | 2.811 | 1.466 |
| 2014-07-23 | 1.081 | 1.941 | 4.865 | 5.846 | 2.757 | 1.441 |
| 2014-07-24 | 1.067 | 1.953 | 4.801 | 5.799 | 2.755 | 1.43 |
| 2014-07-25 | 1.067 | 1.953 | 4.801 | 5.799 | 2.755 | 1.43 |
| 2014-07-26 | 1.067 | 1.953 | 4.801 | 5.799 | 2.755 | 1.43 |
| 2014-07-27 | 1.025 | 1.964 | 4.856 | 5.764 | 2.773 | 1.44 |
| 2014-07-28 | 1.018 | 1.942 | 4.857 | 5.75 | 2.77 | 1.46 |
| 2014-07-29 | 0.978 | 1.913 | 4.846 | 5.759 | 2.744 | 1.435 |
| 2014-07-30 | 0.979 | 1.949 | 4.886 | 5.745 | 2.755 | 1.402 |
| 2014-07-31 | 0.989 | 1.957 | 4.858 | 5.691 | 2.753 | 1.378 |
| 2014-08-01 | 0.989 | 1.957 | 4.858 | 5.691 | 2.753 | 1.378 |
| 2014-08-02 | 0.989 | 1.957 | 4.858 | 5.691 | 2.753 | 1.378 |
| 2014-08-03 | 0.92 | 1.868 | 4.84 | 5.654 | 2.719 | 1.403 |
| 2014-08-04 | 0.912 | 1.782 | 4.826 | 5.606 | 2.717 | 1.382 |
| 2014-08-05 | 0.912 | 1.782 | 4.826 | 5.606 | 2.717 | 1.382 |
| 2014-08-06 | 0.924 | 1.798 | 4.833 | 5.557 | 2.691 | 1.338 |
| 2014-08-07 | 0.981 | 1.87 | 4.843 | 5.592 | 2.73 | 1.346 |
| 2014-08-08 | 0.981 | 1.87 | 4.843 | 5.592 | 2.73 | 1.346 |
| 2014-08-09 | 0.981 | 1.87 | 4.843 | 5.592 | 2.73 | 1.346 |
| 2014-08-10 | 0.98 | 1.916 | 4.903 | 5.636 | 2.755 | 1.374 |
| 2014-08-11 | 0.974 | 1.948 | 4.867 | 5.648 | 2.766 | 1.359 |
| 2014-08-12 | 0.982 | 1.96 | 4.826 | 5.681 | 2.777 | 1.364 |
| 2014-08-13 | 0.997 | 1.943 | 4.823 | 5.702 | 2.788 | 1.396 |
| 2014-08-14 | 0.966 | 1.903 | 4.862 | 5.704 | 2.8 | 1.398 |
| 2014-08-15 | 0.966 | 1.903 | 4.862 | 5.704 | 2.8 | 1.398 |
| 2014-08-16 | 0.966 | 1.903 | 4.862 | 5.704 | 2.8 | 1.398 |
| 2014-08-17 | 0.973 | 1.868 | 4.841 | 5.72 | 2.793 | 1.413 |
| 2014-08-18 | 0.991 | 1.886 | 4.859 | 5.658 | 2.774 | 1.367 |
| 2014-08-19 | 1.019 | 1.937 | 4.844 | 5.694 | 2.781 | 1.382 |
| 2014-08-20 | 1.015 | 1.908 | 4.793 | 5.77 | 2.798 | 1.421 |
| 2014-08-21 | 0.99 | 1.875 | 4.57 | 5.715 | 2.792 | 1.429 |
| 2014-08-22 | 0.99 | 1.875 | 4.57 | 5.715 | 2.792 | 1.429 |
| 2014-08-23 | 0.99 | 1.875 | 4.57 | 5.715 | 2.792 | 1.429 |
| 2014-08-24 | 0.968 | 1.835 | 4.564 | 5.738 | 2.792 | 1.418 |
| 2014-08-25 | 0.963 | 1.808 | 4.541 | 5.75 | 2.814 | 1.453 |
| 2014-08-26 | 0.942 | 1.733 | 4.452 | 5.721 | 2.776 | 1.432 |
| 2014-08-27 | 0.892 | 1.679 | 4.34 | 5.629 | 2.718 | 1.384 |
| 2014-08-28 | 0.856 | 1.64 | 4.335 | 5.656 | 2.732 | 1.38 |
| 2014-08-29 | 0.856 | 1.64 | 4.335 | 5.656 | 2.732 | 1.38 |
| 2014-08-30 | 0.856 | 1.64 | 4.335 | 5.656 | 2.732 | 1.38 |
| 2014-08-31 | 0.872 | 1.664 | 4.404 | 5.699 | 2.744 | 1.402 |
| 2014-09-01 | 0.846 | 1.629 | 4.296 | 5.766 | 2.711 | 1.34 |
| 2014-09-02 | 0.828 | 1.602 | 4.25 | 5.793 | 2.638 | 1.28 |
| 2014-09-03 | 0.863 | 1.634 | 4.273 | 5.914 | 2.725 | 1.294 |
| 2014-09-04 | 0.876 | 1.655 | 4.279 | 5.955 | 2.738 | 1.308 |
| 2014-09-05 | 0.876 | 1.655 | 4.279 | 5.955 | 2.738 | 1.308 |
| 2014-09-06 | 0.876 | 1.655 | 4.279 | 5.955 | 2.738 | 1.308 |
| 2014-09-07 | 0.896 | 1.644 | 4.31 | 5.974 | 2.724 | 1.288 |
| 2014-09-08 | 0.937 | 1.677 | 4.325 | 6.041 | 2.742 | 1.32 |
| 2014-09-09 | 0.97 | 1.724 | 4.294 | 6.072 | 2.774 | 1.342 |
| 2014-09-10 | 0.98 | 1.776 | 4.312 | 6.065 | 2.78 | 1.36 |
| 2014-09-11 | 0.972 | 1.797 | 4.195 | 6.084 | 2.773 | 1.388 |
| 2014-09-12 | 0.972 | 1.797 | 4.195 | 6.084 | 2.773 | 1.388 |
| 2014-09-13 | 0.972 | 1.797 | 4.195 | 6.084 | 2.773 | 1.388 |
| 2014-09-14 | 0.985 | 1.8 | 4.247 | 6.217 | 2.792 | 1.387 |
| 2014-09-15 | 1.008 | 1.807 | 4.303 | 6.271 | 2.809 | 1.423 |
| 2014-09-16 | 1.011 | 1.786 | 4.264 | 6.226 | 2.803 | 1.405 |
| 2014-09-17 | 0.998 | 1.788 | 4.235 | 6.228 | 2.812 | 1.409 |
| 2014-09-18 | 0.992 | 1.797 | 4.25 | 6.108 | 2.838 | 1.414 |
| 2014-09-19 | 0.992 | 1.797 | 4.25 | 6.108 | 2.838 | 1.414 |
| 2014-09-20 | 0.992 | 1.797 | 4.25 | 6.108 | 2.838 | 1.414 |
| 2014-09-21 | 0.995 | 1.794 | 4.268 | 6.082 | 2.845 | 1.429 |
| 2014-09-22 | 1.016 | 1.808 | 4.303 | 6.106 | 2.869 | 1.48 |
| 2014-09-23 | 1.004 | 1.806 | 4.251 | 6.116 | 2.875 | 1.487 |
| 2014-09-24 | 1.004 | 1.806 | 4.251 | 6.116 | 2.875 | 1.487 |
| 2014-09-25 | 1.004 | 1.806 | 4.251 | 6.116 | 2.875 | 1.487 |
| 2014-09-26 | 1.004 | 1.806 | 4.251 | 6.116 | 2.875 | 1.487 |
| 2014-09-27 | 1.004 | 1.806 | 4.251 | 6.116 | 2.875 | 1.487 |
| 2014-09-28 | 0.991 | 1.794 | 4.245 | 6.186 | 2.865 | 1.546 |
| 2014-09-29 | 0.991 | 1.799 | 4.249 | 6.211 | 2.867 | 1.533 |
| 2014-09-30 | 0.978 | 1.787 | 4.206 | 6.255 | 2.864 | 1.519 |
| 2014-10-01 | 0.99 | 1.792 | 4.241 | 6.296 | 2.863 | 1.516 |
| 2014-10-02 | 0.981 | 1.81 | 4.24 | 6.393 | 2.87 | 1.495 |
| 2014-10-03 | 0.981 | 1.81 | 4.24 | 6.393 | 2.87 | 1.495 |
| 2014-10-04 | 0.981 | 1.81 | 4.24 | 6.393 | 2.87 | 1.495 |
| 2014-10-05 | 0.965 | 1.803 | 4.181 | 6.373 | 2.832 | 1.476 |
| 2014-10-06 | 0.959 | 1.791 | 4.134 | 6.329 | 2.828 | 1.474 |
| 2014-10-07 | 0.897 | 1.747 | 4.037 | 6.337 | 2.785 | 1.434 |
| 2014-10-08 | 0.897 | 1.747 | 4.037 | 6.337 | 2.785 | 1.434 |
| 2014-10-09 | 0.897 | 1.747 | 4.037 | 6.337 | 2.785 | 1.434 |
| 2014-10-10 | 0.897 | 1.747 | 4.037 | 6.337 | 2.785 | 1.434 |
| 2014-10-11 | 0.897 | 1.747 | 4.037 | 6.337 | 2.785 | 1.434 |
| 2014-10-12 | 0.897 | 1.765 | 4.153 | 6.439 | 2.803 | 1.448 |
| 2014-10-13 | 0.89 | 1.765 | 3.847 | 6.412 | 2.791 | 1.407 |
| 2014-10-14 | 0.933 | 1.911 | 3.989 | 6.536 | 2.82 | 1.409 |
| 2014-10-15 | 0.933 | 1.911 | 3.989 | 6.536 | 2.82 | 1.409 |
| 2014-10-16 | 0.933 | 1.911 | 3.989 | 6.536 | 2.82 | 1.409 |
| 2014-10-17 | 0.933 | 1.911 | 3.989 | 6.536 | 2.82 | 1.409 |
| 2014-10-18 | 0.933 | 1.911 | 3.989 | 6.536 | 2.82 | 1.409 |
| 2014-10-19 | 0.934 | 1.85 | 3.929 | 6.564 | 2.791 | 1.35 |
| 2014-10-20 | 0.906 | 1.795 | 3.93 | 6.593 | 2.78 | 1.319 |
| 2014-10-21 | 0.926 | 1.872 | 3.963 | 6.678 | 2.83 | 1.343 |
| 2014-10-22 | 0.943 | 1.858 | 3.967 | 6.834 | 2.85 | 1.362 |
| 2014-10-23 | 0.913 | 1.809 | 3.972 | 6.915 | 2.842 | 1.33 |
| 2014-10-24 | 0.913 | 1.809 | 3.972 | 6.915 | 2.842 | 1.33 |
| 2014-10-25 | 0.913 | 1.809 | 3.972 | 6.915 | 2.842 | 1.33 |
| 2014-10-26 | 0.896 | 1.733 | 3.988 | 6.818 | 2.838 | 1.378 |
| 2014-10-27 | 0.896 | 1.735 | 3.979 | 6.776 | 2.832 | 1.372 |
| 2014-10-28 | 0.884 | 1.765 | 4.004 | 6.79 | 2.837 | 1.35 |
| 2014-10-29 | 0.875 | 1.726 | 3.973 | 6.651 | 2.833 | 1.347 |
| 2014-10-30 | 0.896 | 1.727 | 4.011 | 6.655 | 2.87 | 1.391 |
| 2014-10-31 | 0.896 | 1.727 | 4.011 | 6.655 | 2.87 | 1.391 |
| 2014-11-01 | 0.896 | 1.727 | 4.011 | 6.655 | 2.87 | 1.391 |
| 2014-11-02 | 0.958 | 1.938 | 4.019 | 6.756 | 2.899 | 1.401 |
| 2014-11-03 | 0.872 | 1.775 | 3.946 | 6.638 | 2.811 | 1.346 |
| 2014-11-04 | 0.861 | 1.732 | 3.88 | 6.625 | 2.781 | 1.366 |
| 2014-11-05 | 0.796 | 1.641 | 3.777 | 6.479 | 2.732 | 1.312 |
| 2014-11-06 | 0.811 | 1.648 | 3.798 | 6.507 | 2.724 | 1.264 |
| 2014-11-07 | 0.811 | 1.648 | 3.798 | 6.507 | 2.724 | 1.264 |
| 2014-11-08 | 0.811 | 1.648 | 3.798 | 6.507 | 2.724 | 1.264 |
| 2014-11-09 | 0.767 | 1.533 | 3.745 | 6.441 | 2.698 | 1.212 |
| 2014-11-10 | 0.801 | 1.61 | 3.746 | 7.003 | 2.75 | 1.205 |
| 2014-11-11 | 0.754 | 1.624 | 3.768 | 7.574 | 2.751 | 1.176 |
| 2014-11-12 | 0.86 | 1.672 | 3.8 | 7.712 | 2.838 | 1.219 |
| 2014-11-13 | 0.869 | 1.664 | 3.913 | 7.684 | 2.887 | 1.244 |
| 2014-11-14 | 0.869 | 1.664 | 3.913 | 7.684 | 2.887 | 1.244 |
| 2014-11-15 | 0.869 | 1.664 | 3.913 | 7.684 | 2.887 | 1.244 |
| 2014-11-16 | 0.848 | 1.597 | 3.859 | 7.707 | 2.882 | 1.267 |
| 2014-11-17 | 0.79 | 1.543 | 3.81 | 7.731 | 2.831 | 1.178 |
| 2014-11-18 | 0.721 | 1.444 | 3.769 | 7.665 | 2.81 | 1.12 |
| 2014-11-19 | 0.779 | 1.496 | 3.785 | 7.731 | 2.791 | 1.134 |
| 2014-11-20 | 0.819 | 1.576 | 3.827 | 7.951 | 2.859 | 1.143 |
| 2014-11-21 | 0.819 | 1.576 | 3.827 | 7.951 | 2.859 | 1.143 |
| 2014-11-22 | 0.819 | 1.576 | 3.827 | 7.951 | 2.859 | 1.143 |
| 2014-11-23 | 0.846 | 1.647 | 4.367 | 8.67 | 3.063 | 1.18 |
| 2014-11-24 | 0.888 | 1.753 | 4.21 | 8.742 | 3.131 | 1.252 |
| 2014-11-25 | 0.874 | 1.755 | 4.122 | 8.774 | 3.1 | 1.233 |
| 2014-11-26 | 0.856 | 1.668 | 3.985 | 8.638 | 3.046 | 1.234 |
| 2014-11-27 | 0.814 | 1.617 | 3.888 | 8.612 | 3.007 | 1.238 |
| 2014-11-28 | 0.814 | 1.617 | 3.888 | 8.612 | 3.007 | 1.238 |
| 2014-11-29 | 0.814 | 1.617 | 3.888 | 8.612 | 3.007 | 1.238 |
| 2014-11-30 | 0.845 | 1.701 | 4 | 8.835 | 3.147 | 1.278 |
| 2014-12-01 | 0.861 | 1.82 | 4.138 | 8.992 | 3.261 | 1.261 |
| 2014-12-02 | 0.98 | 2.03 | 4.467 | 9.276 | 3.412 | 1.418 |
| 2014-12-03 | 0.964 | 2.062 | 4.666 | 9.404 | 3.487 | 1.455 |
| 2014-12-04 | 0.982 | 2.078 | 4.687 | 9.466 | 3.504 | 1.488 |
| 2014-12-05 | 0.982 | 2.078 | 4.687 | 9.466 | 3.504 | 1.488 |
| 2014-12-06 | 0.982 | 2.078 | 4.687 | 9.466 | 3.504 | 1.488 |
| 2014-12-07 | 0.991 | 2.133 | 4.84 | 9.434 | 3.632 | 1.494 |
| 2014-12-08 | 0.994 | 2.021 | 4.895 | 9.419 | 3.713 | 1.556 |
| 2014-12-09 | 0.938 | 1.941 | 4.806 | 9.435 | 3.693 | 1.508 |
| 2014-12-10 | 0.875 | 2.049 | 4.691 | 9.515 | 3.646 | 1.453 |
| 2014-12-11 | 0.792 | 1.881 | 4.639 | 9.507 | 3.683 | 1.391 |
| 2014-12-12 | 0.792 | 1.881 | 4.639 | 9.507 | 3.683 | 1.391 |
| 2014-12-13 | 0.792 | 1.881 | 4.639 | 9.507 | 3.683 | 1.391 |
| 2014-12-14 | 0.885 | 2.007 | 4.692 | 9.828 | 3.939 | 1.465 |
| 2014-12-15 | 0.895 | 1.979 | 4.611 | 9.75 | 3.943 | 1.418 |
| 2014-12-16 | 1.142 | 2.512 | 4.944 | 10.37 | 4.652 | 1.609 |
| 2014-12-17 | 0.916 | 2.249 | 4.735 | 9.955 | 4.234 | 1.55 |
| 2014-12-18 | 0.851 | 1.949 | 4.218 | 9.444 | 3.902 | 1.408 |
| 2014-12-19 | 0.851 | 1.949 | 4.218 | 9.444 | 3.902 | 1.408 |
| 2014-12-20 | 0.851 | 1.949 | 4.218 | 9.444 | 3.902 | 1.408 |
| 2014-12-21 | 0.882 | 2.001 | 4.19 | 9.193 | 4.098 | 1.428 |
| 2014-12-22 | 0.843 | 1.877 | 4.092 | 9.216 | 3.97 | 1.404 |
| 2014-12-23 | 0.829 | 1.895 | 4.146 | 9.498 | 3.949 | 1.356 |
| 2014-12-24 | 0.849 | 1.983 | 4.199 | 9.678 | 4.026 | 1.335 |
| 2014-12-25 | 0.86 | 2.055 | 4.223 | 9.983 | 4.099 | 1.327 |
| 2014-12-26 | 0.86 | 2.055 | 4.223 | 9.983 | 4.099 | 1.327 |
| 2014-12-27 | 0.86 | 2.055 | 4.223 | 9.983 | 4.099 | 1.327 |
| 2014-12-28 | 0.91 | 2.143 | 4.347 | 10.127 | 4.209 | 1.395 |
| 2014-12-29 | 0.909 | 2.194 | 4.459 | 10.15 | 4.265 | 1.404 |
| 2014-12-30 | 0.894 | 2.183 | 4.485 | 9.925 | 4.244 | 1.366 |
| 2014-12-31 | 0.803 | 1.959 | 4.238 | 9.544 | 4.038 | 1.293 |
| 2015-01-01 | 0.83 | 1.95 | 4.023 | 9.444 | 3.874 | 1.341 |
| 2015-01-02 | 0.83 | 1.95 | 4.023 | 9.444 | 3.874 | 1.341 |
| 2015-01-03 | 0.83 | 1.95 | 4.023 | 9.444 | 3.874 | 1.341 |
| 2015-01-04 | 0.784 | 1.909 | 3.953 | 9.416 | 3.786 | 1.318 |
| 2015-01-05 | 0.865 | 2.061 | 4.137 | 9.656 | 3.985 | 1.369 |
| 2015-01-06 | 0.858 | 2.138 | 4.184 | 7.067 | 4.065 | 1.328 |
| 2015-01-07 | 0.845 | 2.379 | 4.424 | 7.205 | 4.17 | 1.358 |
| 2015-01-08 | 0.794 | 2.484 | 4.361 | 6.924 | 4.055 | 1.363 |
| 2015-01-09 | 0.794 | 2.484 | 4.361 | 6.924 | 4.055 | 1.363 |
| 2015-01-10 | 0.794 | 2.484 | 4.361 | 6.924 | 4.055 | 1.363 |
| 2015-01-11 | 0.788 | 2.369 | 4.116 | 6.62 | 4.01 | 1.279 |
| 2015-01-12 | 0.784 | 2.292 | 3.969 | 7.43 | 3.849 | 1.289 |
| 2015-01-13 | 0.757 | 2.348 | 4.007 | 7.537 | 3.878 | 1.255 |
| 2015-01-14 | 0.809 | 2.411 | 4.114 | 7.515 | 3.919 | 1.306 |
| 2015-01-15 | 0.849 | 2.398 | 4.177 | 7.42 | 3.984 | 1.432 |
| 2015-01-16 | 0.849 | 2.398 | 4.177 | 7.42 | 3.984 | 1.432 |
| 2015-01-17 | 0.849 | 2.398 | 4.177 | 7.42 | 3.984 | 1.432 |
| 2015-01-18 | 0.874 | 2.56 | 4.246 | 8.145 | 4.059 | 1.464 |
| 2015-01-19 | 0.907 | 3.019 | 4.376 | 8.533 | 4.119 | 1.507 |
| 2015-01-20 | 0.877 | 3.052 | 4.737 | 8.396 | 4.095 | 1.468 |
| 2015-01-21 | 0.787 | 2.844 | 4.6 | 8.025 | 3.988 | 1.403 |
| 2015-01-22 | 0.678 | 2.622 | 4.512 | 7.84 | 3.84 | 1.381 |
| 2015-01-23 | 0.678 | 2.622 | 4.512 | 7.84 | 3.84 | 1.381 |
| 2015-01-24 | 0.678 | 2.622 | 4.512 | 7.84 | 3.84 | 1.381 |
| 2015-01-25 | 0.71 | 2.529 | 4.51 | 7.885 | 3.92 | 1.435 |
| 2015-01-26 | 0.735 | 2.504 | 4.507 | 7.912 | 3.924 | 1.393 |
| 2015-01-27 | 0.809 | 2.625 | 4.586 | 7.829 | 4.011 | 1.43 |
| 2015-01-28 | 0.861 | 2.762 | 4.517 | 7.812 | 4.075 | 1.428 |
| 2015-01-29 | 0.877 | 2.734 | 4.554 | 7.827 | 4.111 | 1.534 |
| 2015-01-30 | 0.877 | 2.734 | 4.554 | 7.827 | 4.111 | 1.534 |
| 2015-01-31 | 0.877 | 2.734 | 4.554 | 7.827 | 4.111 | 1.534 |
| 2015-02-01 | 0.864 | 2.707 | 4.473 | 7.734 | 4.021 | 1.548 |
| 2015-02-02 | 0.834 | 2.646 | 4.38 | 7.619 | 3.932 | 1.521 |
| 2015-02-03 | 0.909 | 2.677 | 4.391 | 7.639 | 4.021 | 1.547 |
| 2015-02-04 | 0.822 | 2.579 | 4.317 | 7.644 | 3.972 | 1.519 |
| 2015-02-05 | 0.848 | 2.611 | 4.312 | 7.745 | 4.003 | 1.512 |
| 2015-02-06 | 0.848 | 2.611 | 4.312 | 7.745 | 4.003 | 1.512 |
| 2015-02-07 | 0.848 | 2.611 | 4.312 | 7.745 | 4.003 | 1.512 |
| 2015-02-08 | 0.887 | 2.637 | 4.341 | 7.72 | 4.048 | 1.484 |
| 2015-02-09 | 0.913 | 2.679 | 4.36 | 7.792 | 4.097 | 1.519 |
| 2015-02-10 | 0.906 | 2.649 | 4.385 | 7.695 | 4.085 | 1.471 |
| 2015-02-11 | 0.889 | 2.605 | 4.385 | 7.635 | 4.101 | 1.514 |
| 2015-02-12 | 0.916 | 2.578 | 4.363 | 7.519 | 4.008 | 1.555 |
| 2015-02-13 | 0.916 | 2.578 | 4.363 | 7.519 | 4.008 | 1.555 |
| 2015-02-14 | 0.916 | 2.578 | 4.363 | 7.519 | 4.008 | 1.555 |
| 2015-02-15 | 0.833 | 2.462 | 4.219 | 7.421 | 3.801 | 1.496 |
| 2015-02-16 | 0.829 | 2.393 | 4.211 | 7.41 | 3.764 | 1.492 |
| 2015-02-17 | 0.824 | 2.412 | 4.177 | 7.404 | 3.717 | 1.407 |
| 2015-02-18 | 0.82 | 2.468 | 4.174 | 7.457 | 3.727 | 1.383 |
| 2015-02-19 | 0.851 | 2.467 | 4.117 | 7.485 | 3.721 | 1.372 |
| 2015-02-20 | 0.851 | 2.467 | 4.117 | 7.485 | 3.721 | 1.372 |
| 2015-02-21 | 0.851 | 2.467 | 4.117 | 7.485 | 3.721 | 1.372 |
| 2015-02-22 | 0.839 | 2.421 | 4.115 | 7.464 | 3.696 | 1.395 |
| 2015-02-23 | 0.837 | 2.374 | 4.126 | 7.413 | 3.652 | 1.486 |
| 2015-02-24 | 0.854 | 2.388 | 4.134 | 7.384 | 3.627 | 1.456 |
| 2015-02-25 | 0.872 | 2.35 | 4.078 | 7.338 | 3.574 | 1.49 |
| 2015-02-26 | 0.858 | 2.334 | 4.029 | 7.344 | 3.614 | 1.437 |
| 2015-02-27 | 0.858 | 2.334 | 4.029 | 7.344 | 3.614 | 1.437 |
| 2015-02-28 | 0.858 | 2.334 | 4.029 | 7.344 | 3.614 | 1.437 |
| 2015-03-01 | 0.853 | 2.311 | 4.019 | 7.672 | 3.579 | 1.457 |
| 2015-03-02 | 0.85 | 2.295 | 4.025 | 7.722 | 3.609 | 1.429 |
| 2015-03-03 | 0.846 | 2.342 | 4.016 | 7.695 | 3.641 | 1.428 |
| 2015-03-04 | 0.748 | 2.228 | 3.99 | 7.637 | 3.575 | 1.354 |
| 2015-03-05 | 0.748 | 2.228 | 3.99 | 7.637 | 3.575 | 1.354 |
| 2015-03-06 | 0.748 | 2.228 | 3.99 | 7.637 | 3.575 | 1.354 |
| 2015-03-07 | 0.748 | 2.228 | 3.99 | 7.637 | 3.575 | 1.354 |
| 2015-03-08 | 0.828 | 2.337 | 4.017 | 7.664 | 3.678 | 1.367 |
| 2015-03-09 | 0.847 | 2.349 | 4.016 | 7.67 | 3.68 | 1.399 |
| 2015-03-10 | 0.864 | 2.349 | 3.993 | 7.655 | 3.697 | 1.406 |
| 2015-03-11 | 0.865 | 2.377 | 3.959 | 7.644 | 3.69 | 1.401 |
| 2015-03-12 | 0.895 | 2.372 | 3.933 | 7.652 | 3.684 | 1.341 |
| 2015-03-13 | 0.895 | 2.372 | 3.933 | 7.652 | 3.684 | 1.341 |
| 2015-03-14 | 0.895 | 2.372 | 3.933 | 7.652 | 3.684 | 1.341 |
| 2015-03-15 | 0.871 | 2.464 | 3.946 | 7.732 | 3.695 | 1.292 |
| 2015-03-16 | 0.814 | 2.342 | 3.912 | 7.723 | 3.639 | 1.273 |
| 2015-03-17 | 0.814 | 2.342 | 3.912 | 7.723 | 3.639 | 1.273 |
| 2015-03-18 | 0.742 | 2.209 | 3.842 | 7.629 | 3.511 | 1.257 |
| 2015-03-19 | 0.76 | 2.183 | 3.741 | 7.468 | 3.455 | 1.267 |
| 2015-03-20 | 0.76 | 2.183 | 3.741 | 7.468 | 3.455 | 1.267 |
| 2015-03-21 | 0.76 | 2.183 | 3.741 | 7.468 | 3.455 | 1.267 |
| 2015-03-22 | 0.79 | 2.161 | 3.801 | 7.569 | 3.485 | 1.314 |
| 2015-03-23 | 0.849 | 2.219 | 3.863 | 7.634 | 3.548 | 1.295 |
| 2015-03-24 | 0.847 | 2.203 | 3.853 | 7.606 | 3.567 | 1.312 |
| 2015-03-25 | 0.826 | 2.182 | 3.826 | 7.646 | 3.56 | 1.283 |
| 2015-03-26 | 0.892 | 2.286 | 3.863 | 7.789 | 3.616 | 1.294 |
| 2015-03-27 | 0.892 | 2.286 | 3.863 | 7.789 | 3.616 | 1.294 |
| 2015-03-28 | 0.892 | 2.286 | 3.863 | 7.789 | 3.616 | 1.294 |
| 2015-03-29 | 0.872 | 2.233 | 3.837 | 7.777 | 3.596 | 1.276 |
| 2015-03-30 | 0.897 | 2.225 | 3.852 | 7.878 | 3.655 | 1.326 |
| 2015-03-31 | 0.897 | 2.213 | 3.849 | 7.934 | 3.635 | 1.322 |
| 2015-04-01 | 0.889 | 2.165 | 3.876 | 7.946 | 3.655 | 1.337 |
| 2015-04-02 | 0.916 | 2.19 | 3.869 | 8.01 | 3.705 | 1.342 |
| 2015-04-03 | 0.916 | 2.19 | 3.869 | 8.01 | 3.705 | 1.342 |
| 2015-04-04 | 0.916 | 2.19 | 3.869 | 8.01 | 3.705 | 1.342 |
| 2015-04-05 | 0.878 | 2.137 | 3.843 | 8.044 | 3.652 | 1.349 |
| 2015-04-06 | 0.868 | 2.098 | 3.829 | 7.933 | 3.622 | 1.356 |
| 2015-04-07 | 0.866 | 2.087 | 3.834 | 7.856 | 3.628 | 1.338 |
| 2015-04-08 | 0.874 | 2.115 | 3.847 | 7.917 | 3.638 | 1.286 |
| 2015-04-09 | 0.874 | 2.115 | 3.847 | 7.917 | 3.638 | 1.286 |
| 2015-04-10 | 0.874 | 2.115 | 3.847 | 7.917 | 3.638 | 1.286 |
| 2015-04-11 | 0.874 | 2.115 | 3.847 | 7.917 | 3.638 | 1.286 |
| 2015-04-12 | 0.903 | 2.175 | 3.842 | 7.993 | 3.619 | 1.3 |
| 2015-04-13 | 0.919 | 2.192 | 3.812 | 8.041 | 3.633 | 1.331 |
| 2015-04-14 | 0.964 | 2.266 | 3.825 | 8.189 | 3.704 | 1.422 |
| 2015-04-15 | 0.949 | 2.215 | 3.804 | 8.177 | 3.657 | 1.418 |
| 2015-04-16 | 0.911 | 2.236 | 3.733 | 8.135 | 3.588 | 1.33 |
| 2015-04-17 | 0.911 | 2.236 | 3.733 | 8.135 | 3.588 | 1.33 |
| 2015-04-18 | 0.911 | 2.236 | 3.733 | 8.135 | 3.588 | 1.33 |
| 2015-04-19 | 0.944 | 2.264 | 3.805 | 8.316 | 3.644 | 1.339 |
| 2015-04-20 | 0.944 | 2.256 | 3.802 | 8.33 | 3.632 | 1.303 |
| 2015-04-21 | 0.931 | 2.302 | 3.781 | 8.357 | 3.636 | 1.31 |
| 2015-04-22 | 0.931 | 2.302 | 3.781 | 8.357 | 3.636 | 1.31 |
| 2015-04-23 | 0.931 | 2.302 | 3.781 | 8.357 | 3.636 | 1.31 |
| 2015-04-24 | 0.931 | 2.302 | 3.781 | 8.357 | 3.636 | 1.31 |
| 2015-04-25 | 0.931 | 2.302 | 3.781 | 8.357 | 3.636 | 1.31 |
| 2015-04-26 | 0.914 | 2.292 | 3.713 | 8.45 | 3.656 | 1.308 |
| 2015-04-27 | 0.916 | 2.318 | 3.764 | 8.527 | 3.669 | 1.297 |
| 2015-04-28 | 0.906 | 2.375 | 3.776 | 8.608 | 3.716 | 1.4 |
| 2015-04-29 | 0.991 | 2.563 | 3.792 | 8.738 | 3.801 | 1.456 |
| 2015-04-30 | 0.955 | 2.582 | 3.787 | 8.746 | 3.804 | 1.441 |
| 2015-05-01 | 0.955 | 2.582 | 3.787 | 8.746 | 3.804 | 1.441 |
| 2015-05-02 | 0.955 | 2.582 | 3.787 | 8.746 | 3.804 | 1.441 |
| 2015-05-03 | 0.98 | 2.649 | 3.795 | 8.891 | 3.867 | 1.467 |
| 2015-05-04 | 0.978 | 2.628 | 3.827 | 8.933 | 3.874 | 1.515 |
| 2015-05-05 | 0.958 | 2.594 | 3.801 | 8.995 | 3.884 | 1.475 |
| 2015-05-06 | 0.976 | 2.667 | 3.835 | 9.087 | 3.945 | 1.478 |
| 2015-05-07 | 0.986 | 2.701 | 3.865 | 9.025 | 3.996 | 1.483 |
| 2015-05-08 | 0.986 | 2.701 | 3.865 | 9.025 | 3.996 | 1.483 |
| 2015-05-09 | 0.986 | 2.701 | 3.865 | 9.025 | 3.996 | 1.483 |
| 2015-05-10 | 0.946 | 2.629 | 3.833 | 8.845 | 3.96 | 1.512 |
| 2015-05-11 | 0.934 | 2.584 | 3.806 | 8.834 | 3.926 | 1.482 |
| 2015-05-12 | 0.966 | 2.635 | 3.882 | 8.839 | 3.948 | 1.52 |
| 2015-05-13 | 0.99 | 2.683 | 3.843 | 8.7 | 3.941 | 1.558 |
| 2015-05-14 | 1 | 2.734 | 3.765 | 8.615 | 3.954 | 1.6 |
| 2015-05-15 | 1 | 2.734 | 3.765 | 8.615 | 3.954 | 1.6 |
| 2015-05-16 | 1 | 2.734 | 3.765 | 8.615 | 3.954 | 1.6 |
| 2015-05-17 | 0.928 | 2.691 | 3.685 | 8.55 | 3.91 | 1.608 |
| 2015-05-18 | 0.906 | 2.698 | 3.652 | 8.504 | 3.877 | 1.516 |
| 2015-05-19 | 0.871 | 2.632 | 3.562 | 8.275 | 3.819 | 1.447 |
| 2015-05-20 | 0.873 | 2.589 | 3.565 | 8.202 | 3.791 | 1.445 |
| 2015-05-21 | 0.858 | 2.541 | 3.528 | 8.14 | 3.783 | 1.429 |
| 2015-05-22 | 0.858 | 2.541 | 3.528 | 8.14 | 3.783 | 1.429 |
| 2015-05-23 | 0.858 | 2.541 | 3.528 | 8.14 | 3.783 | 1.429 |
| 2015-05-24 | 0.858 | 2.541 | 3.528 | 8.14 | 3.783 | 1.429 |
| 2015-05-25 | 0.892 | 2.58 | 3.506 | 8.215 | 3.84 | 1.465 |
| 2015-05-26 | 0.893 | 2.608 | 3.54 | 8.184 | 3.894 | 1.452 |
| 2015-05-27 | 0.886 | 2.601 | 3.555 | 8.139 | 3.889 | 1.446 |
| 2015-05-28 | 0.891 | 2.594 | 3.616 | 8.077 | 3.922 | 1.476 |
| 2015-05-29 | 0.891 | 2.594 | 3.616 | 8.077 | 3.922 | 1.476 |
| 2015-05-30 | 0.891 | 2.594 | 3.616 | 8.077 | 3.922 | 1.476 |
| 2015-05-31 | 0.85 | 2.572 | 3.633 | 7.721 | 3.888 | 1.481 |
| 2015-06-01 | 0.834 | 2.537 | 3.577 | 7.686 | 3.874 | 1.435 |
| 2015-06-02 | 0.842 | 2.525 | 3.558 | 7.649 | 3.886 | 1.397 |
| 2015-06-03 | 0.912 | 2.597 | 3.581 | 7.742 | 3.922 | 1.401 |
| 2015-06-04 | 0.957 | 2.668 | 3.647 | 7.767 | 3.978 | 1.404 |
| 2015-06-05 | 0.957 | 2.668 | 3.647 | 7.767 | 3.978 | 1.404 |
| 2015-06-06 | 0.957 | 2.668 | 3.647 | 7.767 | 3.978 | 1.404 |
| 2015-06-07 | 1.006 | 2.71 | 3.609 | 7.866 | 4.037 | 1.472 |
| 2015-06-08 | 1.007 | 2.697 | 3.684 | 7.878 | 4.071 | 1.538 |
| 2015-06-09 | 1.012 | 2.688 | 3.778 | 7.817 | 4.072 | 1.5 |
| 2015-06-10 | 1.075 | 2.764 | 3.841 | 7.94 | 4.183 | 1.567 |
| 2015-06-11 | 1.065 | 2.735 | 3.777 | 7.879 | 4.137 | 1.581 |
| 2015-06-12 | 1.065 | 2.735 | 3.777 | 7.879 | 4.137 | 1.581 |
| 2015-06-13 | 1.065 | 2.735 | 3.777 | 7.879 | 4.137 | 1.581 |
| 2015-06-14 | 1.062 | 2.737 | 3.804 | 7.934 | 4.158 | 1.603 |
| 2015-06-15 | 0.993 | 2.612 | 3.718 | 7.967 | 4.072 | 1.603 |
| 2015-06-16 | 0.993 | 2.623 | 3.703 | 7.914 | 4.004 | 1.598 |
| 2015-06-17 | 0.967 | 2.525 | 3.639 | 7.912 | 3.949 | 1.582 |
| 2015-06-18 | 0.912 | 2.415 | 3.618 | 7.867 | 3.88 | 1.443 |
| 2015-06-19 | 0.912 | 2.415 | 3.618 | 7.867 | 3.88 | 1.443 |
| 2015-06-20 | 0.912 | 2.415 | 3.618 | 7.867 | 3.88 | 1.443 |
| 2015-06-21 | 0.937 | 2.411 | 3.606 | 7.97 | 3.875 | 1.441 |
| 2015-06-22 | 0.945 | 2.385 | 3.557 | 7.935 | 3.849 | 1.374 |
| 2015-06-23 | 0.94 | 2.393 | 3.109 | 7.939 | 3.891 | 1.393 |
| 2015-06-24 | 1.028 | 2.544 | 3.243 | 8.054 | 4.003 | 1.55 |
| 2015-06-25 | 1.031 | 2.539 | 3.207 | 8.02 | 3.964 | 1.592 |
| 2015-06-26 | 1.031 | 2.539 | 3.207 | 8.02 | 3.964 | 1.592 |
| 2015-06-27 | 1.031 | 2.539 | 3.207 | 8.02 | 3.964 | 1.592 |
| 2015-06-28 | 1.153 | 2.695 | 3.335 | 8.181 | 4.155 | 1.7 |
| 2015-06-29 | 1.141 | 2.721 | 3.344 | 8.139 | 4.184 | 1.75 |
| 2015-06-30 | 1.128 | 2.714 | 3.332 | 8.168 | 4.173 | 1.768 |
| 2015-07-01 | 1.061 | 2.577 | 3.386 | 8.08 | 4.042 | 1.696 |
| 2015-07-02 | 1.021 | 2.49 | 3.344 | 8.017 | 3.981 | 1.669 |
| 2015-07-03 | 1.021 | 2.49 | 3.344 | 8.017 | 3.981 | 1.669 |
| 2015-07-04 | 1.021 | 2.49 | 3.344 | 8.017 | 3.981 | 1.669 |
| 2015-07-05 | 1.02 | 2.477 | 3.375 | 8.067 | 3.982 | 1.647 |
| 2015-07-06 | 0.975 | 2.429 | 3.387 | 8.04 | 3.957 | 1.618 |
| 2015-07-07 | 0.95 | 2.39 | 3.435 | 7.975 | 3.937 | 1.625 |
| 2015-07-08 | 0.911 | 2.376 | 3.392 | 7.906 | 3.929 | 1.554 |
| 2015-07-09 | 0.903 | 2.386 | 3.394 | 7.877 | 3.936 | 1.53 |
| 2015-07-10 | 0.903 | 2.386 | 3.394 | 7.877 | 3.936 | 1.53 |
| 2015-07-11 | 0.903 | 2.386 | 3.394 | 7.877 | 3.936 | 1.53 |
| 2015-07-12 | 0.929 | 2.442 | 3.401 | 7.923 | 3.943 | 1.527 |
| 2015-07-13 | 0.961 | 2.439 | 3.412 | 7.941 | 3.951 | 1.569 |
| 2015-07-14 | 0.951 | 2.383 | 3.4 | 7.841 | 3.926 | 1.604 |
| 2015-07-15 | 0.884 | 2.296 | 3.325 | 7.355 | 3.862 | 1.596 |
| 2015-07-16 | 0.875 | 2.223 | 3.285 | 7.495 | 3.802 | 1.56 |
| 2015-07-17 | 0.875 | 2.223 | 3.285 | 7.495 | 3.802 | 1.56 |
| 2015-07-18 | 0.875 | 2.223 | 3.285 | 7.495 | 3.802 | 1.56 |
| 2015-07-19 | 0.822 | 2.233 | 3.276 | 7.418 | 3.773 | 1.53 |
| 2015-07-20 | 0.841 | 2.26 | 3.279 | 7.383 | 3.791 | 1.534 |
| 2015-07-21 | 0.826 | 2.264 | 3.304 | 7.412 | 3.81 | 1.531 |
| 2015-07-22 | 0.876 | 2.329 | 3.327 | 7.468 | 3.851 | 1.529 |
| 2015-07-23 | 0.891 | 2.312 | 3.339 | 7.491 | 3.85 | 1.535 |
| 2015-07-24 | 0.891 | 2.312 | 3.339 | 7.491 | 3.85 | 1.535 |
| 2015-07-25 | 0.891 | 2.312 | 3.339 | 7.491 | 3.85 | 1.535 |
| 2015-07-26 | 0.891 | 2.312 | 3.339 | 7.491 | 3.85 | 1.535 |
| 2015-07-27 | 0.864 | 2.292 | 3.293 | 7.448 | 3.827 | 1.533 |
| 2015-07-28 | 0.836 | 2.293 | 3.232 | 7.414 | 3.825 | 1.519 |
| 2015-07-29 | 0.866 | 2.27 | 3.197 | 7.385 | 3.839 | 1.485 |
| 2015-07-30 | 0.884 | 2.318 | 3.257 | 7.432 | 3.901 | 1.546 |
| 2015-07-31 | 0.884 | 2.318 | 3.257 | 7.432 | 3.901 | 1.546 |
| 2015-08-01 | 0.884 | 2.318 | 3.257 | 7.432 | 3.901 | 1.546 |
| 2015-08-02 | 0.864 | 2.281 | 3.293 | 7.401 | 3.875 | 1.554 |
| 2015-08-03 | 0.798 | 2.179 | 3.259 | 7.341 | 3.786 | 1.46 |
| 2015-08-04 | 0.767 | 2.099 | 3.222 | 7.359 | 3.717 | 1.403 |
| 2015-08-05 | 0.807 | 2.123 | 3.234 | 7.394 | 3.774 | 1.417 |
| 2015-08-06 | 0.791 | 2.156 | 3.259 | 7.407 | 3.774 | 1.43 |
| 2015-08-07 | 0.791 | 2.156 | 3.259 | 7.407 | 3.774 | 1.43 |
| 2015-08-08 | 0.791 | 2.156 | 3.259 | 7.407 | 3.774 | 1.43 |
| 2015-08-09 | 0.74 | 2.043 | 3.21 | 7.354 | 3.725 | 1.377 |
| 2015-08-10 | 0.773 | 2.082 | 3.13 | 7.373 | 3.663 | 1.378 |
| 2015-08-11 | 0.774 | 2.107 | 3.183 | 7.413 | 3.671 | 1.421 |
| 2015-08-12 | 0.797 | 2.147 | 3.264 | 7.53 | 3.754 | 1.482 |
| 2015-08-13 | 0.771 | 2.152 | 3.32 | 7.503 | 3.733 | 1.484 |
| 2015-08-14 | 0.771 | 2.152 | 3.32 | 7.503 | 3.733 | 1.484 |
| 2015-08-15 | 0.771 | 2.152 | 3.32 | 7.503 | 3.733 | 1.484 |
| 2015-08-16 | 0.771 | 2.129 | 3.281 | 7.483 | 3.75 | 1.48 |
| 2015-08-17 | 0.775 | 2.083 | 3.462 | 7.237 | 3.75 | 1.474 |
| 2015-08-18 | 0.691 | 1.974 | 3.463 | 7.042 | 3.68 | 1.405 |
| 2015-08-19 | 0.734 | 1.991 | 3.481 | 6.952 | 3.724 | 1.396 |
| 2015-08-20 | 0.829 | 2.089 | 3.563 | 7.074 | 3.875 | 1.441 |
| 2015-08-21 | 0.829 | 2.089 | 3.563 | 7.074 | 3.875 | 1.441 |
| 2015-08-22 | 0.829 | 2.089 | 3.563 | 7.074 | 3.875 | 1.441 |
| 2015-08-23 | 0.936 | 2.268 | 3.735 | 7.613 | 4.113 | 1.55 |
| 2015-08-24 | 1.034 | 2.489 | 3.913 | 8.088 | 4.309 | 1.626 |
| 2015-08-25 | 0.971 | 2.342 | 3.693 | 7.894 | 4.156 | 1.599 |
| 2015-08-26 | 1.02 | 2.355 | 3.722 | 7.851 | 4.211 | 1.633 |
| 2015-08-27 | 1.011 | 2.312 | 3.674 | 7.844 | 4.218 | 1.655 |
| 2015-08-28 | 1.011 | 2.312 | 3.674 | 7.844 | 4.218 | 1.655 |
| 2015-08-29 | 1.011 | 2.312 | 3.674 | 7.844 | 4.218 | 1.655 |
| 2015-08-30 | 0.912 | 2.207 | 3.626 | 7.786 | 4.029 | 1.614 |
| 2015-08-31 | 0.959 | 2.289 | 3.701 | 7.934 | 4.097 | 1.643 |
| 2015-09-01 | 1.01 | 2.374 | 3.763 | 8.021 | 4.145 | 1.685 |
| 2015-09-02 | 0.943 | 2.284 | 3.72 | 7.748 | 4.024 | 1.589 |
| 2015-09-03 | 0.908 | 2.208 | 3.659 | 7.626 | 3.944 | 1.546 |
| 2015-09-04 | 0.908 | 2.208 | 3.659 | 7.626 | 3.944 | 1.546 |
| 2015-09-05 | 0.908 | 2.208 | 3.659 | 7.626 | 3.944 | 1.546 |
| 2015-09-06 | 0.944 | 2.272 | 3.712 | 7.692 | 3.975 | 1.588 |
| 2015-09-07 | 0.981 | 2.357 | 3.701 | 7.682 | 4.018 | 1.615 |
| 2015-09-08 | 0.937 | 2.335 | 3.704 | 7.671 | 3.95 | 1.578 |
| 2015-09-09 | 0.944 | 2.321 | 3.665 | 7.731 | 3.86 | 1.519 |
| 2015-09-10 | 0.957 | 2.313 | 3.65 | 7.709 | 3.883 | 1.56 |
| 2015-09-11 | 0.957 | 2.313 | 3.65 | 7.709 | 3.883 | 1.56 |
| 2015-09-12 | 0.957 | 2.313 | 3.65 | 7.709 | 3.883 | 1.56 |
| 2015-09-13 | 0.957 | 2.313 | 3.65 | 7.709 | 3.883 | 1.56 |
| 2015-09-14 | 0.957 | 2.313 | 3.65 | 7.709 | 3.883 | 1.56 |
| 2015-09-15 | 0.957 | 2.313 | 3.65 | 7.709 | 3.883 | 1.56 |
| 2015-09-16 | 0.936 | 2.276 | 3.612 | 7.794 | 3.888 | 1.544 |
| 2015-09-17 | 0.888 | 2.281 | 3.646 | 7.889 | 3.889 | 1.561 |
| 2015-09-18 | 0.888 | 2.281 | 3.646 | 7.889 | 3.889 | 1.561 |
| 2015-09-19 | 0.888 | 2.281 | 3.646 | 7.889 | 3.889 | 1.561 |
| 2015-09-20 | 0.894 | 2.281 | 3.74 | 7.985 | 3.881 | 1.629 |
| 2015-09-21 | 0.956 | 2.27 | 3.731 | 7.995 | 3.902 | 1.703 |
| 2015-09-22 | 0.956 | 2.27 | 3.731 | 7.995 | 3.902 | 1.703 |
| 2015-09-23 | 0.956 | 2.27 | 3.731 | 7.995 | 3.902 | 1.703 |
| 2015-09-24 | 0.973 | 2.274 | 3.837 | 8.064 | 3.946 | 1.741 |
| 2015-09-25 | 0.973 | 2.274 | 3.837 | 8.064 | 3.946 | 1.741 |
| 2015-09-26 | 0.973 | 2.274 | 3.837 | 8.064 | 3.946 | 1.741 |
| 2015-09-27 | 0.973 | 2.274 | 3.837 | 8.064 | 3.946 | 1.741 |
| 2015-09-28 | 0.973 | 2.274 | 3.837 | 8.064 | 3.946 | 1.741 |
| 2015-09-29 | 1.023 | 2.306 | 3.91 | 8.201 | 3.991 | 1.727 |
| 2015-09-30 | 1.007 | 2.306 | 3.852 | 8.166 | 3.945 | 1.682 |
| 2015-10-01 | 0.981 | 2.291 | 3.843 | 8.108 | 3.916 | 1.63 |
| 2015-10-02 | 0.981 | 2.291 | 3.843 | 8.108 | 3.916 | 1.63 |
| 2015-10-03 | 0.981 | 2.291 | 3.843 | 8.108 | 3.916 | 1.63 |
| 2015-10-04 | 0.981 | 2.291 | 3.843 | 8.108 | 3.916 | 1.63 |
| 2015-10-05 | 0.981 | 2.291 | 3.843 | 8.108 | 3.916 | 1.63 |
| 2015-10-06 | 0.956 | 2.256 | 3.841 | 8.019 | 3.911 | 1.644 |
| 2015-10-07 | 0.956 | 2.272 | 3.89 | 8.015 | 3.884 | 1.674 |
| 2015-10-08 | 0.954 | 2.249 | 3.857 | 8.029 | 3.87 | 1.68 |
| 2015-10-09 | 0.954 | 2.249 | 3.857 | 8.029 | 3.87 | 1.68 |
| 2015-10-10 | 0.954 | 2.249 | 3.857 | 8.029 | 3.87 | 1.68 |
| 2015-10-11 | 0.961 | 2.223 | 3.861 | 8.05 | 3.866 | 1.598 |
| 2015-10-12 | 0.984 | 2.253 | 3.865 | 8.112 | 3.887 | 1.655 |
| 2015-10-13 | 1.026 | 2.336 | 3.989 | 8.205 | 3.986 | 1.763 |
| 2015-10-14 | 0.991 | 2.4 | 4.016 | 8.214 | 4.003 | 1.81 |
| 2015-10-15 | 0.968 | 2.313 | 3.978 | 8.133 | 3.914 | 1.724 |
| 2015-10-16 | 0.968 | 2.313 | 3.978 | 8.133 | 3.914 | 1.724 |
| 2015-10-17 | 0.968 | 2.313 | 3.978 | 8.133 | 3.914 | 1.724 |
| 2015-10-18 | 0.953 | 2.23 | 3.918 | 8.061 | 3.866 | 1.744 |
| 2015-10-19 | 0.952 | 2.25 | 3.914 | 8.096 | 3.854 | 1.709 |
| 2015-10-20 | 0.91 | 2.228 | 3.869 | 8.011 | 3.83 | 1.665 |
| 2015-10-21 | 0.898 | 2.229 | 3.884 | 7.952 | 3.854 | 1.665 |
| 2015-10-22 | 0.888 | 2.171 | 3.903 | 7.882 | 3.823 | 1.663 |
| 2015-10-23 | 0.888 | 2.171 | 3.903 | 7.882 | 3.823 | 1.663 |
| 2015-10-24 | 0.888 | 2.171 | 3.903 | 7.882 | 3.823 | 1.663 |
| 2015-10-25 | 0.911 | 2.144 | 3.871 | 7.846 | 3.835 | 1.673 |
| 2015-10-26 | 0.919 | 2.188 | 3.844 | 7.852 | 3.846 | 1.687 |
| 2015-10-27 | 0.867 | 2.098 | 3.753 | 7.717 | 3.744 | 1.653 |
| 2015-10-28 | 0.875 | 2.147 | 3.737 | 7.698 | 4.164 | 1.624 |
| 2015-10-29 | 0.907 | 2.189 | 3.804 | 7.73 | 4.077 | 1.562 |
| 2015-10-30 | 0.907 | 2.189 | 3.804 | 7.73 | 4.077 | 1.562 |
| 2015-10-31 | 0.907 | 2.189 | 3.804 | 7.73 | 4.077 | 1.562 |
| 2015-11-01 | 0.896 | 2.169 | 3.802 | 7.714 | 4.165 | 1.567 |
| 2015-11-02 | 0.916 | 2.167 | 3.828 | 7.763 | 4.128 | 1.58 |
| 2015-11-03 | 0.939 | 2.18 | 3.838 | 7.827 | 4.016 | 1.568 |
| 2015-11-04 | 0.945 | 2.177 | 3.834 | 7.844 | 3.92 | 1.581 |
| 2015-11-05 | 0.937 | 2.141 | 3.846 | 7.811 | 3.832 | 1.569 |
| 2015-11-06 | 0.937 | 2.141 | 3.846 | 7.811 | 3.832 | 1.569 |
| 2015-11-07 | 0.937 | 2.141 | 3.846 | 7.811 | 3.832 | 1.569 |
| 2015-11-08 | 0.936 | 2.156 | 3.857 | 7.845 | 3.863 | 1.634 |
| 2015-11-09 | 0.975 | 2.172 | 3.864 | 7.937 | 3.924 | 1.675 |
| 2015-11-10 | 0.959 | 2.172 | 3.831 | 7.904 | 3.907 | 1.682 |
| 2015-11-11 | 0.919 | 2.094 | 3.756 | 7.826 | 3.827 | 1.546 |
| 2015-11-12 | 0.942 | 2.129 | 3.801 | 7.869 | 3.87 | 1.603 |
| 2015-11-13 | 0.942 | 2.129 | 3.801 | 7.869 | 3.87 | 1.603 |
| 2015-11-14 | 0.942 | 2.129 | 3.801 | 7.869 | 3.87 | 1.603 |
| 2015-11-15 | 0.935 | 2.127 | 3.813 | 8 | 3.874 | 1.606 |
| 2015-11-16 | 0.925 | 2.103 | 3.801 | 7.978 | 3.816 | 1.56 |
| 2015-11-17 | 0.876 | 2.021 | 3.684 | 7.874 | 3.739 | 1.509 |
| 2015-11-18 | 0.855 | 1.981 | 3.622 | 7.806 | 3.719 | 1.526 |
| 2015-11-19 | 0.837 | 1.969 | 3.608 | 7.727 | 3.713 | 1.501 |
| 2015-11-20 | 0.837 | 1.969 | 3.608 | 7.727 | 3.713 | 1.501 |
| 2015-11-21 | 0.837 | 1.969 | 3.608 | 7.727 | 3.713 | 1.501 |
| 2015-11-22 | 0.859 | 2.107 | 3.589 | 7.825 | 3.713 | 1.49 |
| 2015-11-23 | 0.907 | 2.135 | 3.637 | 7.977 | 3.762 | 1.505 |
| 2015-11-24 | 0.951 | 2.25 | 3.727 | 8.033 | 3.839 | 1.562 |
| 2015-11-25 | 0.909 | 2.221 | 3.71 | 8.01 | 3.792 | 1.554 |
| 2015-11-26 | 0.891 | 2.202 | 3.68 | 7.965 | 3.774 | 1.526 |
| 2015-11-27 | 0.891 | 2.202 | 3.68 | 7.965 | 3.774 | 1.526 |
| 2015-11-28 | 0.891 | 2.202 | 3.68 | 7.965 | 3.774 | 1.526 |
| 2015-11-29 | 0.903 | 2.221 | 3.704 | 7.931 | 3.807 | 1.518 |
| 2015-11-30 | 0.918 | 2.233 | 3.697 | 7.942 | 3.832 | 1.504 |
| 2015-12-01 | 0.943 | 2.239 | 3.701 | 7.96 | 3.857 | 1.553 |
| 2015-12-02 | 0.938 | 2.307 | 3.724 | 8.019 | 3.852 | 1.542 |
| 2015-12-03 | 0.937 | 2.332 | 3.723 | 7.838 | 3.856 | 1.524 |
| 2015-12-04 | 0.937 | 2.332 | 3.723 | 7.838 | 3.856 | 1.524 |
| 2015-12-05 | 0.937 | 2.332 | 3.723 | 7.838 | 3.856 | 1.524 |
| 2015-12-06 | 0.914 | 2.313 | 3.762 | 7.77 | 3.857 | 1.525 |
| 2015-12-07 | 0.919 | 2.312 | 3.771 | 7.807 | 3.832 | 1.521 |
| 2015-12-08 | 0.916 | 2.295 | 3.766 | 7.911 | 3.862 | 1.521 |
| 2015-12-09 | 0.895 | 2.279 | 3.74 | 7.91 | 3.828 | 1.493 |
| 2015-12-10 | 0.921 | 2.269 | 3.795 | 7.911 | 3.84 | 1.522 |
| 2015-12-11 | 0.921 | 2.269 | 3.795 | 7.911 | 3.84 | 1.522 |
| 2015-12-12 | 0.921 | 2.269 | 3.795 | 7.911 | 3.84 | 1.522 |
| 2015-12-13 | 0.947 | 2.322 | 3.876 | 8.081 | 3.914 | 1.545 |
| 2015-12-14 | 0.932 | 2.365 | 3.919 | 8.16 | 3.986 | 1.545 |
| 2015-12-15 | 0.942 | 2.354 | 3.908 | 8.191 | 4.006 | 1.544 |
| 2015-12-16 | 0.921 | 2.291 | 3.859 | 8.151 | 3.942 | 1.537 |
| 2015-12-17 | 0.832 | 2.118 | 3.711 | 8.005 | 3.799 | 1.462 |
| 2015-12-18 | 0.832 | 2.118 | 3.711 | 8.005 | 3.799 | 1.462 |
| 2015-12-19 | 0.832 | 2.118 | 3.711 | 8.005 | 3.799 | 1.462 |
| 2015-12-20 | 0.895 | 2.141 | 3.834 | 8.034 | 3.873 | 1.47 |
| 2015-12-21 | 0.901 | 2.156 | 3.86 | 8.127 | 3.891 | 1.461 |
| 2015-12-22 | 0.914 | 2.155 | 3.853 | 8.237 | 3.879 | 1.457 |
| 2015-12-23 | 0.921 | 2.135 | 3.838 | 8.287 | 3.889 | 1.468 |
| 2015-12-24 | 0.927 | 2.146 | 3.877 | 8.387 | 3.859 | 1.481 |
| 2015-12-25 | 0.927 | 2.146 | 3.877 | 8.387 | 3.859 | 1.481 |
| 2015-12-26 | 0.927 | 2.146 | 3.877 | 8.387 | 3.859 | 1.481 |
| 2015-12-27 | 0.891 | 2.131 | 3.853 | 8.436 | 3.867 | 1.448 |
| 2015-12-28 | 0.917 | 2.168 | 3.892 | 8.504 | 3.858 | 1.467 |
| 2015-12-29 | 0.914 | 2.18 | 4.042 | 8.445 | 3.91 | 1.458 |
| 2015-12-30 | 0.925 | 2.178 | 3.831 | 8.534 | 3.896 | 1.436 |
| 2015-12-31 | 0.906 | 2.102 | 3.808 | 8.441 | 3.811 | 1.424 |
| 2016-01-01 | 0.906 | 2.102 | 3.808 | 8.441 | 3.811 | 1.424 |
| 2016-01-02 | 0.906 | 2.102 | 3.808 | 8.441 | 3.811 | 1.424 |
| 2016-01-03 | 0.879 | 2.028 | 3.718 | 8.331 | 3.723 | 1.407 |
| 2016-01-04 | 0.898 | 2.007 | 3.757 | 8.409 | 3.756 | 1.434 |
| 2016-01-05 | 0.867 | 1.981 | 3.753 | 8.361 | 3.732 | 1.443 |
| 2016-01-06 | 0.834 | 1.948 | 3.737 | 8.937 | 3.777 | 1.435 |
| 2016-01-07 | 0.845 | 1.957 | 3.779 | 9.164 | 3.804 | 1.459 |
| 2016-01-08 | 0.845 | 1.957 | 3.779 | 9.164 | 3.804 | 1.459 |
| 2016-01-09 | 0.845 | 1.957 | 3.779 | 9.164 | 3.804 | 1.459 |
| 2016-01-10 | 0.848 | 1.949 | 3.777 | 9.314 | 3.809 | 1.437 |
| 2016-01-11 | 0.832 | 1.889 | 3.702 | 9.149 | 3.742 | 1.372 |
| 2016-01-12 | 0.866 | 1.966 | 3.74 | 9.207 | 3.831 | 1.411 |
| 2016-01-13 | 0.908 | 2.054 | 3.818 | 9.575 | 3.93 | 1.463 |
| 2016-01-14 | 0.957 | 2.145 | 4.031 | 10.178 | 4.182 | 1.546 |
| 2016-01-15 | 0.957 | 2.145 | 4.031 | 10.178 | 4.182 | 1.546 |
| 2016-01-16 | 0.957 | 2.145 | 4.031 | 10.178 | 4.182 | 1.546 |
| 2016-01-17 | 0.944 | 2.118 | 4.029 | 10.282 | 4.143 | 1.496 |
| 2016-01-18 | 0.928 | 2.096 | 4.006 | 10.243 | 4.144 | 1.463 |
| 2016-01-19 | 0.958 | 2.119 | 4.014 | 10.127 | 4.135 | 1.469 |
| 2016-01-20 | 1.11 | 2.284 | 4.244 | 10.396 | 4.349 | 1.62 |
| 2016-01-21 | 1.137 | 2.344 | 4.352 | 10.48 | 4.427 | 1.706 |
| 2016-01-22 | 1.137 | 2.344 | 4.352 | 10.48 | 4.427 | 1.706 |
| 2016-01-23 | 1.137 | 2.344 | 4.352 | 10.48 | 4.427 | 1.706 |
| 2016-01-24 | 1.135 | 2.315 | 4.296 | 10.33 | 4.387 | 1.701 |
| 2016-01-25 | 1.081 | 2.248 | 4.289 | 9.765 | 4.334 | 1.657 |
| 2016-01-26 | 1.049 | 2.225 | 4.353 | 9.716 | 4.359 | 1.657 |
| 2016-01-27 | 0.982 | 2.157 | 4.325 | 9.63 | 4.293 | 1.597 |
| 2016-01-28 | 0.976 | 2.15 | 4.299 | 9.456 | 4.226 | 1.581 |
| 2016-01-29 | 0.976 | 2.15 | 4.299 | 9.456 | 4.226 | 1.581 |
| 2016-01-30 | 0.976 | 2.15 | 4.299 | 9.456 | 4.226 | 1.581 |
| 2016-01-31 | 0.916 | 2.05 | 4.286 | 9.357 | 4.121 | 1.551 |
| 2016-02-01 | 0.88 | 2.016 | 4.304 | 9.322 | 4.167 | 1.513 |
| 2016-02-02 | 0.885 | 1.981 | 4.258 | 9.315 | 4.155 | 1.534 |
| 2016-02-03 | 0.893 | 2 | 4.288 | 9.348 | 4.222 | 1.549 |
| 2016-02-04 | 0.941 | 2.037 | 4.306 | 9.358 | 4.056 | 1.564 |
| 2016-02-05 | 0.941 | 2.037 | 4.306 | 9.358 | 4.056 | 1.564 |
| 2016-02-06 | 0.941 | 2.037 | 4.306 | 9.358 | 4.056 | 1.564 |
| 2016-02-07 | 0.942 | 2.03 | 4.331 | 9.532 | 4.107 | 1.55 |
| 2016-02-08 | 0.962 | 2.077 | 4.402 | 9.587 | 4.181 | 1.548 |
| 2016-02-09 | 1.022 | 2.154 | 4.53 | 9.73 | 4.279 | 1.615 |
| 2016-02-10 | 0.979 | 2.098 | 4.507 | 9.779 | 4.232 | 1.572 |
| 2016-02-11 | 1.098 | 2.25 | 4.654 | 9.972 | 4.258 | 1.704 |
| 2016-02-12 | 1.098 | 2.25 | 4.654 | 9.972 | 4.258 | 1.704 |
| 2016-02-13 | 1.098 | 2.25 | 4.654 | 9.972 | 4.258 | 1.704 |
| 2016-02-14 | 1.068 | 2.228 | 4.603 | 9.977 | 4.178 | 1.696 |
| 2016-02-15 | 0.959 | 2.054 | 4.487 | 9.795 | 3.982 | 1.646 |
| 2016-02-16 | 0.96 | 2.112 | 4.553 | 9.793 | 4.06 | 1.66 |
| 2016-02-17 | 0.934 | 2.077 | 4.517 | 9.872 | 4.021 | 1.584 |
| 2016-02-18 | 0.97 | 2.102 | 4.51 | 9.746 | 4.056 | 1.589 |
| 2016-02-19 | 0.97 | 2.102 | 4.51 | 9.746 | 4.056 | 1.589 |
| 2016-02-20 | 0.97 | 2.102 | 4.51 | 9.746 | 4.056 | 1.589 |
| 2016-02-21 | 0.98 | 2.083 | 4.544 | 9.62 | 4.094 | 1.557 |
| 2016-02-22 | 0.994 | 2.117 | 4.585 | 9.518 | 4.1 | 1.571 |
| 2016-02-23 | 0.998 | 2.137 | 4.625 | 9.497 | 4.137 | 1.618 |
| 2016-02-24 | 0.968 | 2.122 | 4.694 | 9.607 | 4.158 | 1.639 |
| 2016-02-25 | 0.974 | 2.108 | 4.722 | 9.567 | 4.091 | 1.614 |
| 2016-02-26 | 0.974 | 2.108 | 4.722 | 9.567 | 4.091 | 1.614 |
| 2016-02-27 | 0.974 | 2.108 | 4.722 | 9.567 | 4.091 | 1.614 |
| 2016-02-28 | 0.994 | 2.113 | 4.723 | 9.62 | 4.028 | 1.654 |
| 2016-02-29 | 0.987 | 2.094 | 4.646 | 9.429 | 4.013 | 1.652 |
| 2016-03-01 | 0.961 | 2.056 | 4.468 | 9.165 | 3.883 | 1.584 |
| 2016-03-02 | 0.942 | 1.974 | 4.466 | 9.003 | 3.611 | 1.552 |
| 2016-03-03 | 0.965 | 1.892 | 4.407 | 8.876 | 3.541 | 1.515 |
| 2016-03-04 | 0.965 | 1.892 | 4.407 | 8.876 | 3.541 | 1.515 |
| 2016-03-05 | 0.965 | 1.892 | 4.407 | 8.876 | 3.541 | 1.515 |
| 2016-03-06 | 0.991 | 1.905 | 4.419 | 8.847 | 3.548 | 1.533 |
| 2016-03-07 | 0.999 | 1.967 | 4.467 | 8.932 | 3.633 | 1.531 |
| 2016-03-08 | 0.978 | 1.913 | 4.478 | 8.89 | 3.63 | 1.523 |
| 2016-03-09 | 0.985 | 1.916 | 4.493 | 8.954 | 3.636 | 1.509 |
| 2016-03-10 | 0.981 | 1.977 | 4.448 | 8.851 | 3.584 | 1.53 |
| 2016-03-11 | 0.981 | 1.977 | 4.448 | 8.851 | 3.584 | 1.53 |
| 2016-03-12 | 0.981 | 1.977 | 4.448 | 8.851 | 3.584 | 1.53 |
| 2016-03-13 | 1.017 | 2 | 4.47 | 8.806 | 3.618 | 1.631 |
| 2016-03-14 | 0.974 | 1.901 | 4.468 | 8.841 | 3.581 | 1.63 |
| 2016-03-15 | 0.945 | 1.926 | 4.38 | 8.581 | 3.548 | 1.61 |
| 2016-03-16 | 0.956 | 1.914 | 4.387 | 8.508 | 3.587 | 1.658 |
| 2016-03-17 | 0.908 | 1.878 | 4.404 | 8.417 | 3.524 | 1.615 |
| 2016-03-18 | 0.908 | 1.878 | 4.404 | 8.417 | 3.524 | 1.615 |
| 2016-03-19 | 0.908 | 1.878 | 4.404 | 8.417 | 3.524 | 1.615 |
| 2016-03-20 | 0.913 | 1.83 | 4.416 | 8.335 | 3.505 | 1.574 |
| 2016-03-21 | 0.939 | 1.809 | 4.404 | 8.352 | 3.507 | 1.567 |
| 2016-03-22 | 0.918 | 1.804 | 4.379 | 8.319 | 3.457 | 1.516 |
| 2016-03-23 | 0.911 | 1.809 | 4.37 | 8.387 | 3.419 | 1.461 |
| 2016-03-24 | 0.911 | 1.809 | 4.37 | 8.387 | 3.419 | 1.461 |
| 2016-03-25 | 0.911 | 1.809 | 4.37 | 8.387 | 3.419 | 1.461 |
| 2016-03-26 | 0.911 | 1.809 | 4.37 | 8.387 | 3.419 | 1.461 |
| 2016-03-27 | 0.913 | 1.826 | 4.453 | 8.646 | 3.445 | 1.437 |
| 2016-03-28 | 0.905 | 1.835 | 4.319 | 8.724 | 3.451 | 1.452 |
| 2016-03-29 | 0.877 | 1.779 | 4.103 | 8.662 | 3.389 | 1.42 |
| 2016-03-30 | 0.897 | 1.794 | 4.054 | 8.688 | 3.419 | 1.427 |
| 2016-03-31 | 0.882 | 1.763 | 4.057 | 8.711 | 3.359 | 1.433 |
| 2016-04-01 | 0.882 | 1.763 | 4.057 | 8.711 | 3.359 | 1.433 |
| 2016-04-02 | 0.882 | 1.763 | 4.057 | 8.711 | 3.359 | 1.433 |
| 2016-04-03 | 0.899 | 1.777 | 4.054 | 8.47 | 3.404 | 1.428 |
| 2016-04-04 | 0.885 | 1.746 | 4.084 | 8.398 | 3.513 | 1.428 |
| 2016-04-05 | 0.891 | 1.744 | 4.116 | 8.419 | 3.526 | 1.446 |
| 2016-04-06 | 0.901 | 1.756 | 4.129 | 8.383 | 3.538 | 1.426 |
| 2016-04-07 | 0.873 | 1.723 | 4.06 | 8.248 | 3.508 | 1.435 |
| 2016-04-08 | 0.873 | 1.723 | 4.06 | 8.248 | 3.508 | 1.435 |
| 2016-04-09 | 0.873 | 1.723 | 4.06 | 8.248 | 3.508 | 1.435 |
| 2016-04-10 | 0.872 | 1.74 | 4.051 | 8.231 | 3.526 | 1.436 |
| 2016-04-11 | 0.908 | 1.768 | 4.107 | 8.267 | 3.575 | 1.468 |
| 2016-04-12 | 0.905 | 1.759 | 4.131 | 8.347 | 3.604 | 1.469 |
| 2016-04-13 | 0.885 | 1.73 | 4.116 | 8.418 | 3.562 | 1.455 |
| 2016-04-14 | 0.882 | 1.71 | 4.128 | 8.323 | 3.502 | 1.443 |
| 2016-04-15 | 0.882 | 1.71 | 4.128 | 8.323 | 3.502 | 1.443 |
| 2016-04-16 | 0.882 | 1.71 | 4.128 | 8.323 | 3.502 | 1.443 |
| 2016-04-17 | 0.863 | 1.698 | 4.09 | 8.368 | 3.496 | 1.425 |
| 2016-04-18 | 0.837 | 1.67 | 4.071 | 8.319 | 3.489 | 1.416 |
| 2016-04-19 | 0.862 | 1.67 | 4.057 | 8.302 | 3.51 | 1.44 |
| 2016-04-20 | 0.914 | 1.739 | 4.098 | 8.393 | 3.556 | 1.487 |
| 2016-04-21 | 0.895 | 1.714 | 4.077 | 8.352 | 3.497 | 1.468 |
| 2016-04-22 | 0.895 | 1.714 | 4.077 | 8.352 | 3.497 | 1.468 |
| 2016-04-23 | 0.895 | 1.714 | 4.077 | 8.352 | 3.497 | 1.468 |
| 2016-04-24 | 0.904 | 1.745 | 4.099 | 8.465 | 3.505 | 1.483 |
| 2016-04-25 | 0.892 | 1.744 | 4.099 | 8.458 | 3.484 | 1.465 |
| 2016-04-26 | 0.904 | 1.757 | 4.126 | 8.515 | 3.498 | 1.479 |
| 2016-04-27 | 0.894 | 1.75 | 4.104 | 8.567 | 3.501 | 1.49 |
| 2016-04-28 | 0.894 | 1.75 | 4.104 | 8.567 | 3.501 | 1.49 |
| 2016-04-29 | 0.894 | 1.75 | 4.104 | 8.567 | 3.501 | 1.49 |
| 2016-04-30 | 0.894 | 1.75 | 4.104 | 8.567 | 3.501 | 1.49 |
| 2016-05-01 | 0.854 | 1.723 | 4.068 | 8.544 | 3.47 | 1.424 |
| 2016-05-02 | 0.851 | 1.708 | 4.087 | 8.477 | 3.433 | 1.426 |
| 2016-05-03 | 0.848 | 1.681 | 4.031 | 8.474 | 3.427 | 1.437 |
| 2016-05-04 | 0.852 | 1.674 | 3.99 | 8.419 | 3.386 | 1.415 |
| 2016-05-05 | 0.873 | 1.659 | 3.973 | 8.314 | 3.431 | 1.426 |
| 2016-05-06 | 0.873 | 1.659 | 3.973 | 8.314 | 3.431 | 1.426 |
| 2016-05-07 | 0.873 | 1.659 | 3.973 | 8.314 | 3.431 | 1.426 |
| 2016-05-08 | 0.883 | 1.68 | 3.989 | 8.292 | 3.404 | 1.412 |
| 2016-05-09 | 0.871 | 1.652 | 3.937 | 8.034 | 3.395 | 1.4 |
| 2016-05-10 | 0.872 | 1.632 | 3.914 | 8.317 | 3.391 | 1.403 |
| 2016-05-11 | 0.872 | 1.632 | 3.914 | 8.317 | 3.391 | 1.403 |
| 2016-05-12 | 0.872 | 1.632 | 3.914 | 8.317 | 3.391 | 1.403 |
| 2016-05-13 | 0.872 | 1.632 | 3.914 | 8.317 | 3.391 | 1.403 |
| 2016-05-14 | 0.872 | 1.632 | 3.914 | 8.317 | 3.391 | 1.403 |
| 2016-05-15 | 0.87 | 1.653 | 3.945 | 8.444 | 3.35 | 1.41 |
| 2016-05-16 | 0.843 | 1.597 | 3.937 | 8.375 | 3.277 | 1.387 |
| 2016-05-17 | 0.855 | 1.592 | 3.956 | 8.353 | 3.279 | 1.395 |
| 2016-05-18 | 0.871 | 1.597 | 3.888 | 8.463 | 3.29 | 1.356 |
| 2016-05-19 | 0.877 | 1.59 | 3.88 | 8.496 | 3.302 | 1.325 |
| 2016-05-20 | 0.877 | 1.59 | 3.88 | 8.496 | 3.302 | 1.325 |
| 2016-05-21 | 0.877 | 1.59 | 3.88 | 8.496 | 3.302 | 1.325 |
| 2016-05-22 | 0.827 | 1.556 | 3.826 | 8.479 | 3.265 | 1.322 |
| 2016-05-23 | 0.816 | 1.568 | 3.835 | 8.484 | 3.257 | 1.318 |
| 2016-05-24 | 0.823 | 1.564 | 3.771 | 8.491 | 3.273 | 1.318 |
| 2016-05-25 | 0.838 | 1.554 | 3.754 | 8.459 | 3.289 | 1.323 |
| 2016-05-26 | 0.82 | 1.52 | 3.748 | 8.355 | 3.268 | 1.33 |
| 2016-05-27 | 0.82 | 1.52 | 3.748 | 8.355 | 3.268 | 1.33 |
| 2016-05-28 | 0.82 | 1.52 | 3.748 | 8.355 | 3.268 | 1.33 |
| 2016-05-29 | 0.827 | 1.529 | 3.755 | 7.837 | 3.273 | 1.34 |
| 2016-05-30 | 0.823 | 1.523 | 3.732 | 7.756 | 3.271 | 1.342 |
| 2016-05-31 | 0.833 | 1.524 | 3.72 | 7.711 | 3.267 | 1.342 |
| 2016-06-01 | 0.823 | 1.524 | 3.749 | 7.98 | 3.274 | 1.349 |
| 2016-06-02 | 0.817 | 1.509 | 3.764 | 7.925 | 3.274 | 1.33 |
| 2016-06-03 | 0.817 | 1.509 | 3.764 | 7.925 | 3.274 | 1.33 |
| 2016-06-04 | 0.817 | 1.509 | 3.764 | 7.925 | 3.274 | 1.33 |
| 2016-06-05 | 0.818 | 1.499 | 3.768 | 7.743 | 3.269 | 1.347 |
| 2016-06-06 | 0.816 | 1.5 | 3.73 | 7.37 | 3.235 | 1.334 |
| 2016-06-07 | 0.808 | 1.494 | 3.725 | 7.222 | 3.216 | 1.347 |
| 2016-06-08 | 0.829 | 1.52 | 3.678 | 7.221 | 3.195 | 1.355 |
| 2016-06-09 | 0.832 | 1.532 | 3.672 | 7.212 | 3.194 | 1.382 |
| 2016-06-10 | 0.832 | 1.532 | 3.672 | 7.212 | 3.194 | 1.382 |
| 2016-06-11 | 0.832 | 1.532 | 3.672 | 7.212 | 3.194 | 1.382 |
| 2016-06-12 | 0.832 | 1.532 | 3.672 | 7.212 | 3.194 | 1.382 |
| 2016-06-13 | 0.809 | 1.556 | 3.703 | 7.327 | 3.198 | 1.346 |
| 2016-06-14 | 0.829 | 1.602 | 3.783 | 7.353 | 3.227 | 1.373 |
| 2016-06-15 | 0.807 | 1.591 | 3.798 | 7.349 | 3.198 | 1.335 |
| 2016-06-16 | 0.781 | 1.529 | 3.796 | 7.386 | 3.18 | 1.327 |
| 2016-06-17 | 0.781 | 1.529 | 3.796 | 7.386 | 3.18 | 1.327 |
| 2016-06-18 | 0.781 | 1.529 | 3.796 | 7.386 | 3.18 | 1.327 |
| 2016-06-19 | 0.796 | 1.541 | 3.818 | 7.455 | 3.2 | 1.336 |
| 2016-06-20 | 0.808 | 1.538 | 3.746 | 7.408 | 3.201 | 1.315 |
| 2016-06-21 | 0.821 | 1.564 | 3.776 | 7.452 | 3.217 | 1.317 |
| 2016-06-22 | 0.819 | 1.558 | 3.753 | 7.479 | 3.222 | 1.334 |
| 2016-06-23 | 0.786 | 1.513 | 3.719 | 7.518 | 3.209 | 1.319 |
| 2016-06-24 | 0.786 | 1.513 | 3.719 | 7.518 | 3.209 | 1.319 |
| 2016-06-25 | 0.786 | 1.513 | 3.719 | 7.518 | 3.209 | 1.319 |
| 2016-06-26 | 0.856 | 1.605 | 3.885 | 7.805 | 3.377 | 1.396 |
| 2016-06-27 | 0.839 | 1.616 | 3.918 | 7.975 | 3.402 | 1.404 |
| 2016-06-28 | 0.853 | 1.625 | 3.926 | 7.815 | 3.371 | 1.467 |
| 2016-06-29 | 0.795 | 1.549 | 3.868 | 7.79 | 3.274 | 1.429 |
| 2016-06-30 | 0.767 | 1.491 | 3.796 | 7.72 | 3.221 | 1.391 |
| 2016-07-01 | 0.767 | 1.491 | 3.796 | 7.72 | 3.221 | 1.391 |
| 2016-07-02 | 0.767 | 1.491 | 3.796 | 7.72 | 3.221 | 1.391 |
| 2016-07-03 | 0.732 | 1.448 | 3.791 | 7.261 | 3.167 | 1.386 |
| 2016-07-04 | 0.701 | 1.395 | 3.72 | 7.21 | 3.087 | 1.371 |
| 2016-07-05 | 0.733 | 1.415 | 3.745 | 7.208 | 2.904 | 1.394 |
| 2016-07-06 | 0.729 | 1.495 | 3.776 | 7.345 | 2.935 | 1.358 |
| 2016-07-07 | 0.743 | 1.549 | 3.835 | 7.351 | 2.968 | 1.378 |
| 2016-07-08 | 0.743 | 1.549 | 3.835 | 7.351 | 2.968 | 1.378 |
| 2016-07-09 | 0.743 | 1.549 | 3.835 | 7.351 | 2.968 | 1.378 |
| 2016-07-10 | 0.713 | 1.5 | 3.79 | 7.278 | 2.937 | 1.386 |
| 2016-07-11 | 0.705 | 1.49 | 3.764 | 7.193 | 2.874 | 1.39 |
| 2016-07-12 | 0.706 | 1.509 | 3.826 | 6.871 | 2.903 | 1.402 |
| 2016-07-13 | 0.707 | 1.492 | 3.816 | 6.806 | 2.902 | 1.4 |
| 2016-07-14 | 0.712 | 1.525 | 3.813 | 6.815 | 2.935 | 1.38 |
| 2016-07-15 | 0.712 | 1.525 | 3.813 | 6.815 | 2.935 | 1.38 |
| 2016-07-16 | 0.712 | 1.525 | 3.813 | 6.815 | 2.935 | 1.38 |
| 2016-07-17 | 0.722 | 1.542 | 3.862 | 6.319 | 2.897 | 1.357 |
| 2016-07-18 | 0.736 | 1.532 | 3.871 | 6.087 | 2.868 | 1.373 |
| 2016-07-19 | 0.694 | 1.555 | 3.75 | 5.941 | 2.798 | 1.353 |
| 2016-07-20 | 0.666 | 1.501 | 3.738 | 5.872 | 2.769 | 1.303 |
| 2016-07-21 | 0.698 | 1.529 | 3.757 | 5.918 | 2.784 | 1.301 |
| 2016-07-22 | 0.698 | 1.529 | 3.757 | 5.918 | 2.784 | 1.301 |
| 2016-07-23 | 0.698 | 1.529 | 3.757 | 5.918 | 2.784 | 1.301 |
| 2016-07-24 | 0.678 | 1.523 | 3.719 | 5.643 | 2.802 | 1.295 |
| 2016-07-25 | 0.662 | 1.489 | 3.686 | 5.846 | 2.799 | 1.296 |
| 2016-07-26 | 0.647 | 1.472 | 3.71 | 5.855 | 2.699 | 1.251 |
| 2016-07-27 | 0.67 | 1.495 | 3.668 | 5.899 | 2.691 | 1.265 |
| 2016-07-28 | 0.677 | 1.529 | 3.671 | 5.937 | 2.696 | 1.283 |
| 2016-07-29 | 0.677 | 1.529 | 3.671 | 5.937 | 2.696 | 1.283 |
| 2016-07-30 | 0.677 | 1.529 | 3.671 | 5.937 | 2.696 | 1.283 |
| 2016-07-31 | 0.674 | 1.548 | 3.641 | 5.857 | 2.702 | 1.311 |
| 2016-08-01 | 0.672 | 1.527 | 3.665 | 5.91 | 2.719 | 1.29 |
| 2016-08-02 | 0.682 | 1.519 | 3.715 | 5.975 | 2.728 | 1.297 |
| 2016-08-03 | 0.644 | 1.517 | 3.739 | 6.042 | 2.722 | 1.265 |
| 2016-08-04 | 0.667 | 1.546 | 3.785 | 6.103 | 2.751 | 1.293 |
| 2016-08-05 | 0.667 | 1.546 | 3.785 | 6.103 | 2.751 | 1.293 |
| 2016-08-06 | 0.667 | 1.546 | 3.785 | 6.103 | 2.751 | 1.293 |
| 2016-08-07 | 0.631 | 1.489 | 3.71 | 6.021 | 2.7 | 1.238 |
| 2016-08-08 | 0.632 | 1.478 | 3.679 | 6.047 | 2.679 | 1.211 |
| 2016-08-09 | 0.646 | 1.451 | 3.626 | 6.078 | 2.653 | 1.237 |
| 2016-08-10 | 0.651 | 1.443 | 3.602 | 6.046 | 2.631 | 1.246 |
| 2016-08-11 | 0.668 | 1.439 | 3.569 | 5.907 | 2.621 | 1.255 |
| 2016-08-12 | 0.668 | 1.439 | 3.569 | 5.907 | 2.621 | 1.255 |
| 2016-08-13 | 0.668 | 1.439 | 3.569 | 5.907 | 2.621 | 1.255 |
| 2016-08-14 | 0.668 | 1.439 | 3.569 | 5.907 | 2.621 | 1.255 |
| 2016-08-15 | 0.661 | 1.427 | 3.565 | 5.886 | 2.628 | 1.241 |
| 2016-08-16 | 0.713 | 1.452 | 3.572 | 5.9 | 2.695 | 1.304 |
| 2016-08-17 | 0.744 | 1.495 | 3.598 | 5.951 | 2.733 | 1.303 |
| 2016-08-18 | 0.714 | 1.493 | 3.561 | 5.843 | 2.693 | 1.283 |
| 2016-08-19 | 0.714 | 1.493 | 3.561 | 5.843 | 2.693 | 1.283 |
| 2016-08-20 | 0.714 | 1.493 | 3.561 | 5.843 | 2.693 | 1.283 |
| 2016-08-21 | 0.701 | 1.501 | 3.592 | 5.833 | 2.73 | 1.342 |
| 2016-08-22 | 0.72 | 1.527 | 3.612 | 5.813 | 2.753 | 1.325 |
| 2016-08-23 | 0.671 | 1.428 | 3.597 | 5.75 | 2.744 | 1.311 |
| 2016-08-24 | 0.715 | 1.492 | 3.609 | 5.402 | 2.744 | 1.322 |
| 2016-08-25 | 0.706 | 1.48 | 3.582 | 5.449 | 2.732 | 1.317 |
| 2016-08-26 | 0.706 | 1.48 | 3.582 | 5.449 | 2.732 | 1.317 |
| 2016-08-27 | 0.706 | 1.48 | 3.582 | 5.449 | 2.732 | 1.317 |
| 2016-08-28 | 0.697 | 1.485 | 3.593 | 5.498 | 2.754 | 1.336 |
| 2016-08-29 | 0.706 | 1.51 | 3.648 | 5.531 | 2.745 | 1.351 |
| 2016-08-30 | 0.66 | 1.442 | 3.615 | 5.506 | 2.715 | 1.348 |
| 2016-08-31 | 0.703 | 1.443 | 3.636 | 5.532 | 2.727 | 1.353 |
| 2016-09-01 | 0.686 | 1.422 | 3.627 | 5.732 | 2.727 | 1.32 |
| 2016-09-02 | 0.686 | 1.422 | 3.627 | 5.732 | 2.727 | 1.32 |
| 2016-09-03 | 0.686 | 1.422 | 3.627 | 5.732 | 2.727 | 1.32 |
| 2016-09-04 | 0.706 | 1.473 | 3.643 | 5.752 | 2.766 | 1.341 |
| 2016-09-05 | 0.677 | 1.402 | 3.576 | 5.749 | 2.747 | 1.322 |
| 2016-09-06 | 0.709 | 1.443 | 3.586 | 5.766 | 2.778 | 1.295 |
| 2016-09-07 | 0.703 | 1.406 | 3.573 | 5.782 | 2.744 | 1.286 |
| 2016-09-08 | 0.703 | 1.367 | 3.577 | 5.765 | 2.741 | 1.274 |
| 2016-09-09 | 0.703 | 1.367 | 3.577 | 5.765 | 2.741 | 1.274 |
| 2016-09-10 | 0.703 | 1.367 | 3.577 | 5.765 | 2.741 | 1.274 |
| 2016-09-11 | 0.72 | 1.358 | 3.63 | 5.826 | 2.812 | 1.275 |
| 2016-09-12 | 0.783 | 1.492 | 3.73 | 5.938 | 2.907 | 1.347 |
| 2016-09-13 | 0.761 | 1.505 | 3.71 | 5.93 | 2.875 | 1.332 |
| 2016-09-14 | 0.785 | 1.56 | 3.752 | 5.985 | 2.915 | 1.37 |
| 2016-09-15 | 0.767 | 1.573 | 3.719 | 5.978 | 2.924 | 1.377 |
| 2016-09-16 | 0.767 | 1.573 | 3.719 | 5.978 | 2.924 | 1.377 |
| 2016-09-17 | 0.767 | 1.573 | 3.719 | 5.978 | 2.924 | 1.377 |
| 2016-09-18 | 0.713 | 1.489 | 3.697 | 5.853 | 2.865 | 1.345 |
| 2016-09-19 | 0.773 | 1.537 | 3.714 | 5.841 | 2.696 | 1.35 |
| 2016-09-20 | 0.815 | 1.557 | 3.749 | 5.869 | 2.717 | 1.37 |
| 2016-09-21 | 0.847 | 1.626 | 3.721 | 5.85 | 2.733 | 1.415 |
| 2016-09-22 | 0.833 | 1.599 | 3.665 | 5.828 | 2.718 | 1.405 |
| 2016-09-23 | 0.833 | 1.599 | 3.665 | 5.828 | 2.718 | 1.405 |
| 2016-09-24 | 0.833 | 1.599 | 3.665 | 5.828 | 2.718 | 1.405 |
| 2016-09-25 | 0.819 | 1.564 | 3.703 | 5.841 | 2.684 | 1.378 |
| 2016-09-26 | 0.827 | 1.572 | 3.715 | 5.849 | 2.722 | 1.402 |
| 2016-09-27 | 0.819 | 1.592 | 3.741 | 5.86 | 2.759 | 1.438 |
| 2016-09-28 | 0.806 | 1.584 | 3.73 | 5.842 | 2.74 | 1.396 |
| 2016-09-29 | 0.793 | 1.579 | 3.671 | 5.818 | 2.725 | 1.385 |
| 2016-09-30 | 0.793 | 1.579 | 3.671 | 5.818 | 2.725 | 1.385 |
| 2016-10-01 | 0.793 | 1.579 | 3.671 | 5.818 | 2.725 | 1.385 |
| 2016-10-02 | 0.793 | 1.579 | 3.671 | 5.818 | 2.725 | 1.385 |
| 2016-10-03 | 0.793 | 1.579 | 3.671 | 5.818 | 2.725 | 1.385 |
| 2016-10-04 | 0.793 | 1.579 | 3.671 | 5.818 | 2.725 | 1.385 |
| 2016-10-05 | 0.793 | 1.545 | 3.654 | 5.845 | 2.705 | 1.368 |
| 2016-10-06 | 0.802 | 1.534 | 3.617 | 5.812 | 2.701 | 1.364 |
| 2016-10-07 | 0.802 | 1.534 | 3.617 | 5.812 | 2.701 | 1.364 |
| 2016-10-08 | 0.802 | 1.534 | 3.617 | 5.812 | 2.701 | 1.364 |
| 2016-10-09 | 0.795 | 1.52 | 3.605 | 5.808 | 2.697 | 1.372 |
| 2016-10-10 | 0.779 | 1.511 | 3.596 | 5.759 | 2.681 | 1.373 |
| 2016-10-11 | 0.779 | 1.511 | 3.596 | 5.759 | 2.681 | 1.373 |
| 2016-10-12 | 0.779 | 1.511 | 3.596 | 5.759 | 2.681 | 1.373 |
| 2016-10-13 | 0.791 | 1.55 | 3.623 | 5.796 | 2.689 | 1.373 |
| 2016-10-14 | 0.791 | 1.55 | 3.623 | 5.796 | 2.689 | 1.373 |
| 2016-10-15 | 0.791 | 1.55 | 3.623 | 5.796 | 2.689 | 1.373 |
| 2016-10-16 | 0.791 | 1.55 | 3.623 | 5.796 | 2.689 | 1.373 |
| 2016-10-17 | 0.791 | 1.55 | 3.623 | 5.796 | 2.689 | 1.373 |
| 2016-10-18 | 0.814 | 1.55 | 3.656 | 5.793 | 2.714 | 1.367 |
| 2016-10-19 | 0.783 | 1.5 | 3.616 | 5.783 | 2.71 | 1.357 |
| 2016-10-20 | 0.735 | 1.461 | 3.618 | 5.76 | 2.679 | 1.364 |
| 2016-10-21 | 0.735 | 1.461 | 3.618 | 5.76 | 2.679 | 1.364 |
| 2016-10-22 | 0.735 | 1.461 | 3.618 | 5.76 | 2.679 | 1.364 |
| 2016-10-23 | 0.735 | 1.461 | 3.618 | 5.76 | 2.679 | 1.364 |
| 2016-10-24 | 0.735 | 1.461 | 3.618 | 5.76 | 2.679 | 1.364 |
| 2016-10-25 | 0.79 | 1.494 | 3.661 | 5.929 | 2.71 | 1.399 |
| 2016-10-26 | 0.79 | 1.51 | 3.681 | 5.922 | 2.698 | 1.376 |
| 2016-10-27 | 0.832 | 1.533 | 3.688 | 5.962 | 2.714 | 1.392 |
| 2016-10-28 | 0.832 | 1.533 | 3.688 | 5.962 | 2.714 | 1.392 |
| 2016-10-29 | 0.832 | 1.533 | 3.688 | 5.962 | 2.714 | 1.392 |
| 2016-10-30 | 0.851 | 1.555 | 3.704 | 6.004 | 2.734 | 1.412 |
| 2016-10-31 | 0.848 | 1.551 | 3.719 | 6.062 | 2.754 | 1.44 |
| 2016-11-01 | 0.853 | 1.569 | 3.736 | 6.122 | 2.775 | 1.433 |
| 2016-11-02 | 0.827 | 1.555 | 3.726 | 6.187 | 2.777 | 1.403 |
| 2016-11-03 | 0.833 | 1.563 | 3.729 | 6.178 | 2.772 | 1.404 |
| 2016-11-04 | 0.833 | 1.563 | 3.729 | 6.178 | 2.772 | 1.404 |
| 2016-11-05 | 0.833 | 1.563 | 3.729 | 6.178 | 2.772 | 1.404 |
| 2016-11-06 | 0.85 | 1.573 | 3.76 | 6.194 | 2.792 | 1.427 |
| 2016-11-07 | 0.831 | 1.541 | 3.731 | 5.859 | 2.76 | 1.385 |
| 2016-11-08 | 0.807 | 1.498 | 3.68 | 5.835 | 2.726 | 1.362 |
| 2016-11-09 | 0.866 | 1.568 | 3.729 | 5.971 | 2.796 | 1.399 |
| 2016-11-10 | 0.853 | 1.541 | 3.686 | 5.965 | 2.808 | 1.693 |
| 2016-11-11 | 0.853 | 1.541 | 3.686 | 5.965 | 2.808 | 1.693 |
| 2016-11-12 | 0.853 | 1.541 | 3.686 | 5.965 | 2.808 | 1.693 |
| 2016-11-13 | 0.865 | 1.573 | 3.731 | 5.978 | 2.797 | 1.27 |
| 2016-11-14 | 0.895 | 1.581 | 3.768 | 5.755 | 2.899 | 1.275 |
| 2016-11-15 | 0.884 | 1.523 | 3.79 | 5.905 | 2.868 | 1.278 |
| 2016-11-16 | 0.897 | 1.545 | 3.818 | 5.946 | 2.876 | 1.307 |
| 2016-11-17 | 0.88 | 1.522 | 3.765 | 5.939 | 2.882 | 1.291 |
| 2016-11-18 | 0.88 | 1.522 | 3.765 | 5.939 | 2.882 | 1.291 |
| 2016-11-19 | 0.88 | 1.522 | 3.765 | 5.939 | 2.882 | 1.291 |
| 2016-11-20 | 0.884 | 1.506 | 3.714 | 5.936 | 2.864 | 1.269 |
| 2016-11-21 | 0.888 | 1.52 | 3.67 | 6.058 | 2.851 | 1.266 |
| 2016-11-22 | 0.862 | 1.508 | 3.595 | 6.185 | 2.812 | 1.205 |
| 2016-11-23 | 0.831 | 1.486 | 3.501 | 5.986 | 2.771 | 1.292 |
| 2016-11-24 | 0.838 | 1.504 | 3.511 | 6.004 | 2.77 | 1.31 |
| 2016-11-25 | 0.838 | 1.504 | 3.511 | 6.004 | 2.77 | 1.31 |
| 2016-11-26 | 0.838 | 1.504 | 3.511 | 6.004 | 2.77 | 1.31 |
| 2016-11-27 | 0.839 | 1.5 | 3.466 | 5.924 | 2.755 | 1.291 |
| 2016-11-28 | 0.83 | 1.532 | 3.462 | 5.934 | 2.733 | 1.296 |
| 2016-11-29 | 0.829 | 1.53 | 3.472 | 5.952 | 2.731 | 1.321 |
| 2016-11-30 | 0.849 | 1.53 | 3.446 | 5.939 | 2.752 | 1.354 |
| 2016-12-01 | 0.845 | 1.534 | 3.411 | 5.896 | 2.746 | 1.366 |
| 2016-12-02 | 0.845 | 1.534 | 3.411 | 5.896 | 2.746 | 1.366 |
| 2016-12-03 | 0.845 | 1.534 | 3.411 | 5.896 | 2.746 | 1.366 |
| 2016-12-04 | 0.848 | 1.553 | 3.42 | 5.96 | 2.76 | 1.395 |
| 2016-12-05 | 0.829 | 1.532 | 3.404 | 5.71 | 2.733 | 1.395 |
| 2016-12-06 | 0.811 | 1.508 | 3.387 | 5.618 | 2.684 | 1.347 |
| 2016-12-07 | 0.833 | 1.546 | 3.409 | 5.576 | 2.648 | 1.38 |
| 2016-12-08 | 0.81 | 1.519 | 3.406 | 5.536 | 2.586 | 1.325 |
| 2016-12-09 | 0.81 | 1.519 | 3.406 | 5.536 | 2.586 | 1.325 |
| 2016-12-10 | 0.81 | 1.519 | 3.406 | 5.536 | 2.586 | 1.325 |
| 2016-12-11 | 0.812 | 1.371 | 3.376 | 5.479 | 2.547 | 1.296 |
| 2016-12-12 | 0.824 | 1.405 | 3.418 | 5.488 | 2.578 | 1.349 |
| 2016-12-13 | 0.823 | 1.378 | 3.402 | 5.405 | 2.556 | 1.32 |
| 2016-12-14 | 0.832 | 1.486 | 3.414 | 5.398 | 2.566 | 1.326 |
| 2016-12-15 | 0.805 | 1.431 | 3.38 | 5.351 | 2.539 | 1.285 |
| 2016-12-16 | 0.805 | 1.431 | 3.38 | 5.351 | 2.539 | 1.285 |
| 2016-12-17 | 0.805 | 1.431 | 3.38 | 5.351 | 2.539 | 1.285 |
| 2016-12-18 | 0.77 | 1.434 | 3.332 | 5.276 | 2.501 | 1.254 |
| 2016-12-19 | 0.827 | 1.471 | 3.418 | 5.306 | 2.564 | 1.3 |
| 2016-12-20 | 0.802 | 1.466 | 3.384 | 5.25 | 2.537 | 1.29 |
| 2016-12-21 | 0.837 | 1.499 | 3.425 | 5.307 | 2.581 | 1.314 |
| 2016-12-22 | 0.836 | 1.516 | 3.408 | 5.347 | 2.59 | 1.348 |
| 2016-12-23 | 0.836 | 1.516 | 3.408 | 5.347 | 2.59 | 1.348 |
| 2016-12-24 | 0.836 | 1.516 | 3.408 | 5.347 | 2.59 | 1.348 |
| 2016-12-25 | 0.85 | 1.509 | 3.389 | 5.377 | 2.605 | 1.368 |
| 2016-12-26 | 0.843 | 1.499 | 3.377 | 5.38 | 2.608 | 1.368 |
| 2016-12-27 | 0.864 | 1.524 | 3.393 | 5.429 | 2.653 | 1.405 |
| 2016-12-28 | 0.83 | 1.513 | 3.374 | 5.411 | 2.634 | 1.413 |
| 2016-12-29 | 0.791 | 1.538 | 3.345 | 5.446 | 2.601 | 1.384 |
| 2016-12-30 | 0.791 | 1.538 | 3.345 | 5.446 | 2.601 | 1.384 |
| 2016-12-31 | 0.791 | 1.538 | 3.345 | 5.446 | 2.601 | 1.384 |
| 2017-01-01 | 0.792 | 1.615 | 3.355 | 5.745 | 2.566 | 1.401 |
| 2017-01-02 | 0.787 | 1.592 | 3.317 | 5.671 | 2.537 | 1.398 |
| 2017-01-03 | 0.792 | 1.578 | 3.275 | 5.653 | 2.539 | 1.4 |
| 2017-01-04 | 0.806 | 1.593 | 3.285 | 5.668 | 2.528 | 1.395 |
| 2017-01-05 | 0.79 | 1.59 | 3.286 | 5.629 | 2.509 | 1.371 |
| 2017-01-06 | 0.79 | 1.59 | 3.286 | 5.629 | 2.509 | 1.371 |
| 2017-01-07 | 0.79 | 1.59 | 3.286 | 5.629 | 2.509 | 1.371 |
| 2017-01-08 | 0.75 | 1.532 | 3.25 | 5.571 | 2.478 | 1.336 |
| 2017-01-09 | 0.766 | 1.565 | 3.265 | 5.591 | 2.501 | 1.35 |
| 2017-01-10 | 0.767 | 1.555 | 3.276 | 5.629 | 2.5 | 1.346 |
| 2017-01-11 | 0.736 | 1.509 | 3.204 | 5.601 | 2.45 | 1.304 |
| 2017-01-12 | 0.743 | 1.491 | 3.207 | 5.571 | 2.439 | 1.288 |
| 2017-01-13 | 0.743 | 1.491 | 3.207 | 5.571 | 2.439 | 1.288 |
| 2017-01-14 | 0.743 | 1.491 | 3.207 | 5.571 | 2.439 | 1.288 |
| 2017-01-15 | 0.722 | 1.516 | 3.156 | 5.579 | 2.455 | 1.28 |
| 2017-01-16 | 0.74 | 1.523 | 3.171 | 5.566 | 2.47 | 1.305 |
| 2017-01-17 | 0.712 | 1.558 | 3.14 | 5.61 | 2.476 | 1.306 |
| 2017-01-18 | 0.749 | 1.569 | 3.099 | 5.625 | 2.479 | 1.305 |
| 2017-01-19 | 0.768 | 1.57 | 3.044 | 5.57 | 2.479 | 1.315 |
| 2017-01-20 | 0.768 | 1.57 | 3.044 | 5.57 | 2.479 | 1.315 |
| 2017-01-21 | 0.768 | 1.57 | 3.044 | 5.57 | 2.479 | 1.315 |
| 2017-01-22 | 0.769 | 1.559 | 3.163 | 5.538 | 2.481 | 1.305 |
| 2017-01-23 | 0.771 | 1.558 | 3.185 | 5.535 | 2.507 | 1.357 |
| 2017-01-24 | 0.744 | 1.565 | 3.156 | 5.52 | 2.493 | 1.342 |
| 2017-01-25 | 0.748 | 1.564 | 3.123 | 5.501 | 2.481 | 1.335 |
| 2017-01-26 | 0.727 | 1.552 | 3.114 | 5.473 | 2.476 | 1.327 |
| 2017-01-27 | 0.727 | 1.552 | 3.114 | 5.473 | 2.476 | 1.327 |
| 2017-01-28 | 0.727 | 1.552 | 3.114 | 5.473 | 2.476 | 1.327 |
| 2017-01-29 | 0.757 | 1.568 | 3.168 | 5.497 | 2.504 | 1.359 |
| 2017-01-30 | 0.738 | 1.58 | 3.17 | 5.493 | 2.524 | 1.392 |
| 2017-01-31 | 0.713 | 1.54 | 3.151 | 5.493 | 2.453 | 1.375 |
| 2017-02-01 | 0.673 | 1.488 | 3.108 | 5.245 | 2.409 | 1.355 |
| 2017-02-02 | 0.66 | 1.48 | 3.101 | 5.447 | 2.408 | 1.359 |
| 2017-02-03 | 0.66 | 1.48 | 3.101 | 5.447 | 2.408 | 1.359 |
| 2017-02-04 | 0.66 | 1.48 | 3.101 | 5.447 | 2.408 | 1.359 |
| 2017-02-05 | 0.675 | 1.49 | 3.093 | 5.423 | 2.398 | 1.331 |
| 2017-02-06 | 0.701 | 1.501 | 3.089 | 5.434 | 2.402 | 1.317 |
| 2017-02-07 | 0.685 | 1.463 | 3.069 | 5.395 | 2.362 | 1.299 |
| 2017-02-08 | 0.679 | 1.465 | 3.08 | 5.376 | 2.346 | 1.297 |
| 2017-02-09 | 0.674 | 1.47 | 3.081 | 5.402 | 2.367 | 1.323 |
| 2017-02-10 | 0.674 | 1.47 | 3.081 | 5.402 | 2.367 | 1.323 |
| 2017-02-11 | 0.674 | 1.47 | 3.081 | 5.402 | 2.367 | 1.323 |
| 2017-02-12 | 0.71 | 1.465 | 3.045 | 5.396 | 2.374 | 1.3 |
| 2017-02-13 | 0.714 | 1.442 | 3.004 | 5.364 | 2.371 | 1.293 |
| 2017-02-14 | 0.689 | 1.413 | 2.989 | 5.153 | 2.344 | 1.266 |
| 2017-02-15 | 0.716 | 1.42 | 2.968 | 5.136 | 2.358 | 1.273 |
| 2017-02-16 | 0.72 | 1.447 | 2.986 | 5.166 | 2.393 | 1.291 |
| 2017-02-17 | 0.72 | 1.447 | 2.986 | 5.166 | 2.393 | 1.291 |
| 2017-02-18 | 0.72 | 1.447 | 2.986 | 5.166 | 2.393 | 1.291 |
| 2017-02-19 | 0.751 | 1.461 | 3.009 | 5.224 | 2.417 | 1.323 |
| 2017-02-20 | 0.756 | 1.466 | 3.01 | 5.266 | 2.426 | 1.326 |
| 2017-02-21 | 0.739 | 1.486 | 2.966 | 5.313 | 2.436 | 1.314 |
| 2017-02-22 | 0.69 | 1.454 | 2.924 | 5.273 | 2.403 | 1.294 |
| 2017-02-23 | 0.727 | 1.498 | 2.937 | 5.283 | 2.438 | 1.32 |
| 2017-02-24 | 0.727 | 1.498 | 2.937 | 5.283 | 2.438 | 1.32 |
| 2017-02-25 | 0.727 | 1.498 | 2.937 | 5.283 | 2.438 | 1.32 |
| 2017-02-26 | 0.746 | 1.51 | 2.927 | 5.195 | 2.448 | 1.332 |
| 2017-02-27 | 0.681 | 1.463 | 2.873 | 5.233 | 2.41 | 1.278 |
| 2017-02-28 | 0.693 | 1.435 | 2.873 | 5.433 | 2.376 | 1.261 |
| 2017-03-01 | 0.675 | 1.41 | 2.852 | 5.391 | 2.348 | 1.223 |
| 2017-03-02 | 0.677 | 1.389 | 2.843 | 5.379 | 2.346 | 1.225 |
| 2017-03-03 | 0.677 | 1.389 | 2.843 | 5.379 | 2.346 | 1.225 |
| 2017-03-04 | 0.677 | 1.389 | 2.843 | 5.379 | 2.346 | 1.225 |
| 2017-03-05 | 0.676 | 1.379 | 2.826 | 5.337 | 1.855 | 1.203 |
| 2017-03-06 | 0.686 | 1.369 | 2.859 | 5.369 | 1.881 | 1.237 |
| 2017-03-07 | 0.69 | 1.367 | 2.839 | 5.415 | 1.891 | 1.232 |
| 2017-03-08 | 0.699 | 1.37 | 2.83 | 5.445 | 1.925 | 1.224 |
| 2017-03-09 | 0.684 | 1.359 | 2.824 | 5.447 | 1.911 | 1.227 |
| 2017-03-10 | 0.684 | 1.359 | 2.824 | 5.447 | 1.911 | 1.227 |
| 2017-03-11 | 0.684 | 1.359 | 2.824 | 5.447 | 1.911 | 1.227 |
| 2017-03-12 | 0.684 | 1.359 | 2.824 | 5.447 | 1.911 | 1.227 |
| 2017-03-13 | 0.731 | 1.312 | 2.765 | 5.447 | 1.863 | 1.213 |
| 2017-03-14 | 0.729 | 1.306 | 2.802 | 5.398 | 1.848 | 1.233 |
| 2017-03-15 | 0.734 | 1.301 | 2.835 | 5.396 | 1.858 | 1.257 |
| 2017-03-16 | 0.72 | 1.309 | 2.832 | 5.463 | 1.857 | 1.231 |
| 2017-03-17 | 0.72 | 1.309 | 2.832 | 5.463 | 1.857 | 1.231 |
| 2017-03-18 | 0.72 | 1.309 | 2.832 | 5.463 | 1.857 | 1.231 |
| 2017-03-19 | 0.712 | 1.349 | 2.809 | 5.513 | 1.836 | 1.211 |
| 2017-03-20 | 0.75 | 1.351 | 2.834 | 5.539 | 1.849 | 1.225 |
| 2017-03-21 | 0.776 | 1.371 | 2.841 | 5.573 | 1.875 | 1.25 |
| 2017-03-22 | 0.803 | 1.391 | 2.862 | 5.636 | 1.912 | 1.242 |
| 2017-03-23 | 0.787 | 1.354 | 2.851 | 5.875 | 1.886 | 1.202 |
| 2017-03-24 | 0.787 | 1.354 | 2.851 | 5.875 | 1.886 | 1.202 |
| 2017-03-25 | 0.787 | 1.354 | 2.851 | 5.875 | 1.886 | 1.202 |
| 2017-03-26 | 0.777 | 1.355 | 2.864 | 5.939 | 1.892 | 1.208 |
| 2017-03-27 | 0.77 | 1.352 | 2.877 | 6.293 | 1.899 | 1.206 |
| 2017-03-28 | 0.817 | 1.377 | 2.901 | 6.381 | 1.917 | 1.222 |
| 2017-03-29 | 0.843 | 1.394 | 2.889 | 6.332 | 1.946 | 1.264 |
| 2017-03-30 | 0.807 | 1.37 | 2.911 | 6.3 | 1.94 | 1.241 |
| 2017-03-31 | 0.807 | 1.37 | 2.911 | 6.3 | 1.94 | 1.241 |
| 2017-04-01 | 0.807 | 1.37 | 2.911 | 6.3 | 1.94 | 1.241 |
| 2017-04-02 | 0.805 | 1.365 | 2.933 | 6.291 | 1.934 | 1.248 |
| 2017-04-03 | 0.809 | 1.375 | 2.931 | 6.283 | 1.93 | 1.249 |
| 2017-04-04 | 0.74 | 1.323 | 2.886 | 6.101 | 1.871 | 1.195 |
| 2017-04-05 | 0.797 | 1.362 | 2.854 | 6.092 | 1.896 | 1.246 |
| 2017-04-06 | 0.788 | 1.339 | 2.824 | 6.052 | 1.897 | 1.227 |
| 2017-04-07 | 0.788 | 1.339 | 2.824 | 6.052 | 1.897 | 1.227 |
| 2017-04-08 | 0.788 | 1.339 | 2.824 | 6.052 | 1.897 | 1.227 |
| 2017-04-09 | 0.791 | 1.345 | 2.81 | 6.104 | 1.931 | 1.227 |
| 2017-04-10 | 0.791 | 1.345 | 2.81 | 6.104 | 1.931 | 1.227 |
| 2017-04-11 | 0.791 | 1.345 | 2.81 | 6.104 | 1.931 | 1.227 |
| 2017-04-12 | 0.778 | 1.347 | 2.834 | 6.086 | 1.984 | 1.25 |
| 2017-04-13 | 0.791 | 1.355 | 2.855 | 6.124 | 2.011 | 1.254 |
| 2017-04-14 | 0.791 | 1.355 | 2.855 | 6.124 | 2.011 | 1.254 |
| 2017-04-15 | 0.791 | 1.355 | 2.855 | 6.124 | 2.011 | 1.254 |
| 2017-04-16 | 0.791 | 1.355 | 2.855 | 6.124 | 2.011 | 1.254 |
| 2017-04-17 | 0.791 | 1.355 | 2.855 | 6.124 | 2.011 | 1.254 |
| 2017-04-18 | 0.81 | 1.405 | 2.845 | 6.247 | 2.021 | 1.287 |
| 2017-04-19 | 0.787 | 1.374 | 2.83 | 6.264 | 1.91 | 1.298 |
| 2017-04-20 | 0.788 | 1.365 | 2.807 | 6.256 | 1.887 | 1.282 |
| 2017-04-21 | 0.788 | 1.365 | 2.807 | 6.256 | 1.887 | 1.282 |
| 2017-04-22 | 0.788 | 1.365 | 2.807 | 6.256 | 1.887 | 1.282 |
| 2017-04-23 | 0.787 | 1.347 | 2.811 | 6.245 | 1.883 | 1.254 |
| 2017-04-24 | 0.804 | 1.373 | 2.807 | 6.234 | 1.904 | 1.274 |
| 2017-04-25 | 0.791 | 1.355 | 2.822 | 6.183 | 1.886 | 1.265 |
| 2017-04-26 | 0.755 | 1.337 | 2.792 | 6.122 | 1.874 | 1.254 |
| 2017-04-27 | 0.75 | 1.33 | 2.775 | 6.158 | 1.865 | 1.26 |
| 2017-04-28 | 0.75 | 1.33 | 2.775 | 6.158 | 1.865 | 1.26 |
| 2017-04-29 | 0.75 | 1.33 | 2.775 | 6.158 | 1.865 | 1.26 |
| 2017-04-30 | 0.802 | 1.358 | 2.777 | 6.222 | 1.895 | 1.269 |
| 2017-05-01 | 0.802 | 1.358 | 2.777 | 6.222 | 1.895 | 1.269 |
| 2017-05-02 | 0.802 | 1.358 | 2.777 | 6.222 | 1.895 | 1.269 |
| 2017-05-03 | 0.786 | 1.342 | 2.727 | 6.193 | 1.768 | 1.24 |
| 2017-05-04 | 0.781 | 1.308 | 2.66 | 6.155 | 1.746 | 1.196 |
| 2017-05-05 | 0.781 | 1.308 | 2.66 | 6.155 | 1.746 | 1.196 |
| 2017-05-06 | 0.781 | 1.308 | 2.66 | 6.155 | 1.746 | 1.196 |
| 2017-05-07 | 0.79 | 1.316 | 2.635 | 6.217 | 1.742 | 1.2 |
| 2017-05-08 | 0.802 | 1.318 | 2.632 | 6.217 | 1.75 | 1.215 |
| 2017-05-09 | 0.817 | 1.33 | 2.569 | 6.219 | 1.743 | 1.225 |
| 2017-05-10 | 0.808 | 1.33 | 2.555 | 6.179 | 1.743 | 1.227 |
| 2017-05-11 | 0.775 | 1.293 | 2.562 | 6.152 | 1.707 | 1.201 |
| 2017-05-12 | 0.775 | 1.293 | 2.562 | 6.152 | 1.707 | 1.201 |
| 2017-05-13 | 0.775 | 1.293 | 2.562 | 6.152 | 1.707 | 1.201 |
| 2017-05-14 | 0.774 | 1.3 | 2.599 | 6.086 | 1.691 | 1.203 |
| 2017-05-15 | 0.762 | 1.281 | 2.597 | 6.061 | 1.688 | 1.188 |
| 2017-05-16 | 0.769 | 1.268 | 2.639 | 6.043 | 1.693 | 1.165 |
| 2017-05-17 | 0.799 | 1.317 | 2.722 | 6.144 | 1.769 | 1.208 |
| 2017-05-18 | 0.789 | 1.429 | 2.821 | 6.261 | 1.958 | 1.258 |
| 2017-05-19 | 0.789 | 1.429 | 2.821 | 6.261 | 1.958 | 1.258 |
| 2017-05-20 | 0.789 | 1.429 | 2.821 | 6.261 | 1.958 | 1.258 |
| 2017-05-21 | 0.783 | 1.425 | 2.702 | 6.213 | 1.937 | 1.254 |
| 2017-05-22 | 0.753 | 1.38 | 2.691 | 6.167 | 1.91 | 1.22 |
| 2017-05-23 | 0.749 | 1.364 | 2.729 | 6.117 | 1.903 | 1.229 |
| 2017-05-24 | 0.712 | 1.364 | 2.745 | 6.058 | 1.88 | 1.217 |
| 2017-05-25 | 0.719 | 1.349 | 2.708 | 6.039 | 1.86 | 1.209 |
| 2017-05-26 | 0.719 | 1.349 | 2.708 | 6.039 | 1.86 | 1.209 |
| 2017-05-27 | 0.719 | 1.349 | 2.708 | 6.039 | 1.86 | 1.209 |
| 2017-05-28 | 0.724 | 1.314 | 2.7 | 5.957 | 1.832 | 1.175 |
| 2017-05-29 | 0.717 | 1.307 | 2.665 | 5.972 | 1.82 | 1.165 |
| 2017-05-30 | 0.717 | 1.307 | 2.665 | 5.972 | 1.82 | 1.165 |
| 2017-05-31 | 0.717 | 1.307 | 2.665 | 5.972 | 1.82 | 1.165 |
| 2017-06-01 | 0.743 | 1.278 | 2.693 | 5.996 | 1.848 | 1.151 |
| 2017-06-02 | 0.743 | 1.278 | 2.693 | 5.996 | 1.848 | 1.151 |
| 2017-06-03 | 0.743 | 1.278 | 2.693 | 5.996 | 1.848 | 1.151 |
| 2017-06-04 | 0.72 | 1.277 | 2.64 | 6.033 | 1.833 | 1.138 |
| 2017-06-05 | 0.688 | 1.25 | 2.625 | 5.941 | 1.813 | 1.135 |
| 2017-06-06 | 0.692 | 1.221 | 2.577 | 5.923 | 1.799 | 1.126 |
| 2017-06-07 | 0.704 | 1.228 | 2.507 | 5.739 | 1.794 | 1.127 |
| 2017-06-08 | 0.716 | 1.233 | 2.51 | 5.748 | 1.799 | 1.113 |
| 2017-06-09 | 0.716 | 1.233 | 2.51 | 5.748 | 1.799 | 1.113 |
| 2017-06-10 | 0.716 | 1.233 | 2.51 | 5.748 | 1.799 | 1.113 |
| 2017-06-11 | 0.721 | 1.239 | 2.472 | 5.755 | 1.805 | 1.11 |
| 2017-06-12 | 0.74 | 1.3 | 2.507 | 5.869 | 1.854 | 1.141 |
| 2017-06-13 | 0.732 | 1.308 | 2.515 | 5.922 | 1.868 | 1.157 |
| 2017-06-14 | 0.736 | 1.308 | 2.535 | 5.94 | 1.889 | 1.198 |
| 2017-06-15 | 0.744 | 1.29 | 2.595 | 5.963 | 1.896 | 1.174 |
| 2017-06-16 | 0.744 | 1.29 | 2.595 | 5.963 | 1.896 | 1.174 |
| 2017-06-17 | 0.744 | 1.29 | 2.595 | 5.963 | 1.896 | 1.174 |
| 2017-06-18 | 0.706 | 1.213 | 2.532 | 5.886 | 1.859 | 1.148 |
| 2017-06-19 | 0.684 | 1.198 | 2.484 | 5.835 | 1.809 | 1.111 |
| 2017-06-20 | 0.684 | 1.212 | 2.506 | 5.881 | 1.745 | 1.109 |
| 2017-06-21 | 0.702 | 1.231 | 2.521 | 5.891 | 1.751 | 1.11 |
| 2017-06-22 | 0.711 | 1.256 | 2.551 | 5.941 | 1.765 | 1.115 |
| 2017-06-23 | 0.711 | 1.256 | 2.551 | 5.941 | 1.765 | 1.115 |
| 2017-06-24 | 0.711 | 1.256 | 2.551 | 5.941 | 1.765 | 1.115 |
| 2017-06-25 | 0.743 | 1.353 | 2.567 | 5.925 | 1.773 | 1.14 |
| 2017-06-26 | 0.703 | 1.321 | 2.569 | 5.905 | 1.757 | 1.137 |
| 2017-06-27 | 0.713 | 1.34 | 2.56 | 5.888 | 1.75 | 1.108 |
| 2017-06-28 | 0.744 | 1.393 | 2.66 | 5.99 | 1.861 | 1.139 |
| 2017-06-29 | 0.72 | 1.363 | 2.666 | 6.001 | 1.848 | 1.12 |
| 2017-06-30 | 0.72 | 1.363 | 2.666 | 6.001 | 1.848 | 1.12 |
| 2017-07-01 | 0.72 | 1.363 | 2.666 | 6.001 | 1.848 | 1.12 |
| 2017-07-02 | 0.683 | 1.321 | 2.606 | 6.014 | 1.83 | 1.096 |
| 2017-07-03 | 0.679 | 1.336 | 2.642 | 6.029 | 1.849 | 1.122 |
| 2017-07-04 | 0.69 | 1.358 | 2.649 | 6.052 | 1.867 | 1.135 |
| 2017-07-05 | 0.661 | 1.36 | 2.626 | 6.043 | 1.861 | 1.113 |
| 2017-07-06 | 0.667 | 1.38 | 2.606 | 6.097 | 1.88 | 1.114 |
| 2017-07-07 | 0.667 | 1.38 | 2.606 | 6.097 | 1.88 | 1.114 |
| 2017-07-08 | 0.667 | 1.38 | 2.606 | 6.097 | 1.88 | 1.114 |
| 2017-07-09 | 0.675 | 1.382 | 2.626 | 6.117 | 1.877 | 1.116 |
| 2017-07-10 | 0.69 | 1.41 | 2.625 | 6.167 | 1.897 | 1.124 |
| 2017-07-11 | 0.71 | 1.49 | 2.648 | 6.231 | 1.938 | 1.157 |
| 2017-07-12 | 0.692 | 1.59 | 2.646 | 6.333 | 1.939 | 1.134 |
| 2017-07-13 | 0.702 | 1.664 | 2.622 | 6.358 | 1.928 | 1.12 |
| 2017-07-14 | 0.702 | 1.664 | 2.622 | 6.358 | 1.928 | 1.12 |
| 2017-07-15 | 0.702 | 1.664 | 2.622 | 6.358 | 1.928 | 1.12 |
| 2017-07-16 | 0.679 | 1.681 | 2.589 | 6.247 | 1.907 | 1.087 |
| 2017-07-17 | 0.673 | 1.67 | 2.554 | 6.317 | 1.911 | 1.079 |
| 2017-07-18 | 0.691 | 1.626 | 2.559 | 6.492 | 1.912 | 1.084 |
| 2017-07-19 | 0.667 | 1.582 | 2.518 | 6.458 | 1.898 | 1.062 |
| 2017-07-20 | 0.65 | 1.624 | 2.528 | 6.545 | 1.91 | 1.064 |
| 2017-07-21 | 0.65 | 1.624 | 2.528 | 6.545 | 1.91 | 1.064 |
| 2017-07-22 | 0.65 | 1.624 | 2.528 | 6.545 | 1.91 | 1.064 |
| 2017-07-23 | 0.645 | 1.577 | 2.5 | 6.453 | 1.897 | 1.069 |
| 2017-07-24 | 0.647 | 1.567 | 2.455 | 6.453 | 1.891 | 1.059 |
| 2017-07-25 | 0.672 | 1.636 | 2.489 | 6.491 | 1.914 | 1.079 |
| 2017-07-26 | 0.671 | 1.656 | 2.505 | 6.594 | 1.916 | 1.094 |
| 2017-07-27 | 0.664 | 1.639 | 2.477 | 6.618 | 1.933 | 1.104 |
| 2017-07-28 | 0.664 | 1.639 | 2.477 | 6.618 | 1.933 | 1.104 |
| 2017-07-29 | 0.664 | 1.639 | 2.477 | 6.618 | 1.933 | 1.104 |
| 2017-07-30 | 0.67 | 1.582 | 2.479 | 6.542 | 1.942 | 1.111 |
| 2017-07-31 | 0.648 | 1.648 | 2.469 | 6.496 | 1.936 | 1.087 |
| 2017-08-01 | 0.648 | 1.648 | 2.469 | 6.496 | 1.936 | 1.087 |
| 2017-08-02 | 0.622 | 1.619 | 2.44 | 6.476 | 1.927 | 1.074 |
| 2017-08-03 | 0.631 | 1.639 | 2.523 | 6.467 | 1.952 | 1.107 |
| 2017-08-04 | 0.631 | 1.639 | 2.523 | 6.467 | 1.952 | 1.107 |
| 2017-08-05 | 0.631 | 1.639 | 2.523 | 6.467 | 1.952 | 1.107 |
| 2017-08-06 | 0.648 | 1.654 | 2.529 | 6.515 | 1.967 | 1.127 |
| 2017-08-07 | 0.638 | 1.664 | 2.507 | 6.526 | 1.95 | 1.114 |
| 2017-08-08 | 0.656 | 1.674 | 2.544 | 6.609 | 1.962 | 1.12 |
| 2017-08-09 | 0.657 | 1.704 | 2.555 | 6.71 | 1.979 | 1.12 |
| 2017-08-10 | 0.633 | 1.73 | 2.571 | 6.762 | 1.992 | 1.11 |
| 2017-08-11 | 0.633 | 1.73 | 2.571 | 6.762 | 1.992 | 1.11 |
| 2017-08-12 | 0.633 | 1.73 | 2.571 | 6.762 | 1.992 | 1.11 |
| 2017-08-13 | 0.644 | 1.713 | 2.557 | 6.802 | 1.979 | 1.118 |
| 2017-08-14 | 0.644 | 1.721 | 2.511 | 6.785 | 1.954 | 1.099 |
| 2017-08-15 | 0.644 | 1.669 | 2.501 | 6.801 | 1.951 | 1.113 |
| 2017-08-16 | 0.624 | 1.608 | 2.488 | 6.758 | 1.939 | 1.098 |
| 2017-08-17 | 0.613 | 1.514 | 2.485 | 6.735 | 1.92 | 1.1 |
| 2017-08-18 | 0.613 | 1.514 | 2.485 | 6.735 | 1.92 | 1.1 |
| 2017-08-19 | 0.613 | 1.514 | 2.485 | 6.735 | 1.92 | 1.1 |
| 2017-08-20 | 0.598 | 1.471 | 2.494 | 6.728 | 1.91 | 1.078 |
| 2017-08-21 | 0.598 | 1.503 | 2.493 | 6.807 | 1.905 | 1.08 |
| 2017-08-22 | 0.601 | 1.533 | 2.48 | 6.823 | 1.919 | 1.086 |
| 2017-08-23 | 0.582 | 1.574 | 2.527 | 6.837 | 1.923 | 1.079 |
| 2017-08-24 | 0.572 | 1.525 | 2.534 | 6.838 | 1.906 | 1.061 |
| 2017-08-25 | 0.572 | 1.525 | 2.534 | 6.838 | 1.906 | 1.061 |
| 2017-08-26 | 0.572 | 1.525 | 2.534 | 6.838 | 1.906 | 1.061 |
| 2017-08-27 | 0.587 | 1.535 | 2.557 | 5.543 | 1.909 | 1.065 |
| 2017-08-28 | 0.59 | 1.48 | 2.54 | 5.422 | 1.902 | 1.039 |
| 2017-08-29 | 0.628 | 1.517 | 2.541 | 5.466 | 1.924 | 1.044 |
| 2017-08-30 | 0.594 | 1.531 | 2.495 | 5.46 | 1.91 | 1.031 |
| 2017-08-31 | 0.633 | 1.522 | 2.442 | 5.529 | 1.913 | 1.01 |
| 2017-09-01 | 0.633 | 1.522 | 2.442 | 5.529 | 1.913 | 1.01 |
| 2017-09-02 | 0.633 | 1.522 | 2.442 | 5.529 | 1.913 | 1.01 |
| 2017-09-03 | 0.643 | 1.504 | 2.456 | 5.588 | 1.922 | 1.012 |
| 2017-09-04 | 0.637 | 1.5 | 2.416 | 5.586 | 1.905 | 1.023 |
| 2017-09-05 | 0.62 | 1.488 | 2.395 | 5.598 | 1.871 | 1.025 |
| 2017-09-06 | 0.61 | 1.439 | 2.386 | 5.592 | 1.863 | 1.015 |
| 2017-09-07 | 0.599 | 1.404 | 2.342 | 5.557 | 1.824 | 1.001 |
| 2017-09-08 | 0.599 | 1.404 | 2.342 | 5.557 | 1.824 | 1.001 |
| 2017-09-09 | 0.599 | 1.404 | 2.342 | 5.557 | 1.824 | 1.001 |
| 2017-09-10 | 0.623 | 1.438 | 2.354 | 5.622 | 1.839 | 1.014 |
| 2017-09-11 | 0.625 | 1.442 | 2.338 | 5.695 | 1.841 | 1.03 |
| 2017-09-12 | 0.62 | 1.451 | 2.296 | 5.646 | 1.841 | 1.032 |
| 2017-09-13 | 0.652 | 1.454 | 2.242 | 5.643 | 1.855 | 1.067 |
| 2017-09-14 | 0.627 | 1.364 | 2.244 | 5.633 | 1.867 | 1.024 |
| 2017-09-15 | 0.627 | 1.364 | 2.244 | 5.633 | 1.867 | 1.024 |
| 2017-09-16 | 0.627 | 1.364 | 2.244 | 5.633 | 1.867 | 1.024 |
| 2017-09-17 | 0.555 | 1.308 | 2.162 | 5.54 | 1.749 | 0.963 |
| 2017-09-18 | 0.566 | 1.354 | 2.204 | 5.518 | 1.76 | 0.968 |
| 2017-09-19 | 0.576 | 1.394 | 2.204 | 5.48 | 1.763 | 0.988 |
| 2017-09-20 | 0.576 | 1.394 | 2.204 | 5.48 | 1.763 | 0.988 |
| 2017-09-21 | 0.576 | 1.394 | 2.204 | 5.48 | 1.763 | 0.988 |
| 2017-09-22 | 0.576 | 1.394 | 2.204 | 5.48 | 1.763 | 0.988 |
| 2017-09-23 | 0.576 | 1.394 | 2.204 | 5.48 | 1.763 | 0.988 |
| 2017-09-24 | 0.594 | 1.403 | 2.222 | 5.503 | 1.775 | 0.989 |
| 2017-09-25 | 0.534 | 1.368 | 2.165 | 5.345 | 1.722 | 0.927 |
| 2017-09-26 | 0.581 | 1.385 | 2.177 | 5.321 | 1.799 | 0.954 |
| 2017-09-27 | 0.543 | 1.343 | 2.16 | 5.343 | 1.778 | 0.929 |
| 2017-09-28 | 0.54 | 1.339 | 2.193 | 5.409 | 1.791 | 0.963 |
| 2017-09-29 | 0.54 | 1.339 | 2.193 | 5.409 | 1.791 | 0.963 |
| 2017-09-30 | 0.54 | 1.339 | 2.193 | 5.409 | 1.791 | 0.963 |
| 2017-10-01 | 0.573 | 1.306 | 2.181 | 5.447 | 1.809 | 0.967 |
| 2017-10-02 | 0.606 | 1.317 | 2.219 | 5.48 | 1.838 | 0.961 |
| 2017-10-03 | 0.591 | 1.244 | 2.204 | 5.702 | 1.835 | 0.965 |
| 2017-10-04 | 0.591 | 1.244 | 2.204 | 5.702 | 1.835 | 0.965 |
| 2017-10-05 | 0.591 | 1.244 | 2.204 | 5.702 | 1.835 | 0.965 |
| 2017-10-06 | 0.591 | 1.244 | 2.204 | 5.702 | 1.835 | 0.965 |
| 2017-10-07 | 0.591 | 1.244 | 2.204 | 5.702 | 1.835 | 0.965 |
| 2017-10-08 | 0.585 | 1.219 | 2.195 | 5.782 | 1.836 | 0.96 |
| 2017-10-09 | 0.559 | 1.199 | 2.135 | 5.798 | 1.813 | 0.926 |
| 2017-10-10 | 0.548 | 1.198 | 2.146 | 5.78 | 1.787 | 0.897 |
| 2017-10-11 | 0.548 | 1.198 | 2.146 | 5.78 | 1.787 | 0.897 |
| 2017-10-12 | 0.548 | 1.198 | 2.146 | 5.78 | 1.787 | 0.897 |
| 2017-10-13 | 0.548 | 1.198 | 2.146 | 5.78 | 1.787 | 0.897 |
| 2017-10-14 | 0.548 | 1.198 | 2.146 | 5.78 | 1.787 | 0.897 |
| 2017-10-15 | 0.544 | 1.201 | 2.13 | 5.799 | 1.78 | 0.887 |
| 2017-10-16 | 0.496 | 1.161 | 2.105 | 5.735 | 1.745 | 0.868 |
| 2017-10-17 | 0.5 | 1.134 | 2.075 | 5.749 | 1.747 | 0.862 |
| 2017-10-18 | 0.472 | 1.132 | 2.042 | 5.694 | 1.708 | 0.831 |
| 2017-10-19 | 0.546 | 1.209 | 2.019 | 5.877 | 1.668 | 0.851 |
| 2017-10-20 | 0.546 | 1.209 | 2.019 | 5.877 | 1.668 | 0.851 |
| 2017-10-21 | 0.546 | 1.209 | 2.019 | 5.877 | 1.668 | 0.851 |
| 2017-10-22 | 0.561 | 1.235 | 1.997 | 5.842 | 1.763 | 0.876 |
| 2017-10-23 | 0.584 | 1.27 | 2.023 | 5.889 | 1.683 | 0.891 |
| 2017-10-24 | 0.616 | 1.308 | 2.021 | 5.92 | 1.71 | 0.909 |
| 2017-10-25 | 0.618 | 1.328 | 2.039 | 5.949 | 1.712 | 0.915 |
| 2017-10-26 | 0.646 | 1.382 | 2.049 | 6.12 | 1.751 | 0.941 |
| 2017-10-27 | 0.646 | 1.382 | 2.049 | 6.12 | 1.751 | 0.941 |
| 2017-10-28 | 0.646 | 1.382 | 2.049 | 6.12 | 1.751 | 0.941 |
| 2017-10-29 | 0.658 | 1.402 | 2.085 | 6.193 | 1.76 | 0.958 |
| 2017-10-30 | 0.674 | 1.424 | 2.131 | 6.219 | 1.772 | 0.976 |
| 2017-10-31 | 0.675 | 1.439 | 2.156 | 6.245 | 1.772 | 0.987 |
| 2017-11-01 | 0.653 | 1.417 | 2.167 | 6.16 | 1.739 | 0.944 |
| 2017-11-02 | 0.626 | 1.361 | 2.19 | 6.151 | 1.731 | 0.896 |
| 2017-11-03 | 0.626 | 1.361 | 2.19 | 6.151 | 1.731 | 0.896 |
| 2017-11-04 | 0.626 | 1.361 | 2.19 | 6.151 | 1.731 | 0.896 |
| 2017-11-05 | 0.637 | 1.367 | 2.237 | 6.174 | 1.743 | 0.901 |
| 2017-11-06 | 0.665 | 1.422 | 2.214 | 6.214 | 1.766 | 0.962 |
| 2017-11-07 | 0.665 | 1.378 | 2.197 | 6.186 | 1.768 | 0.938 |
| 2017-11-08 | 0.659 | 1.348 | 2.211 | 6.161 | 1.739 | 0.921 |
| 2017-11-09 | 0.656 | 1.354 | 2.226 | 6.202 | 1.731 | 0.891 |
| 2017-11-10 | 0.656 | 1.354 | 2.226 | 6.202 | 1.731 | 0.891 |
| 2017-11-11 | 0.656 | 1.354 | 2.226 | 6.202 | 1.731 | 0.891 |
| 2017-11-12 | 0.634 | 1.318 | 2.223 | 6.207 | 1.74 | 0.875 |
| 2017-11-13 | 0.617 | 1.33 | 2.212 | 6.221 | 1.747 | 0.891 |
| 2017-11-14 | 0.646 | 1.398 | 2.199 | 6.409 | 1.787 | 0.941 |
| 2017-11-15 | 0.683 | 1.46 | 2.218 | 6.53 | 1.825 | 0.987 |
| 2017-11-16 | 0.677 | 1.464 | 2.24 | 6.584 | 1.848 | 1.043 |
| 2017-11-17 | 0.677 | 1.464 | 2.24 | 6.584 | 1.848 | 1.043 |
| 2017-11-18 | 0.677 | 1.464 | 2.24 | 6.584 | 1.848 | 1.043 |
| 2017-11-19 | 0.676 | 1.491 | 2.143 | 6.655 | 1.829 | 1.015 |
| 2017-11-20 | 0.69 | 1.495 | 2.11 | 6.652 | 1.822 | 1.026 |
| 2017-11-21 | 0.695 | 1.486 | 2.143 | 6.528 | 1.832 | 1.03 |
| 2017-11-22 | 0.696 | 1.541 | 2.139 | 6.56 | 1.837 | 1.041 |
| 2017-11-23 | 0.668 | 1.56 | 2.104 | 6.584 | 1.826 | 1.012 |
| 2017-11-24 | 0.668 | 1.56 | 2.104 | 6.584 | 1.826 | 1.012 |
| 2017-11-25 | 0.668 | 1.56 | 2.104 | 6.584 | 1.826 | 1.012 |
| 2017-11-26 | 0.664 | 1.557 | 2.059 | 6.621 | 1.801 | 0.993 |
| 2017-11-27 | 0.643 | 1.494 | 2.044 | 6.639 | 1.787 | 0.941 |
| 2017-11-28 | 0.638 | 1.462 | 2.05 | 6.624 | 1.776 | 0.958 |
| 2017-11-29 | 0.621 | 1.442 | 2.027 | 6.579 | 1.757 | 0.946 |
| 2017-11-30 | 0.66 | 1.486 | 2.052 | 6.626 | 1.789 | 0.986 |
| 2017-12-01 | 0.66 | 1.486 | 2.052 | 6.626 | 1.789 | 0.986 |
| 2017-12-02 | 0.66 | 1.486 | 2.052 | 6.626 | 1.789 | 0.986 |
| 2017-12-03 | 0.667 | 1.499 | 2.015 | 6.687 | 1.793 | 0.977 |
| 2017-12-04 | 0.678 | 1.513 | 2.017 | 6.702 | 1.782 | 0.983 |
| 2017-12-05 | 0.682 | 1.482 | 2.021 | 6.681 | 1.786 | 0.986 |
| 2017-12-06 | 0.674 | 1.484 | 2.026 | 6.68 | 1.777 | 0.967 |
| 2017-12-07 | 0.649 | 1.46 | 2.013 | 6.659 | 1.765 | 0.931 |
| 2017-12-08 | 0.649 | 1.46 | 2.013 | 6.659 | 1.765 | 0.931 |
| 2017-12-09 | 0.649 | 1.46 | 2.013 | 6.659 | 1.765 | 0.931 |
| 2017-12-10 | 0.661 | 1.451 | 2.023 | 6.851 | 1.765 | 0.949 |
| 2017-12-11 | 0.682 | 1.488 | 2.036 | 6.913 | 1.776 | 0.982 |
| 2017-12-12 | 0.705 | 1.484 | 2.042 | 6.975 | 1.786 | 0.99 |
| 2017-12-13 | 0.71 | 1.476 | 2.027 | 7.008 | 1.766 | 0.975 |
| 2017-12-14 | 0.723 | 1.531 | 2.052 | 7.059 | 1.78 | 0.979 |
| 2017-12-15 | 0.723 | 1.531 | 2.052 | 7.059 | 1.78 | 0.979 |
| 2017-12-16 | 0.723 | 1.531 | 2.052 | 7.059 | 1.78 | 0.979 |
| 2017-12-17 | 0.754 | 1.552 | 2.072 | 7.148 | 1.789 | 0.983 |
| 2017-12-18 | 0.7 | 1.49 | 2.069 | 7.061 | 1.759 | 0.964 |
| 2017-12-19 | 0.665 | 1.473 | 2.076 | 7.236 | 1.723 | 0.929 |
| 2017-12-20 | 0.692 | 1.495 | 2.116 | 7.256 | 1.75 | 0.94 |
| 2017-12-21 | 0.75 | 1.544 | 2.114 | 7.288 | 1.797 | 1.002 |
| 2017-12-22 | 0.75 | 1.544 | 2.114 | 7.288 | 1.797 | 1.002 |
| 2017-12-23 | 0.75 | 1.544 | 2.114 | 7.288 | 1.797 | 1.002 |
| 2017-12-24 | 0.76 | 1.563 | 2.093 | 7.287 | 1.746 | 1.008 |
| 2017-12-25 | 0.776 | 1.548 | 2.135 | 7.289 | 1.754 | 0.999 |
| 2017-12-26 | 0.774 | 1.537 | 2.131 | 7.255 | 1.748 | 1.011 |
| 2017-12-27 | 0.768 | 1.518 | 2.133 | 7.252 | 1.753 | 1.036 |
| 2017-12-28 | 0.765 | 1.486 | 2.093 | 7.16 | 1.724 | 1.031 |
| 2017-12-29 | 0.765 | 1.486 | 2.093 | 7.16 | 1.724 | 1.031 |
| 2017-12-30 | 0.765 | 1.486 | 2.093 | 7.16 | 1.724 | 1.031 |
| 2017-12-31 | 0.76 | 1.491 | 2.048 | 7.161 | 1.703 | 1.034 |
| 2018-01-01 | 0.751 | 1.468 | 2.054 | 7.174 | 1.7 | 1.027 |
| 2018-01-02 | 0.733 | 1.428 | 2 | 7.037 | 1.673 | 1.015 |
| 2018-01-03 | 0.707 | 1.385 | 1.951 | 6.974 | 1.649 | 0.981 |
| 2018-01-04 | 0.67 | 1.369 | 1.904 | 6.975 | 1.629 | 0.978 |
| 2018-01-05 | 0.67 | 1.369 | 1.904 | 6.975 | 1.629 | 0.978 |
| 2018-01-06 | 0.67 | 1.369 | 1.904 | 6.975 | 1.629 | 0.978 |
| 2018-01-07 | 0.644 | 1.348 | 1.905 | 6.997 | 1.608 | 0.977 |
| 2018-01-08 | 0.659 | 1.346 | 1.962 | 6.911 | 1.612 | 0.959 |
| 2018-01-09 | 0.676 | 1.351 | 1.949 | 7.03 | 1.597 | 0.952 |
| 2018-01-10 | 0.666 | 1.359 | 1.936 | 7.32 | 1.606 | 0.959 |
| 2018-01-11 | 0.646 | 1.358 | 1.929 | 7.265 | 1.609 | 0.975 |
| 2018-01-12 | 0.646 | 1.358 | 1.929 | 7.265 | 1.609 | 0.975 |
| 2018-01-13 | 0.646 | 1.358 | 1.929 | 7.265 | 1.609 | 0.975 |
| 2018-01-14 | 0.63 | 1.349 | 1.908 | 7.231 | 1.604 | 0.982 |
| 2018-01-15 | 0.602 | 1.345 | 1.89 | 7.264 | 1.585 | 0.985 |
| 2018-01-16 | 0.646 | 1.366 | 1.861 | 7.355 | 1.619 | 0.994 |
| 2018-01-17 | 0.672 | 1.379 | 1.876 | 7.453 | 1.723 | 0.993 |
| 2018-01-18 | 0.69 | 1.396 | 1.888 | 7.496 | 1.74 | 1.004 |
| 2018-01-19 | 0.69 | 1.396 | 1.888 | 7.496 | 1.74 | 1.004 |
| 2018-01-20 | 0.69 | 1.396 | 1.888 | 7.496 | 1.74 | 1.004 |
| 2018-01-21 | 0.713 | 1.424 | 1.887 | 4.99 | 1.673 | 1.042 |
| 2018-01-22 | 0.715 | 1.409 | 1.875 | 4.982 | 1.676 | 1.062 |
| 2018-01-23 | 0.735 | 1.404 | 1.836 | 4.948 | 1.675 | 1.053 |
| 2018-01-24 | 0.73 | 1.378 | 1.821 | 4.934 | 1.678 | 1.008 |
| 2018-01-25 | 0.76 | 1.417 | 1.863 | 4.958 | 1.696 | 1.022 |
| 2018-01-26 | 0.76 | 1.417 | 1.863 | 4.958 | 1.696 | 1.022 |
| 2018-01-27 | 0.76 | 1.417 | 1.863 | 4.958 | 1.696 | 1.022 |
| 2018-01-28 | 0.754 | 1.411 | 1.846 | 4.954 | 1.696 | 1.016 |
| 2018-01-29 | 0.778 | 1.426 | 1.879 | 5.051 | 1.715 | 1.013 |
| 2018-01-30 | 0.81 | 1.465 | 1.9 | 5.103 | 1.749 | 1.037 |
| 2018-01-31 | 0.852 | 1.525 | 1.941 | 5.163 | 1.789 | 1.074 |
| 2018-02-01 | 0.862 | 1.542 | 1.967 | 5.199 | 1.797 | 1.078 |
| 2018-02-02 | 0.862 | 1.542 | 1.967 | 5.199 | 1.797 | 1.078 |
| 2018-02-03 | 0.862 | 1.542 | 1.967 | 5.199 | 1.797 | 1.078 |
| 2018-02-04 | 0.893 | 1.579 | 1.998 | 5.298 | 1.839 | 1.134 |
| 2018-02-05 | 0.902 | 1.662 | 2.005 | 5.428 | 1.872 | 1.13 |
| 2018-02-06 | 0.94 | 1.741 | 2.054 | 5.643 | 1.938 | 1.194 |
| 2018-02-07 | 0.899 | 1.683 | 1.978 | 5.501 | 1.89 | 1.168 |
| 2018-02-08 | 0.929 | 1.718 | 1.996 | 5.69 | 1.938 | 1.173 |
| 2018-02-09 | 0.929 | 1.718 | 1.996 | 5.69 | 1.938 | 1.173 |
| 2018-02-10 | 0.929 | 1.718 | 1.996 | 5.69 | 1.938 | 1.173 |
| 2018-02-11 | 0.935 | 1.758 | 2.044 | 5.843 | 1.98 | 1.168 |
| 2018-02-12 | 0.924 | 1.763 | 2.028 | 5.833 | 1.984 | 1.158 |
| 2018-02-13 | 0.891 | 1.691 | 1.99 | 5.761 | 1.947 | 1.129 |
| 2018-02-14 | 0.891 | 1.677 | 2.008 | 5.73 | 1.974 | 1.152 |
| 2018-02-15 | 0.885 | 1.611 | 2.012 | 5.627 | 1.956 | 1.121 |
| 2018-02-16 | 0.885 | 1.611 | 2.012 | 5.627 | 1.956 | 1.121 |
| 2018-02-17 | 0.885 | 1.611 | 2.012 | 5.627 | 1.956 | 1.121 |
| 2018-02-18 | 0.841 | 1.564 | 2.034 | 5.514 | 1.884 | 1.105 |
| 2018-02-19 | 0.871 | 1.596 | 2.049 | 5.493 | 1.913 | 1.142 |
| 2018-02-20 | 0.873 | 1.636 | 2.084 | 5.569 | 1.935 | 1.127 |
| 2018-02-21 | 0.877 | 1.654 | 2.122 | 5.586 | 1.95 | 1.123 |
| 2018-02-22 | 0.906 | 1.707 | 2.156 | 5.729 | 2.002 | 1.168 |
| 2018-02-23 | 0.906 | 1.707 | 2.156 | 5.729 | 2.002 | 1.168 |
| 2018-02-24 | 0.906 | 1.707 | 2.156 | 5.729 | 2.002 | 1.168 |
| 2018-02-25 | 0.89 | 1.687 | 2.113 | 5.71 | 1.979 | 1.165 |
| 2018-02-26 | 0.849 | 1.623 | 2.064 | 5.63 | 1.929 | 1.114 |
| 2018-02-27 | 0.791 | 1.642 | 2.04 | 5.577 | 1.894 | 1.061 |
| 2018-02-28 | 0.84 | 1.696 | 2.115 | 5.842 | 1.947 | 1.028 |
| 2018-03-01 | 0.84 | 1.696 | 2.115 | 5.842 | 1.947 | 1.028 |
| 2018-03-02 | 0.84 | 1.696 | 2.115 | 5.842 | 1.947 | 1.028 |
| 2018-03-03 | 0.84 | 1.696 | 2.115 | 5.842 | 1.947 | 1.028 |
| 2018-03-04 | 0.869 | 1.702 | 2.181 | 5.903 | 1.981 | 1.092 |
| 2018-03-05 | 0.851 | 1.691 | 2.17 | 6.018 | 1.983 | 1.1 |
| 2018-03-06 | 0.832 | 1.566 | 2.135 | 6.174 | 1.956 | 1.081 |
| 2018-03-07 | 0.839 | 1.588 | 2.15 | 6.347 | 1.992 | 1.072 |
| 2018-03-08 | 0.875 | 1.659 | 2.213 | 6.53 | 2.07 | 1.117 |
| 2018-03-09 | 0.875 | 1.659 | 2.213 | 6.53 | 2.07 | 1.117 |
| 2018-03-10 | 0.875 | 1.659 | 2.213 | 6.53 | 2.07 | 1.117 |
| 2018-03-11 | 0.845 | 1.657 | 2.2 | 6.562 | 2.024 | 1.101 |
| 2018-03-12 | 0.84 | 1.648 | 2.182 | 6.456 | 2.043 | 1.115 |
| 2018-03-13 | 0.763 | 1.608 | 2.13 | 6.497 | 1.989 | 1.088 |
| 2018-03-14 | 0.776 | 1.598 | 2.107 | 6.464 | 1.959 | 1.037 |
| 2018-03-15 | 0.735 | 1.568 | 2.055 | 6.417 | 1.907 | 0.996 |
| 2018-03-16 | 0.735 | 1.568 | 2.055 | 6.417 | 1.907 | 0.996 |
| 2018-03-17 | 0.735 | 1.568 | 2.055 | 6.417 | 1.907 | 0.996 |
| 2018-03-18 | 0.735 | 1.586 | 2.058 | 6.465 | 1.912 | 1.02 |
| 2018-03-19 | 0.687 | 1.575 | 2.055 | 6.484 | 1.902 | 0.988 |
| 2018-03-20 | 0.759 | 1.638 | 2.102 | 6.443 | 1.945 | 1.027 |
| 2018-03-21 | 0.778 | 1.679 | 2.155 | 6.486 | 1.962 | 1.058 |
| 2018-03-22 | 0.804 | 1.709 | 2.256 | 6.544 | 1.993 | 1.081 |
| 2018-03-23 | 0.804 | 1.709 | 2.256 | 6.544 | 1.993 | 1.081 |
| 2018-03-24 | 0.804 | 1.709 | 2.256 | 6.544 | 1.993 | 1.081 |
| 2018-03-25 | 0.859 | 1.768 | 2.277 | 6.84 | 2.053 | 1.128 |
| 2018-03-26 | 0.846 | 1.743 | 2.288 | 6.776 | 2.021 | 1.095 |
| 2018-03-27 | 0.844 | 1.707 | 2.273 | 6.738 | 1.996 | 1.085 |
| 2018-03-28 | 0.836 | 1.71 | 2.252 | 6.843 | 1.996 | 1.06 |
| 2018-03-29 | 0.818 | 1.721 | 2.242 | 6.893 | 1.981 | 1.077 |
| 2018-03-30 | 0.818 | 1.721 | 2.242 | 6.893 | 1.981 | 1.077 |
| 2018-03-31 | 0.818 | 1.721 | 2.242 | 6.893 | 1.981 | 1.077 |
| 2018-04-01 | 0.792 | 1.663 | 2.201 | 6.958 | 1.973 | 1.058 |
| 2018-04-02 | 0.786 | 1.611 | 2.196 | 7.042 | 1.98 | 1.018 |
| 2018-04-03 | 0.783 | 1.614 | 2.224 | 7.101 | 1.994 | 1.009 |
| 2018-04-04 | 0.794 | 1.672 | 2.244 | 7.332 | 2.034 | 1.016 |
| 2018-04-05 | 0.794 | 1.672 | 2.244 | 7.332 | 2.034 | 1.016 |
| 2018-04-06 | 0.794 | 1.672 | 2.244 | 7.332 | 2.034 | 1.016 |
| 2018-04-07 | 0.794 | 1.672 | 2.244 | 7.332 | 2.034 | 1.016 |
| 2018-04-08 | 0.793 | 1.669 | 2.226 | 7.354 | 2.027 | 1 |
| 2018-04-09 | 0.829 | 1.701 | 2.213 | 7.305 | 2.019 | 1.043 |
| 2018-04-10 | 0.825 | 1.716 | 2.213 | 7.248 | 1.987 | 1.053 |
| 2018-04-11 | 0.813 | 1.691 | 2.255 | 7.275 | 1.986 | 1.038 |
| 2018-04-12 | 0.805 | 1.783 | 2.227 | 7.258 | 1.988 | 1.043 |
| 2018-04-13 | 0.805 | 1.783 | 2.227 | 7.258 | 1.988 | 1.043 |
| 2018-04-14 | 0.805 | 1.783 | 2.227 | 7.258 | 1.988 | 1.043 |
| 2018-04-15 | 0.803 | 1.795 | 2.268 | 7.23 | 1.983 | 1.034 |
| 2018-04-16 | 0.795 | 1.781 | 2.171 | 7.128 | 1.976 | 1.048 |
| 2018-04-17 | 0.772 | 1.783 | 2.126 | 7.01 | 1.929 | 1.02 |
| 2018-04-18 | 0.772 | 1.783 | 2.126 | 7.01 | 1.929 | 1.02 |
| 2018-04-19 | 0.772 | 1.783 | 2.126 | 7.01 | 1.929 | 1.02 |
| 2018-04-20 | 0.772 | 1.783 | 2.126 | 7.01 | 1.929 | 1.02 |
| 2018-04-21 | 0.772 | 1.783 | 2.126 | 7.01 | 1.929 | 1.02 |
| 2018-04-22 | 0.783 | 1.741 | 2.126 | 7.131 | 1.92 | 1.033 |
| 2018-04-23 | 0.779 | 1.728 | 2.196 | 7.101 | 1.914 | 1.032 |
| 2018-04-24 | 0.779 | 1.715 | 2.241 | 7.094 | 1.943 | 1.046 |
| 2018-04-25 | 0.783 | 1.721 | 2.215 | 7.203 | 1.97 | 1.047 |
| 2018-04-26 | 0.766 | 1.704 | 2.225 | 7.183 | 1.972 | 1.012 |
| 2018-04-27 | 0.766 | 1.704 | 2.225 | 7.183 | 1.972 | 1.012 |
| 2018-04-28 | 0.766 | 1.704 | 2.225 | 7.183 | 1.972 | 1.012 |
| 2018-04-29 | 0.728 | 1.655 | 2.161 | 7.205 | 1.94 | 1.002 |
| 2018-04-30 | 0.755 | 1.713 | 2.212 | 7.232 | 1.96 | 1 |
| 2018-05-01 | 0.744 | 1.705 | 2.212 | 7.488 | 1.96 | 1.04 |
| 2018-05-02 | 0.756 | 1.701 | 2.174 | 7.516 | 1.97 | 1.046 |
| 2018-05-03 | 0.763 | 1.696 | 2.179 | 7.503 | 1.97 | 1.037 |
| 2018-05-04 | 0.763 | 1.696 | 2.179 | 7.503 | 1.97 | 1.037 |
| 2018-05-05 | 0.763 | 1.696 | 2.179 | 7.503 | 1.97 | 1.037 |
| 2018-05-06 | 0.752 | 1.698 | 2.169 | 7.524 | 1.968 | 1.037 |
| 2018-05-07 | 0.767 | 1.71 | 2.159 | 7.461 | 1.981 | 1.056 |
| 2018-05-08 | 0.749 | 1.687 | 2.185 | 7.452 | 1.964 | 1.009 |
| 2018-05-09 | 0.782 | 1.735 | 2.233 | 7.542 | 1.985 | 1.025 |
| 2018-05-10 | 0.769 | 1.755 | 2.278 | 7.577 | 2.009 | 1.031 |
| 2018-05-11 | 0.769 | 1.755 | 2.278 | 7.577 | 2.009 | 1.031 |
| 2018-05-12 | 0.769 | 1.755 | 2.278 | 7.577 | 2.009 | 1.031 |
| 2018-05-13 | 0.8 | 1.796 | 2.245 | 7.706 | 2.027 | 1.066 |
| 2018-05-14 | 0.782 | 1.81 | 2.225 | 7.757 | 2.019 | 1.078 |
| 2018-05-15 | 0.8 | 1.843 | 2.299 | 7.828 | 2.027 | 1.072 |
| 2018-05-16 | 0.803 | 1.9 | 2.35 | 8.155 | 2.045 | 1.079 |
| 2018-05-17 | 0.91 | 2.036 | 2.387 | 8.15 | 2.101 | 1.141 |
| 2018-05-18 | 0.91 | 2.036 | 2.387 | 8.15 | 2.101 | 1.141 |
| 2018-05-19 | 0.91 | 2.036 | 2.387 | 8.15 | 2.101 | 1.141 |
| 2018-05-20 | 0.91 | 2.036 | 2.387 | 8.15 | 2.101 | 1.141 |
| 2018-05-21 | 0.882 | 1.982 | 2.339 | 8.172 | 2.074 | 1.182 |
| 2018-05-22 | 0.842 | 1.961 | 2.369 | 8.17 | 2.049 | 1.162 |
| 2018-05-23 | 0.801 | 1.957 | 2.375 | 8.203 | 2.052 | 1.137 |
| 2018-05-24 | 0.788 | 1.892 | 2.307 | 8.228 | 2.047 | 1.145 |
| 2018-05-25 | 0.788 | 1.892 | 2.307 | 8.228 | 2.047 | 1.145 |
| 2018-05-26 | 0.788 | 1.892 | 2.307 | 8.228 | 2.047 | 1.145 |
| 2018-05-27 | 0.771 | 1.858 | 2.345 | 8.234 | 2.014 | 1.128 |
| 2018-05-28 | 0.746 | 1.863 | 2.353 | 8.326 | 2.019 | 1.1 |
| 2018-05-29 | 0.787 | 1.864 | 2.346 | 8.306 | 2.022 | 1.086 |
| 2018-05-30 | 0.773 | 1.904 | 2.343 | 8.304 | 2.005 | 1.085 |
| 2018-05-31 | 0.8 | 1.907 | 2.349 | 8.318 | 2.019 | 1.097 |
| 2018-06-01 | 0.8 | 1.907 | 2.349 | 8.318 | 2.019 | 1.097 |
| 2018-06-02 | 0.8 | 1.907 | 2.349 | 8.318 | 2.019 | 1.097 |
| 2018-06-03 | 0.793 | 1.848 | 2.358 | 8.65 | 2.013 | 1.06 |
| 2018-06-04 | 0.8 | 1.884 | 2.345 | 8.679 | 2.018 | 1.083 |
| 2018-06-05 | 0.84 | 1.926 | 2.332 | 8.763 | 2.042 | 1.124 |
| 2018-06-06 | 0.812 | 2.036 | 2.32 | 8.853 | 2.051 | 1.109 |
| 2018-06-07 | 0.795 | 2.032 | 2.33 | 8.924 | 2.04 | 1.103 |
| 2018-06-08 | 0.795 | 2.032 | 2.33 | 8.924 | 2.04 | 1.103 |
| 2018-06-09 | 0.795 | 2.032 | 2.33 | 8.924 | 2.04 | 1.103 |
| 2018-06-10 | 0.8 | 1.953 | 2.33 | 9.097 | 2.06 | 1.091 |
| 2018-06-11 | 0.812 | 1.896 | 2.326 | 8.959 | 2.078 | 1.107 |
| 2018-06-12 | 0.821 | 1.86 | 2.292 | 8.735 | 2.071 | 1.131 |
| 2018-06-13 | 0.831 | 1.869 | 2.248 | 8.676 | 2.068 | 1.137 |
| 2018-06-14 | 0.825 | 1.882 | 2.28 | 8.416 | 2.076 | 1.146 |
| 2018-06-15 | 0.825 | 1.882 | 2.28 | 8.416 | 2.076 | 1.146 |
| 2018-06-16 | 0.825 | 1.882 | 2.28 | 8.416 | 2.076 | 1.146 |
| 2018-06-17 | 0.764 | 1.769 | 2.172 | 8.44 | 2.013 | 1.077 |
| 2018-06-18 | 0.823 | 2.261 | 2.147 | 8.499 | 2.052 | 1.113 |
| 2018-06-19 | 0.794 | 2.247 | 2.156 | 8.329 | 2.027 | 1.082 |
| 2018-06-20 | 0.792 | 2.202 | 2.178 | 8.133 | 2.017 | 1.072 |
| 2018-06-21 | 0.797 | 2.195 | 2.17 | 8.099 | 2.002 | 1.038 |
| 2018-06-22 | 0.797 | 2.195 | 2.17 | 8.099 | 2.002 | 1.038 |
| 2018-06-23 | 0.797 | 2.195 | 2.17 | 8.099 | 2.002 | 1.038 |
| 2018-06-24 | 0.77 | 2.15 | 2.151 | 8.27 | 1.979 | 1.041 |
| 2018-06-25 | 0.788 | 2.161 | 2.157 | 8.401 | 1.991 | 1.03 |
| 2018-06-26 | 0.775 | 2.125 | 2.155 | 8.425 | 1.973 | 1.018 |
| 2018-06-27 | 0.768 | 2.128 | 2.131 | 8.516 | 1.979 | 1.014 |
| 2018-06-28 | 0.812 | 2.148 | 2.135 | 8.463 | 2.001 | 1.062 |
| 2018-06-29 | 0.812 | 2.148 | 2.135 | 8.463 | 2.001 | 1.062 |
| 2018-06-30 | 0.812 | 2.148 | 2.135 | 8.463 | 2.001 | 1.062 |
| 2018-07-01 | 0.813 | 2.219 | 2.133 | 8.277 | 1.997 | 1.102 |
| 2018-07-02 | 0.783 | 2.216 | 2.145 | 8.323 | 2.002 | 1.072 |
| 2018-07-03 | 0.797 | 2.261 | 2.245 | 8.414 | 2.035 | 1.065 |
| 2018-07-04 | 0.819 | 2.352 | 2.318 | 8.669 | 2.115 | 1.113 |
| 2018-07-05 | 0.805 | 2.387 | 2.448 | 8.715 | 2.15 | 1.126 |
| 2018-07-06 | 0.805 | 2.387 | 2.448 | 8.715 | 2.15 | 1.126 |
| 2018-07-07 | 0.805 | 2.387 | 2.448 | 8.715 | 2.15 | 1.126 |
| 2018-07-08 | 0.804 | 2.409 | 2.496 | 8.703 | 2.16 | 1.111 |
| 2018-07-09 | 0.772 | 2.385 | 2.521 | 8.62 | 2.155 | 1.109 |
| 2018-07-10 | 0.737 | 2.347 | 2.522 | 8.611 | 2.113 | 1.085 |
| 2018-07-11 | 0.756 | 2.345 | 2.446 | 8.589 | 2.098 | 1.075 |
| 2018-07-12 | 0.721 | 2.32 | 2.372 | 8.577 | 2.065 | 1.041 |
| 2018-07-13 | 0.721 | 2.32 | 2.372 | 8.577 | 2.065 | 1.041 |
| 2018-07-14 | 0.721 | 2.32 | 2.372 | 8.577 | 2.065 | 1.041 |
| 2018-07-15 | 0.752 | 2.338 | 2.424 | 8.584 | 2.096 | 1.071 |
| 2018-07-16 | 0.716 | 2.338 | 2.41 | 8.636 | 2.063 | 1.054 |
| 2018-07-17 | 0.719 | 2.291 | 2.438 | 8.677 | 2.057 | 1.049 |
| 2018-07-18 | 0.691 | 1.837 | 2.445 | 8.705 | 2.037 | 1.021 |
| 2018-07-19 | 0.736 | 1.836 | 2.44 | 8.709 | 2.035 | 1.032 |
| 2018-07-20 | 0.736 | 1.836 | 2.44 | 8.709 | 2.035 | 1.032 |
| 2018-07-21 | 0.736 | 1.836 | 2.44 | 8.709 | 2.035 | 1.032 |
| 2018-07-22 | 0.736 | 1.836 | 2.44 | 8.709 | 2.035 | 1.032 |
| 2018-07-23 | 0.712 | 1.826 | 2.462 | 8.772 | 2.055 | 1.021 |
| 2018-07-24 | 0.698 | 1.849 | 2.513 | 8.791 | 2.082 | 1.044 |
| 2018-07-25 | 0.737 | 1.93 | 2.545 | 8.936 | 2.163 | 1.098 |
| 2018-07-26 | 0.697 | 1.887 | 2.514 | 8.888 | 2.12 | 1.049 |
| 2018-07-27 | 0.697 | 1.887 | 2.514 | 8.888 | 2.12 | 1.049 |
| 2018-07-28 | 0.697 | 1.887 | 2.514 | 8.888 | 2.12 | 1.049 |
| 2018-07-29 | 0.683 | 1.884 | 2.527 | 8.893 | 2.116 | 1.024 |
| 2018-07-30 | 0.686 | 1.885 | 2.503 | 8.892 | 2.101 | 1.016 |
| 2018-07-31 | 0.702 | 1.853 | 2.485 | 8.849 | 2.279 | 0.985 |
| 2018-08-01 | 0.699 | 1.888 | 2.451 | 8.81 | 2.278 | 1.001 |
| 2018-08-02 | 0.696 | 1.882 | 2.43 | 8.668 | 2.264 | 1.008 |
| 2018-08-03 | 0.696 | 1.882 | 2.43 | 8.668 | 2.264 | 1.008 |
| 2018-08-04 | 0.696 | 1.882 | 2.43 | 8.668 | 2.264 | 1.008 |
| 2018-08-05 | 0.703 | 1.872 | 2.412 | 8.579 | 2.255 | 1.016 |
| 2018-08-06 | 0.69 | 1.899 | 2.385 | 8.408 | 2.246 | 1.015 |
| 2018-08-07 | 0.7 | 1.892 | 2.392 | 8.315 | 2.234 | 0.995 |
| 2018-08-08 | 0.692 | 1.889 | 2.379 | 8.211 | 2.22 | 0.989 |
| 2018-08-09 | 0.695 | 1.921 | 2.36 | 8.187 | 2.215 | 1 |
| 2018-08-10 | 0.695 | 1.921 | 2.36 | 8.187 | 2.215 | 1 |
| 2018-08-11 | 0.695 | 1.921 | 2.36 | 8.187 | 2.215 | 1 |
| 2018-08-12 | 0.707 | 1.945 | 2.361 | 8.201 | 2.217 | 1 |
| 2018-08-13 | 0.714 | 1.945 | 2.358 | 8.222 | 2.217 | 1.007 |
| 2018-08-14 | 0.707 | 1.922 | 2.329 | 8.247 | 2.216 | 0.995 |
| 2018-08-15 | 0.713 | 1.963 | 2.368 | 8.137 | 2.234 | 1.005 |
| 2018-08-16 | 0.651 | 1.893 | 2.37 | 8.014 | 2.209 | 0.957 |
| 2018-08-17 | 0.651 | 1.893 | 2.37 | 8.014 | 2.209 | 0.957 |
| 2018-08-18 | 0.651 | 1.893 | 2.37 | 8.014 | 2.209 | 0.957 |
| 2018-08-19 | 0.669 | 1.887 | 2.366 | 8.033 | 2.194 | 0.984 |
| 2018-08-20 | 0.662 | 1.889 | 2.343 | 7.942 | 2.177 | 0.997 |
| 2018-08-21 | 0.633 | 1.806 | 2.295 | 7.896 | 2.133 | 0.969 |
| 2018-08-22 | 0.619 | 1.753 | 2.241 | 7.9 | 2.103 | 0.954 |
| 2018-08-23 | 0.63 | 1.695 | 2.208 | 7.839 | 2.092 | 0.945 |
| 2018-08-24 | 0.63 | 1.695 | 2.208 | 7.839 | 2.092 | 0.945 |
| 2018-08-25 | 0.63 | 1.695 | 2.208 | 7.839 | 2.092 | 0.945 |
| 2018-08-26 | 0.639 | 1.689 | 2.213 | 7.829 | 2.105 | 0.925 |
| 2018-08-27 | 0.605 | 1.684 | 2.174 | 7.761 | 2.093 | 0.923 |
| 2018-08-28 | 0.62 | 1.665 | 2.17 | 7.757 | 2.089 | 0.928 |
| 2018-08-29 | 0.614 | 1.651 | 2.225 | 7.79 | 2.072 | 0.926 |
| 2018-08-30 | 0.581 | 1.6 | 2.225 | 7.788 | 2.083 | 0.9 |
| 2018-08-31 | 0.581 | 1.6 | 2.225 | 7.788 | 2.083 | 0.9 |
| 2018-09-01 | 0.581 | 1.6 | 2.225 | 7.788 | 2.083 | 0.9 |
| 2018-09-02 | 0.508 | 1.566 | 2.235 | 7.8 | 2.061 | 0.848 |
| 2018-09-03 | 0.559 | 1.548 | 2.218 | 7.752 | 2.074 | 0.89 |
| 2018-09-04 | 0.592 | 1.588 | 2.229 | 7.705 | 2.087 | 0.895 |
| 2018-09-05 | 0.602 | 1.582 | 2.231 | 7.75 | 2.105 | 0.867 |
| 2018-09-06 | 0.594 | 1.574 | 2.245 | 7.73 | 2.187 | 0.872 |
| 2018-09-07 | 0.594 | 1.574 | 2.245 | 7.73 | 2.187 | 0.872 |
| 2018-09-08 | 0.594 | 1.574 | 2.245 | 7.73 | 2.187 | 0.872 |
| 2018-09-09 | 0.594 | 1.574 | 2.245 | 7.73 | 2.187 | 0.872 |
| 2018-09-10 | 0.594 | 1.574 | 2.245 | 7.73 | 2.187 | 0.872 |
| 2018-09-11 | 0.594 | 1.574 | 2.245 | 7.73 | 2.187 | 0.872 |
| 2018-09-12 | 0.597 | 1.563 | 2.227 | 7.761 | 2.124 | 0.876 |
| 2018-09-13 | 0.589 | 1.555 | 2.203 | 7.779 | 2.074 | 0.886 |
| 2018-09-14 | 0.589 | 1.555 | 2.203 | 7.779 | 2.074 | 0.886 |
| 2018-09-15 | 0.589 | 1.555 | 2.203 | 7.779 | 2.074 | 0.886 |
| 2018-09-16 | 0.558 | 1.51 | 2.135 | 7.659 | 2.048 | 0.834 |
| 2018-09-17 | 0.542 | 1.476 | 2.125 | 7.61 | 2.022 | 0.859 |
| 2018-09-18 | 0.542 | 1.476 | 2.125 | 7.61 | 2.022 | 0.859 |
| 2018-09-19 | 0.542 | 1.476 | 2.125 | 7.61 | 2.022 | 0.859 |
| 2018-09-20 | 0.552 | 1.473 | 2.122 | 7.611 | 2.034 | 0.864 |
| 2018-09-21 | 0.552 | 1.473 | 2.122 | 7.611 | 2.034 | 0.864 |
| 2018-09-22 | 0.552 | 1.473 | 2.122 | 7.611 | 2.034 | 0.864 |
| 2018-09-23 | 0.552 | 1.473 | 2.122 | 7.611 | 2.034 | 0.864 |
| 2018-09-24 | 0.552 | 1.473 | 2.122 | 7.611 | 2.034 | 0.864 |
| 2018-09-25 | 0.55 | 1.519 | 2.105 | 7.633 | 2.062 | 0.853 |
| 2018-09-26 | 0.559 | 1.517 | 2.141 | 7.777 | 2.066 | 0.868 |
| 2018-09-27 | 0.541 | 1.498 | 2.167 | 7.739 | 2.068 | 0.838 |
| 2018-09-28 | 0.541 | 1.498 | 2.167 | 7.739 | 2.068 | 0.838 |
| 2018-09-29 | 0.541 | 1.498 | 2.167 | 7.739 | 2.068 | 0.838 |
| 2018-09-30 | 0.541 | 1.498 | 2.167 | 7.739 | 2.068 | 0.838 |
| 2018-10-01 | 0.541 | 1.498 | 2.167 | 7.739 | 2.068 | 0.838 |
| 2018-10-02 | 0.555 | 1.483 | 2.17 | 7.676 | 2.061 | 0.848 |
| 2018-10-03 | 0.527 | 1.44 | 2.149 | 7.529 | 2.014 | 0.839 |
| 2018-10-04 | 0.541 | 1.466 | 2.205 | 7.595 | 2.041 | 0.842 |
| 2018-10-05 | 0.541 | 1.466 | 2.205 | 7.595 | 2.041 | 0.842 |
| 2018-10-06 | 0.541 | 1.466 | 2.205 | 7.595 | 2.041 | 0.842 |
| 2018-10-07 | 0.567 | 1.5 | 2.2 | 7.629 | 2.065 | 0.851 |
| 2018-10-08 | 0.598 | 1.537 | 2.154 | 7.546 | 2.085 | 0.877 |
| 2018-10-09 | 0.556 | 1.509 | 2.191 | 7.581 | 2.06 | 0.847 |
| 2018-10-10 | 0.567 | 1.529 | 2.213 | 7.56 | 2.077 | 0.841 |
| 2018-10-11 | 0.67 | 1.587 | 2.345 | 7.748 | 2.128 | 0.936 |
| 2018-10-12 | 0.67 | 1.587 | 2.345 | 7.748 | 2.128 | 0.936 |
| 2018-10-13 | 0.67 | 1.587 | 2.345 | 7.748 | 2.128 | 0.936 |
| 2018-10-14 | 0.606 | 1.566 | 2.322 | 7.705 | 2.122 | 0.923 |
| 2018-10-15 | 0.638 | 1.612 | 2.34 | 7.735 | 2.16 | 0.976 |
| 2018-10-16 | 0.577 | 1.588 | 2.387 | 7.693 | 2.133 | 0.967 |
| 2018-10-17 | 0.616 | 1.623 | 2.384 | 7.71 | 2.163 | 0.993 |
| 2018-10-18 | 0.612 | 1.671 | 2.352 | 7.654 | 2.164 | 1.001 |
| 2018-10-19 | 0.612 | 1.671 | 2.352 | 7.654 | 2.164 | 1.001 |
| 2018-10-20 | 0.612 | 1.671 | 2.352 | 7.654 | 2.164 | 1.001 |
| 2018-10-21 | 0.621 | 1.666 | 2.333 | 7.656 | 2.158 | 0.994 |
| 2018-10-22 | 0.586 | 1.637 | 2.317 | 7.69 | 2.161 | 1.03 |
| 2018-10-23 | 0.642 | 1.674 | 2.34 | 7.786 | 2.198 | 1.052 |
| 2018-10-24 | 0.633 | 1.661 | 2.319 | 7.753 | 2.177 | 1.04 |
| 2018-10-25 | 0.684 | 1.73 | 2.318 | 7.855 | 2.206 | 1.085 |
| 2018-10-26 | 0.684 | 1.73 | 2.318 | 7.855 | 2.206 | 1.085 |
| 2018-10-27 | 0.684 | 1.73 | 2.318 | 7.855 | 2.206 | 1.085 |
| 2018-10-28 | 0.642 | 1.703 | 2.317 | 7.879 | 2.198 | 1.076 |
| 2018-10-29 | 0.678 | 1.701 | 2.333 | 7.923 | 2.19 | 1.074 |
| 2018-10-30 | 0.678 | 1.701 | 2.333 | 7.923 | 2.19 | 1.074 |
| 2018-10-31 | 0.687 | 1.715 | 2.338 | 7.91 | 2.187 | 1.067 |
| 2018-11-01 | 0.626 | 1.665 | 2.326 | 7.767 | 2.146 | 1.005 |
| 2018-11-02 | 0.626 | 1.665 | 2.326 | 7.767 | 2.146 | 1.005 |
| 2018-11-03 | 0.626 | 1.665 | 2.326 | 7.767 | 2.146 | 1.005 |
| 2018-11-04 | 0.656 | 1.663 | 2.323 | 7.76 | 2.143 | 1.015 |
| 2018-11-05 | 0.696 | 1.7 | 2.384 | 7.83 | 2.191 | 1.033 |
| 2018-11-06 | 0.683 | 1.677 | 2.352 | 7.865 | 2.185 | 1.026 |
| 2018-11-07 | 0.67 | 1.648 | 2.323 | 7.795 | 2.171 | 0.975 |
| 2018-11-08 | 0.62 | 1.559 | 2.297 | 7.753 | 2.146 | 0.936 |
| 2018-11-09 | 0.62 | 1.559 | 2.297 | 7.753 | 2.146 | 0.936 |
| 2018-11-10 | 0.62 | 1.559 | 2.297 | 7.753 | 2.146 | 0.936 |
| 2018-11-11 | 0.628 | 1.545 | 2.295 | 7.737 | 2.137 | 0.909 |
| 2018-11-12 | 0.647 | 1.581 | 2.337 | 7.797 | 2.163 | 0.971 |
| 2018-11-13 | 0.67 | 1.629 | 2.362 | 7.84 | 2.188 | 0.949 |
| 2018-11-14 | 0.671 | 1.629 | 2.395 | 7.848 | 2.173 | 0.962 |
| 2018-11-15 | 0.739 | 1.675 | 2.363 | 7.873 | 2.201 | 1.04 |
| 2018-11-16 | 0.739 | 1.675 | 2.363 | 7.873 | 2.201 | 1.04 |
| 2018-11-17 | 0.739 | 1.675 | 2.363 | 7.873 | 2.201 | 1.04 |
| 2018-11-18 | 0.623 | 1.602 | 2.276 | 7.816 | 2.153 | 0.958 |
| 2018-11-19 | 0.678 | 1.692 | 2.292 | 7.832 | 2.199 | 0.954 |
| 2018-11-20 | 0.685 | 1.689 | 2.347 | 7.792 | 2.227 | 0.834 |
| 2018-11-21 | 0.664 | 1.708 | 2.362 | 7.822 | 2.247 | 0.817 |
| 2018-11-22 | 0.641 | 1.697 | 2.346 | 7.891 | 2.216 | 0.829 |
| 2018-11-23 | 0.641 | 1.697 | 2.346 | 7.891 | 2.216 | 0.829 |
| 2018-11-24 | 0.641 | 1.697 | 2.346 | 7.891 | 2.216 | 0.829 |
| 2018-11-25 | 0.649 | 1.71 | 2.366 | 7.981 | 2.257 | 0.855 |
| 2018-11-26 | 0.669 | 1.711 | 2.388 | 7.893 | 2.273 | 0.805 |
| 2018-11-27 | 0.721 | 1.763 | 2.426 | 8.006 | 2.318 | 0.867 |
| 2018-11-28 | 0.729 | 1.744 | 2.436 | 7.999 | 2.31 | 0.97 |
| 2018-11-29 | 0.752 | 1.747 | 2.43 | 7.973 | 2.314 | 1.061 |
| 2018-11-30 | 0.752 | 1.747 | 2.43 | 7.973 | 2.314 | 1.061 |
| 2018-12-01 | 0.752 | 1.747 | 2.43 | 7.973 | 2.314 | 1.061 |
| 2018-12-02 | 0.756 | 1.752 | 2.417 | 7.85 | 2.315 | 1.032 |
| 2018-12-03 | 0.762 | 1.798 | 2.365 | 7.625 | 2.326 | 1.02 |
| 2018-12-04 | 0.73 | 1.821 | 2.326 | 7.559 | 2.316 | 0.976 |
| 2018-12-05 | 0.757 | 1.831 | 2.351 | 7.539 | 2.333 | 0.987 |
| 2018-12-06 | 0.754 | 1.871 | 2.396 | 7.548 | 2.353 | 1 |
| 2018-12-07 | 0.754 | 1.871 | 2.396 | 7.548 | 2.353 | 1 |
| 2018-12-08 | 0.754 | 1.871 | 2.396 | 7.548 | 2.353 | 1 |
| 2018-12-09 | 0.79 | 1.863 | 2.489 | 7.56 | 2.4 | 1.026 |
| 2018-12-10 | 0.861 | 1.977 | 2.516 | 7.774 | 2.479 | 1.086 |
| 2018-12-11 | 0.86 | 1.967 | 2.527 | 7.757 | 2.482 | 1.133 |
| 2018-12-12 | 0.88 | 1.999 | 2.467 | 7.773 | 2.498 | 1.192 |
| 2018-12-13 | 0.885 | 1.957 | 2.471 | 7.788 | 2.51 | 1.131 |
| 2018-12-14 | 0.885 | 1.957 | 2.471 | 7.788 | 2.51 | 1.131 |
| 2018-12-15 | 0.885 | 1.957 | 2.471 | 7.788 | 2.51 | 1.131 |
| 2018-12-16 | 0.938 | 1.985 | 2.612 | 7.873 | 2.678 | 1.108 |
| 2018-12-17 | 0.888 | 2 | 2.671 | 8.083 | 2.675 | 1.059 |
| 2018-12-18 | 0.905 | 2.055 | 2.705 | 8.196 | 2.705 | 1.101 |
| 2018-12-19 | 0.889 | 2.115 | 2.731 | 8.071 | 2.661 | 1.042 |
| 2018-12-20 | 0.957 | 2.252 | 2.84 | 8.305 | 2.763 | 1.104 |
| 2018-12-21 | 0.957 | 2.252 | 2.84 | 8.305 | 2.763 | 1.104 |
| 2018-12-22 | 0.957 | 2.252 | 2.84 | 8.305 | 2.763 | 1.104 |
| 2018-12-23 | 1.188 | 2.735 | 3.041 | 9.206 | 3.143 | 1.392 |
| 2018-12-24 | 1.31 | 3.096 | 3.117 | 9.398 | 3.364 | 1.561 |
| 2018-12-25 | 1.14 | 2.861 | 2.959 | 8.882 | 3.118 | 1.382 |
| 2018-12-26 | 1.077 | 2.784 | 2.793 | 8.501 | 2.91 | 1.23 |
| 2018-12-27 | 0.966 | 2.699 | 2.7 | 8.588 | 2.833 | 1.276 |
| 2018-12-28 | 0.966 | 2.699 | 2.7 | 8.588 | 2.833 | 1.276 |
| 2018-12-29 | 0.966 | 2.699 | 2.7 | 8.588 | 2.833 | 1.276 |
| 2018-12-30 | 0.942 | 2.723 | 2.7 | 8.635 | 2.78 | 1.216 |
| 2018-12-31 | 0.92 | 2.665 | 2.656 | 8.544 | 2.755 | 1.21 |
| 2019-01-01 | 0.869 | 2.516 | 2.578 | 8.322 | 2.644 | 1.143 |
| 2019-01-02 | 0.938 | 2.572 | 2.628 | 8.558 | 2.738 | 1.197 |
| 2019-01-03 | 0.936 | 2.633 | 2.691 | 8.742 | 2.785 | 1.208 |
| 2019-01-04 | 0.936 | 2.633 | 2.691 | 8.742 | 2.785 | 1.208 |
| 2019-01-05 | 0.936 | 2.633 | 2.691 | 8.742 | 2.785 | 1.208 |
| 2019-01-06 | 0.888 | 2.589 | 2.618 | 8.685 | 2.752 | 1.124 |
| 2019-01-07 | 0.856 | 2.504 | 2.609 | 8.622 | 2.73 | 1.069 |
| 2019-01-08 | 0.815 | 2.493 | 2.598 | 8.464 | 2.703 | 1.106 |
| 2019-01-09 | 0.831 | 2.473 | 2.571 | 7.324 | 2.488 | 1.077 |
| 2019-01-10 | 0.904 | 2.589 | 2.691 | 7.399 | 2.579 | 1.086 |
| 2019-01-11 | 0.904 | 2.589 | 2.691 | 7.399 | 2.579 | 1.086 |
| 2019-01-12 | 0.904 | 2.589 | 2.691 | 7.399 | 2.579 | 1.086 |
| 2019-01-13 | 0.909 | 2.695 | 2.73 | 8.543 | 2.648 | 1.094 |
| 2019-01-14 | 0.922 | 2.814 | 2.754 | 8.613 | 2.674 | 1.104 |
| 2019-01-15 | 0.871 | 2.955 | 2.749 | 8.917 | 2.636 | 1.076 |
| 2019-01-16 | 0.882 | 3.099 | 2.71 | 9.114 | 2.616 | 1.121 |
| 2019-01-17 | 0.865 | 3.057 | 2.675 | 9.217 | 2.581 | 1.085 |
| 2019-01-18 | 0.865 | 3.057 | 2.675 | 9.217 | 2.581 | 1.085 |
| 2019-01-19 | 0.865 | 3.057 | 2.675 | 9.217 | 2.581 | 1.085 |
| 2019-01-20 | 0.849 | 2.923 | 2.621 | 9.263 | 2.52 | 1.059 |
| 2019-01-21 | 0.875 | 2.946 | 2.615 | 9.331 | 2.512 | 1.04 |
| 2019-01-22 | 0.868 | 3.038 | 2.622 | 9.314 | 2.521 | 1.051 |
| 2019-01-23 | 0.869 | 3.134 | 2.607 | 9.32 | 2.529 | 1.063 |
| 2019-01-24 | 0.828 | 3.121 | 2.553 | 9.208 | 2.466 | 1.031 |
| 2019-01-25 | 0.828 | 3.121 | 2.553 | 9.208 | 2.466 | 1.031 |
| 2019-01-26 | 0.828 | 3.121 | 2.553 | 9.208 | 2.466 | 1.031 |
| 2019-01-27 | 0.856 | 3.135 | 2.564 | 9.132 | 2.468 | 1.028 |
| 2019-01-28 | 0.814 | 3.189 | 2.542 | 9.083 | 2.45 | 1.036 |
| 2019-01-29 | 0.809 | 3.154 | 2.478 | 9.044 | 2.42 | 0.98 |
| 2019-01-30 | 0.784 | 3.169 | 2.437 | 8.965 | 2.385 | 0.948 |
| 2019-01-31 | 0.745 | 3.226 | 2.447 | 8.697 | 2.355 | 1.067 |
| 2019-02-01 | 0.745 | 3.226 | 2.447 | 8.697 | 2.355 | 1.067 |
| 2019-02-02 | 0.745 | 3.226 | 2.447 | 8.697 | 2.355 | 1.067 |
| 2019-02-03 | 0.745 | 3.205 | 2.425 | 8.633 | 2.317 | 0.859 |
| 2019-02-04 | 0.756 | 3.125 | 2.412 | 8.596 | 2.293 | 0.873 |
| 2019-02-05 | 0.741 | 3.118 | 2.41 | 8.529 | 2.275 | 0.86 |
| 2019-02-06 | 0.757 | 3.143 | 2.417 | 8.515 | 2.289 | 0.903 |
| 2019-02-07 | 0.795 | 3.169 | 2.443 | 8.68 | 2.335 | 0.903 |
| 2019-02-08 | 0.795 | 3.169 | 2.443 | 8.68 | 2.335 | 0.903 |
| 2019-02-09 | 0.795 | 3.169 | 2.443 | 8.68 | 2.335 | 0.903 |
| 2019-02-10 | 0.771 | 3.113 | 2.434 | 8.627 | 2.344 | 0.901 |
| 2019-02-11 | 0.744 | 3.146 | 2.46 | 8.715 | 2.334 | 0.838 |
| 2019-02-12 | 0.738 | 3.134 | 2.433 | 8.7 | 2.316 | 0.852 |
| 2019-02-13 | 0.772 | 3.144 | 2.448 | 8.801 | 2.314 | 0.864 |
| 2019-02-14 | 0.736 | 3.149 | 2.457 | 8.862 | 2.315 | 0.888 |
| 2019-02-15 | 0.736 | 3.149 | 2.457 | 8.862 | 2.315 | 0.888 |
| 2019-02-16 | 0.736 | 3.149 | 2.457 | 8.862 | 2.315 | 0.888 |
| 2019-02-17 | 0.761 | 3.224 | 2.481 | 8.896 | 2.311 | 0.892 |
| 2019-02-18 | 0.763 | 3.243 | 2.463 | 8.848 | 2.3 | 0.875 |
| 2019-02-19 | 0.74 | 3.236 | 2.48 | 8.879 | 2.269 | 0.861 |
| 2019-02-20 | 0.726 | 3.21 | 2.48 | 8.867 | 2.215 | 0.845 |
| 2019-02-21 | 0.662 | 3.209 | 2.482 | 8.821 | 2.21 | 0.781 |
| 2019-02-22 | 0.662 | 3.209 | 2.482 | 8.821 | 2.21 | 0.781 |
| 2019-02-23 | 0.662 | 3.209 | 2.482 | 8.821 | 2.21 | 0.781 |
| 2019-02-24 | 0.661 | 3.193 | 2.444 | 8.907 | 2.193 | 0.767 |
| 2019-02-25 | 0.65 | 2.115 | 2.394 | 8.762 | 2.149 | 0.734 |
| 2019-02-26 | 0.673 | 2.119 | 2.375 | 8.708 | 2.154 | 0.795 |
| 2019-02-27 | 0.632 | 2.107 | 2.328 | 8.312 | 2.118 | 0.746 |
| 2019-02-28 | 0.688 | 2.153 | 2.386 | 8.913 | 2.133 | 0.839 |
| 2019-03-01 | 0.688 | 2.153 | 2.386 | 8.913 | 2.133 | 0.839 |
| 2019-03-02 | 0.688 | 2.153 | 2.386 | 8.913 | 2.133 | 0.839 |
| 2019-03-03 | 0.631 | 2.043 | 2.306 | 8.807 | 2.029 | 0.828 |
| 2019-03-04 | 0.592 | 1.976 | 2.263 | 8.812 | 1.987 | 0.803 |
| 2019-03-05 | 0.623 | 1.992 | 2.295 | 8.871 | 2.019 | 0.79 |
| 2019-03-06 | 0.642 | 2.028 | 2.333 | 8.907 | 2.049 | 0.823 |
| 2019-03-07 | 0.664 | 2.047 | 2.362 | 8.971 | 2.075 | 0.874 |
| 2019-03-08 | 0.664 | 2.047 | 2.362 | 8.971 | 2.075 | 0.874 |
| 2019-03-09 | 0.664 | 2.047 | 2.362 | 8.971 | 2.075 | 0.874 |
| 2019-03-10 | 0.652 | 2.033 | 2.38 | 8.95 | 3.272 | 0.849 |
| 2019-03-11 | 0.579 | 2.002 | 2.378 | 8.938 | 3.266 | 0.811 |
| 2019-03-12 | 0.571 | 1.998 | 2.421 | 8.97 | 3.253 | 0.742 |
| 2019-03-13 | 0.537 | 1.972 | 2.4 | 9.001 | 3.184 | 0.747 |
| 2019-03-14 | 0.512 | 1.959 | 2.361 | 8.778 | 3.156 | 0.719 |
| 2019-03-15 | 0.512 | 1.959 | 2.361 | 8.778 | 3.156 | 0.719 |
| 2019-03-16 | 0.512 | 1.959 | 2.361 | 8.778 | 3.156 | 0.719 |
| 2019-03-17 | 0.485 | 1.939 | 2.338 | 8.802 | 3.153 | 0.756 |
| 2019-03-18 | 0.471 | 1.936 | 2.311 | 8.801 | 2.303 | 0.75 |
| 2019-03-19 | 0.513 | 2.029 | 2.316 | 8.892 | 2.326 | 0.747 |
| 2019-03-20 | 0.548 | 2.259 | 2.353 | 9.301 | 2.387 | 0.777 |
| 2019-03-21 | 0.548 | 2.259 | 2.353 | 9.301 | 2.387 | 0.777 |
| 2019-03-22 | 0.548 | 2.259 | 2.353 | 9.301 | 2.387 | 0.777 |
| 2019-03-23 | 0.548 | 2.259 | 2.353 | 9.301 | 2.387 | 0.777 |
| 2019-03-24 | 0.593 | 2.305 | 2.385 | 9.615 | 2.649 | 0.834 |
| 2019-03-25 | 0.636 | 2.359 | 2.401 | 9.928 | 2.511 | 0.84 |
| 2019-03-26 | 0.656 | 2.357 | 2.378 | 9.881 | 2.478 | 0.827 |
| 2019-03-27 | 0.682 | 2.321 | 2.364 | 9.688 | 2.426 | 0.798 |
| 2019-03-28 | 0.608 | 2.173 | 2.329 | 9.582 | 2.362 | 0.743 |
| 2019-03-29 | 0.608 | 2.173 | 2.329 | 9.582 | 2.362 | 0.743 |
| 2019-03-30 | 0.608 | 2.173 | 2.329 | 9.582 | 2.362 | 0.743 |
| 2019-03-31 | 0.68 | 2.268 | 2.328 | 9.511 | 2.397 | 0.854 |
| 2019-04-01 | 0.663 | 2.229 | 2.312 | 9.417 | 2.358 | 0.826 |
| 2019-04-02 | 0.64 | 2.177 | 2.295 | 9.4 | 2.347 | 0.768 |
| 2019-04-03 | 0.664 | 2.219 | 2.307 | 9.48 | 2.361 | 0.772 |
| 2019-04-04 | 0.658 | 2.244 | 2.323 | 9.475 | 2.358 | 0.751 |
| 2019-04-05 | 0.658 | 2.244 | 2.323 | 9.475 | 2.358 | 0.751 |
| 2019-04-06 | 0.658 | 2.244 | 2.323 | 9.475 | 2.358 | 0.751 |
| 2019-04-07 | 0.66 | 2.283 | 2.336 | 9.588 | 2.362 | 0.757 |
| 2019-04-08 | 0.658 | 2.315 | 2.347 | 9.719 | 2.379 | 0.79 |
| 2019-04-09 | 0.658 | 2.315 | 2.347 | 9.719 | 2.379 | 0.79 |
| 2019-04-10 | 0.654 | 2.303 | 2.386 | 9.696 | 2.387 | 0.848 |
| 2019-04-11 | 0.616 | 2.257 | 2.359 | 9.599 | 2.356 | 0.822 |
| 2019-04-12 | 0.616 | 2.257 | 2.359 | 9.599 | 2.356 | 0.822 |
| 2019-04-13 | 0.616 | 2.257 | 2.359 | 9.599 | 2.356 | 0.822 |
| 2019-04-14 | 0.627 | 2.227 | 2.334 | 9.61 | 2.357 | 0.806 |
| 2019-04-15 | 0.584 | 2.218 | 2.372 | 9.492 | 2.345 | 0.816 |
| 2019-04-16 | 0.601 | 2.205 | 2.353 | 9.347 | 2.33 | 0.783 |
| 2019-04-17 | 0.594 | 2.179 | 2.32 | 9.406 | 2.311 | 0.73 |
| 2019-04-18 | 0.576 | 2.161 | 2.31 | 9.573 | 2.278 | 0.748 |
| 2019-04-19 | 0.576 | 2.161 | 2.31 | 9.573 | 2.278 | 0.748 |
| 2019-04-20 | 0.576 | 2.161 | 2.31 | 9.573 | 2.278 | 0.748 |
| 2019-04-21 | 0.591 | 2.151 | 2.323 | 9.506 | 2.276 | 0.763 |
| 2019-04-22 | 0.655 | 2.171 | 2.339 | 9.565 | 2.315 | 0.791 |
| 2019-04-23 | 0.636 | 2.151 | 2.328 | 9.66 | 2.278 | 0.789 |
| 2019-04-24 | 0.647 | 2.132 | 2.315 | 9.794 | 2.274 | 0.821 |
| 2019-04-25 | 0.647 | 2.132 | 2.315 | 9.794 | 2.274 | 0.821 |
| 2019-04-26 | 0.647 | 2.132 | 2.315 | 9.794 | 2.274 | 0.821 |
| 2019-04-27 | 0.647 | 2.132 | 2.315 | 9.794 | 2.274 | 0.821 |
| 2019-04-28 | 0.64 | 2.142 | 2.293 | 9.798 | 2.28 | 0.829 |
| 2019-04-29 | 0.608 | 2.168 | 2.307 | 9.869 | 2.274 | 0.772 |
| 2019-04-30 | 0.608 | 2.223 | 2.336 | 9.864 | 2.289 | 0.774 |
| 2019-05-01 | 0.629 | 2.252 | 2.363 | 9.866 | 2.316 | 0.815 |
| 2019-05-02 | 0.63 | 2.252 | 2.355 | 9.742 | 2.299 | 0.802 |
| 2019-05-03 | 0.63 | 2.252 | 2.355 | 9.742 | 2.299 | 0.802 |
| 2019-05-04 | 0.63 | 2.252 | 2.355 | 9.742 | 2.299 | 0.802 |
| 2019-05-05 | 0.648 | 2.268 | 2.335 | 9.615 | 2.312 | 0.802 |
| 2019-05-06 | 0.691 | 2.33 | 2.388 | 9.565 | 2.351 | 0.814 |
| 2019-05-07 | 0.718 | 2.329 | 2.45 | 9.581 | 2.376 | 0.837 |
| 2019-05-08 | 0.718 | 2.329 | 2.45 | 9.581 | 2.376 | 0.837 |
| 2019-05-09 | 0.718 | 2.329 | 2.45 | 9.581 | 2.376 | 0.837 |
| 2019-05-10 | 0.718 | 2.329 | 2.45 | 9.581 | 2.376 | 0.837 |
| 2019-05-11 | 0.718 | 2.329 | 2.45 | 9.581 | 2.376 | 0.837 |
| 2019-05-12 | 0.71 | 2.316 | 2.44 | 9.578 | 2.383 | 0.84 |
| 2019-05-13 | 0.781 | 2.378 | 2.522 | 9.836 | 2.485 | 0.876 |
| 2019-05-14 | 0.774 | 2.345 | 2.48 | 9.679 | 2.459 | 0.847 |
| 2019-05-15 | 0.808 | 2.386 | 2.507 | 9.812 | 2.484 | 0.893 |
| 2019-05-16 | 0.814 | 2.343 | 2.438 | 9.687 | 2.444 | 0.844 |
| 2019-05-17 | 0.814 | 2.343 | 2.438 | 9.687 | 2.444 | 0.844 |
| 2019-05-18 | 0.814 | 2.343 | 2.438 | 9.687 | 2.444 | 0.844 |
| 2019-05-19 | 0.681 | 2.319 | 2.357 | 9.585 | 2.394 | 0.847 |
| 2019-05-20 | 0.735 | 2.316 | 2.389 | 8.457 | 2.396 | 0.834 |
| 2019-05-21 | 0.723 | 2.295 | 2.352 | 8.452 | 2.366 | 0.767 |
| 2019-05-22 | 0.71 | 2.286 | 2.366 | 8.459 | 2.371 | 0.774 |
| 2019-05-23 | 0.673 | 2.276 | 2.385 | 8.574 | 2.367 | 0.758 |
| 2019-05-24 | 0.673 | 2.276 | 2.385 | 8.574 | 2.367 | 0.758 |
| 2019-05-25 | 0.673 | 2.276 | 2.385 | 8.574 | 2.367 | 0.758 |
| 2019-05-26 | 0.631 | 2.279 | 2.372 | 8.669 | 2.361 | 0.739 |
| 2019-05-27 | 0.682 | 2.283 | 2.366 | 8.704 | 2.372 | 0.744 |
| 2019-05-28 | 0.655 | 2.264 | 2.35 | 8.62 | 2.339 | 0.734 |
| 2019-05-29 | 0.689 | 2.354 | 2.365 | 8.732 | 2.376 | 0.713 |
| 2019-05-30 | 0.662 | 2.344 | 2.332 | 8.596 | 2.398 | 0.744 |
| 2019-05-31 | 0.662 | 2.344 | 2.332 | 8.596 | 2.398 | 0.744 |
| 2019-06-01 | 0.662 | 2.344 | 2.332 | 8.596 | 2.398 | 0.744 |
| 2019-06-02 | 0.697 | 2.384 | 2.371 | 8.502 | 2.441 | 0.789 |
| 2019-06-03 | 0.696 | 2.352 | 2.364 | 8.423 | 2.421 | 0.763 |
| 2019-06-04 | 0.66 | 2.315 | 2.36 | 8.365 | 2.393 | 0.726 |
| 2019-06-05 | 0.643 | 2.305 | 2.335 | 8.314 | 2.4 | 0.738 |
| 2019-06-06 | 0.673 | 2.324 | 2.307 | 8.337 | 2.398 | 0.761 |
| 2019-06-07 | 0.673 | 2.324 | 2.307 | 8.337 | 2.398 | 0.761 |
| 2019-06-08 | 0.673 | 2.324 | 2.307 | 8.337 | 2.398 | 0.761 |
| 2019-06-09 | 0.673 | 2.324 | 2.307 | 8.337 | 2.398 | 0.761 |
| 2019-06-10 | 0.66 | 2.274 | 2.276 | 8.284 | 2.366 | 0.77 |
| 2019-06-11 | 0.662 | 2.197 | 2.268 | 8.333 | 2.35 | 0.72 |
| 2019-06-12 | 0.617 | 2.159 | 2.259 | 8.3 | 2.341 | 0.668 |
| 2019-06-13 | 0.63 | 2.168 | 2.211 | 8.344 | 2.333 | 0.675 |
| 2019-06-14 | 0.63 | 2.168 | 2.211 | 8.344 | 2.333 | 0.675 |
| 2019-06-15 | 0.63 | 2.168 | 2.211 | 8.344 | 2.333 | 0.675 |
| 2019-06-16 | 0.609 | 2.178 | 2.229 | 8.691 | 2.357 | 0.696 |
| 2019-06-17 | 0.617 | 2.138 | 2.229 | 8.729 | 2.309 | 0.627 |
| 2019-06-18 | 0.57 | 2.131 | 2.197 | 8.548 | 2.272 | 0.531 |
| 2019-06-19 | 0.56 | 2.138 | 2.187 | 8.499 | 2.25 | 0.562 |
| 2019-06-20 | 0.54 | 2.113 | 2.215 | 8.279 | 2.243 | 0.545 |
| 2019-06-21 | 0.54 | 2.113 | 2.215 | 8.279 | 2.243 | 0.545 |
| 2019-06-22 | 0.54 | 2.113 | 2.215 | 8.279 | 2.243 | 0.545 |
| 2019-06-23 | 0.58 | 1.965 | 2.238 | 8.149 | 2.236 | 0.558 |
| 2019-06-24 | 0.564 | 2.087 | 2.227 | 8.079 | 2.219 | 0.573 |
| 2019-06-25 | 0.595 | 2.154 | 2.229 | 8.16 | 2.26 | 0.661 |
| 2019-06-26 | 0.597 | 2.094 | 2.239 | 7.941 | 2.28 | 0.74 |
| 2019-06-27 | 0.627 | 2.099 | 2.272 | 7.875 | 2.287 | 0.728 |
| 2019-06-28 | 0.627 | 2.099 | 2.272 | 7.875 | 2.287 | 0.728 |
| 2019-06-29 | 0.627 | 2.099 | 2.272 | 7.875 | 2.287 | 0.728 |
| 2019-06-30 | 0.62 | 2.073 | 2.194 | 7.891 | 2.294 | 0.662 |
| 2019-07-01 | 0.573 | 2.046 | 2.167 | 7.599 | 2.243 | 0.644 |
| 2019-07-02 | 0.535 | 2.031 | 2.157 | 7.403 | 2.214 | 0.626 |
| 2019-07-03 | 0.517 | 2.022 | 2.154 | 7.264 | 2.211 | 0.607 |
| 2019-07-04 | 0.499 | 2 | 2.141 | 7.263 | 2.17 | 0.602 |
| 2019-07-05 | 0.499 | 2 | 2.141 | 7.263 | 2.17 | 0.602 |
| 2019-07-06 | 0.499 | 2 | 2.141 | 7.263 | 2.17 | 0.602 |
| 2019-07-07 | 0.484 | 2.01 | 2.091 | 7.155 | 2.159 | 0.601 |
| 2019-07-08 | 0.514 | 2.011 | 2.066 | 7.166 | 2.171 | 0.615 |
| 2019-07-09 | 0.508 | 2.061 | 2.045 | 7.067 | 2.178 | 0.623 |
| 2019-07-10 | 0.515 | 2.061 | 2.085 | 7.051 | 2.2 | 0.579 |
| 2019-07-11 | 0.532 | 2.048 | 2.077 | 7.088 | 2.209 | 0.626 |
| 2019-07-12 | 0.532 | 2.048 | 2.077 | 7.088 | 2.209 | 0.626 |
| 2019-07-13 | 0.532 | 2.048 | 2.077 | 7.088 | 2.209 | 0.626 |
| 2019-07-14 | 0.51 | 2.026 | 2.062 | 7.151 | 2.199 | 0.619 |
| 2019-07-15 | 0.432 | 1.991 | 2.077 | 7.121 | 2.162 | 0.489 |
| 2019-07-16 | 0.418 | 1.958 | 2.094 | 7.07 | 2.138 | 0.529 |
| 2019-07-17 | 0.421 | 1.958 | 2.126 | 7.172 | 2.136 | 0.5 |
| 2019-07-18 | 0.436 | 1.973 | 2.13 | 7.397 | 2.165 | 0.548 |
| 2019-07-19 | 0.436 | 1.973 | 2.13 | 7.397 | 2.165 | 0.548 |
| 2019-07-20 | 0.436 | 1.973 | 2.13 | 7.397 | 2.165 | 0.548 |
| 2019-07-21 | 0.487 | 1.997 | 2.139 | 7.427 | 2.199 | 0.597 |
| 2019-07-22 | 0.451 | 1.993 | 2.157 | 7.468 | 2.192 | 0.64 |
| 2019-07-23 | 0.508 | 2.031 | 2.147 | 7.789 | 2.204 | 0.703 |
| 2019-07-24 | 0.489 | 1.993 | 2.16 | 7.608 | 2.175 | 0.655 |
| 2019-07-25 | 0.487 | 1.997 | 2.104 | 7.691 | 2.153 | 0.578 |
| 2019-07-26 | 0.487 | 1.997 | 2.104 | 7.691 | 2.153 | 0.578 |
| 2019-07-27 | 0.487 | 1.997 | 2.104 | 7.691 | 2.153 | 0.578 |
| 2019-07-28 | 0.491 | 1.987 | 2.103 | 7.729 | 2.155 | 0.666 |
| 2019-07-29 | 0.512 | 2.011 | 2.111 | 7.742 | 2.177 | 0.651 |
| 2019-07-30 | 0.531 | 2.048 | 2.125 | 7.68 | 2.181 | 0.707 |
| 2019-07-31 | 0.607 | 2.098 | 2.148 | 7.791 | 2.233 | 0.904 |
| 2019-08-01 | 0.612 | 2.059 | 2.097 | 7.847 | 2.181 | 0.809 |
| 2019-08-02 | 0.612 | 2.059 | 2.097 | 7.847 | 2.181 | 0.809 |
| 2019-08-03 | 0.612 | 2.059 | 2.097 | 7.847 | 2.181 | 0.809 |
| 2019-08-04 | 0.586 | 2.083 | 2.119 | 5.648 | 2.19 | 0.788 |
| 2019-08-05 | 0.618 | 2.11 | 2.114 | 5.905 | 2.215 | 0.816 |
| 2019-08-06 | 0.705 | 2.178 | 2.108 | 5.997 | 2.239 | 0.869 |
| 2019-08-07 | 0.692 | 2.304 | 2.157 | 6.306 | 2.283 | 0.922 |
| 2019-08-08 | 0.663 | 2.292 | 2.134 | 6.638 | 2.272 | 0.89 |
| 2019-08-09 | 0.663 | 2.292 | 2.134 | 6.638 | 2.272 | 0.89 |
| 2019-08-10 | 0.663 | 2.292 | 2.134 | 6.638 | 2.272 | 0.89 |
| 2019-08-11 | 0.663 | 2.292 | 2.134 | 6.638 | 2.272 | 0.89 |
| 2019-08-12 | 0.534 | 2.272 | 2.073 | 6.835 | 2.216 | 0.806 |
| 2019-08-13 | 0.559 | 2.297 | 2.078 | 6.74 | 2.217 | 0.831 |
| 2019-08-14 | 0.615 | 2.366 | 2.156 | 7.088 | 2.273 | 0.85 |
| 2019-08-15 | 0.689 | 2.494 | 2.285 | 7.719 | 2.391 | 0.936 |
| 2019-08-16 | 0.689 | 2.494 | 2.285 | 7.719 | 2.391 | 0.936 |
| 2019-08-17 | 0.689 | 2.494 | 2.285 | 7.719 | 2.391 | 0.936 |
| 2019-08-18 | 0.609 | 2.474 | 2.297 | 7.616 | 2.365 | 0.864 |
| 2019-08-19 | 0.641 | 2.533 | 2.183 | 7.468 | 2.317 | 0.835 |
| 2019-08-20 | 0.674 | 2.516 | 2.148 | 7.455 | 2.323 | 0.875 |
| 2019-08-21 | 0.605 | 2.406 | 2.033 | 7.12 | 2.205 | 0.777 |
| 2019-08-22 | 0.612 | 2.46 | 1.998 | 6.896 | 1.817 | 0.709 |
| 2019-08-23 | 0.612 | 2.46 | 1.998 | 6.896 | 1.817 | 0.709 |
| 2019-08-24 | 0.612 | 2.46 | 1.998 | 6.896 | 1.817 | 0.709 |
| 2019-08-25 | 0.638 | 2.556 | 2.086 | 7.052 | 1.872 | 0.721 |
| 2019-08-26 | 0.646 | 2.536 | 2.08 | 7.005 | 1.872 | 0.803 |
| 2019-08-27 | 0.632 | 2.517 | 2.068 | 6.927 | 1.842 | 0.719 |
| 2019-08-28 | 0.66 | 2.54 | 2.095 | 6.712 | 1.853 | 0.803 |
| 2019-08-29 | 0.595 | 2.397 | 2.093 | 6.36 | 1.788 | 0.812 |
| 2019-08-30 | 0.595 | 2.397 | 2.093 | 6.36 | 1.788 | 0.812 |
| 2019-08-31 | 0.595 | 2.397 | 2.093 | 6.36 | 1.788 | 0.812 |
| 2019-09-01 | 0.584 | 2.43 | 2.088 | 6.371 | 1.772 | 0.679 |
| 2019-09-02 | 0.511 | 2.359 | 2.042 | 6.219 | 1.709 | 0.483 |
| 2019-09-03 | 0.566 | 2.423 | 2.067 | 6.668 | 1.714 | 0.491 |
| 2019-09-04 | 0.589 | 2.417 | 2.039 | 6.729 | 1.707 | 0.495 |
| 2019-09-05 | 0.602 | 2.428 | 2.02 | 6.763 | 1.694 | 0.376 |
| 2019-09-06 | 0.602 | 2.428 | 2.02 | 6.763 | 1.694 | 0.376 |
| 2019-09-07 | 0.602 | 2.428 | 2.02 | 6.763 | 1.694 | 0.376 |
| 2019-09-08 | 0.618 | 2.467 | 2.047 | 6.844 | 1.714 | 0.612 |